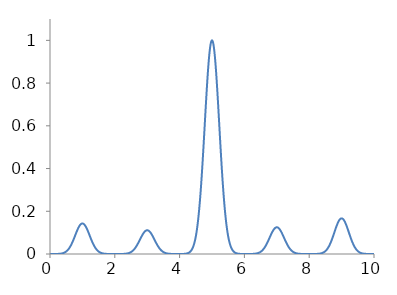
| Category | Series 0 |
|---|---|
| 0.0 | 0 |
| 0.001 | 0 |
| 0.002 | 0 |
| 0.003 | 0 |
| 0.004 | 0 |
| 0.005 | 0 |
| 0.006 | 0 |
| 0.007 | 0 |
| 0.008 | 0 |
| 0.009 | 0 |
| 0.01 | 0 |
| 0.011 | 0 |
| 0.012 | 0 |
| 0.013 | 0 |
| 0.014 | 0 |
| 0.015 | 0 |
| 0.016 | 0 |
| 0.017 | 0 |
| 0.018 | 0 |
| 0.019 | 0 |
| 0.02 | 0 |
| 0.021 | 0 |
| 0.022 | 0 |
| 0.023 | 0 |
| 0.024 | 0 |
| 0.025 | 0 |
| 0.026 | 0 |
| 0.027 | 0 |
| 0.028 | 0 |
| 0.029 | 0 |
| 0.03 | 0 |
| 0.031 | 0 |
| 0.032 | 0 |
| 0.033 | 0 |
| 0.034 | 0 |
| 0.035 | 0 |
| 0.036 | 0 |
| 0.037 | 0 |
| 0.038 | 0 |
| 0.039 | 0 |
| 0.04 | 0 |
| 0.041 | 0 |
| 0.042 | 0 |
| 0.043 | 0 |
| 0.044 | 0 |
| 0.045 | 0 |
| 0.046 | 0 |
| 0.047 | 0 |
| 0.048 | 0 |
| 0.049 | 0 |
| 0.05 | 0 |
| 0.051 | 0 |
| 0.052 | 0 |
| 0.053 | 0 |
| 0.054 | 0 |
| 0.055 | 0 |
| 0.056 | 0 |
| 0.057 | 0 |
| 0.058 | 0 |
| 0.059 | 0 |
| 0.06 | 0 |
| 0.061 | 0 |
| 0.062 | 0 |
| 0.063 | 0 |
| 0.064 | 0 |
| 0.065 | 0 |
| 0.066 | 0 |
| 0.067 | 0 |
| 0.068 | 0 |
| 0.069 | 0 |
| 0.07 | 0 |
| 0.071 | 0 |
| 0.072 | 0 |
| 0.073 | 0 |
| 0.074 | 0 |
| 0.075 | 0 |
| 0.076 | 0 |
| 0.077 | 0 |
| 0.078 | 0 |
| 0.079 | 0 |
| 0.08 | 0 |
| 0.081 | 0 |
| 0.082 | 0 |
| 0.083 | 0 |
| 0.084 | 0 |
| 0.085 | 0 |
| 0.086 | 0 |
| 0.087 | 0 |
| 0.088 | 0 |
| 0.089 | 0 |
| 0.09 | 0 |
| 0.091 | 0 |
| 0.092 | 0 |
| 0.093 | 0 |
| 0.094 | 0 |
| 0.095 | 0 |
| 0.096 | 0 |
| 0.097 | 0 |
| 0.098 | 0 |
| 0.099 | 0 |
| 0.1 | 0 |
| 0.101 | 0 |
| 0.102 | 0 |
| 0.103 | 0 |
| 0.104 | 0 |
| 0.105 | 0 |
| 0.106 | 0 |
| 0.107 | 0 |
| 0.108 | 0 |
| 0.109 | 0 |
| 0.11 | 0 |
| 0.111 | 0 |
| 0.112 | 0 |
| 0.113 | 0 |
| 0.114 | 0 |
| 0.115 | 0 |
| 0.116 | 0 |
| 0.117 | 0 |
| 0.118 | 0 |
| 0.119 | 0 |
| 0.12 | 0 |
| 0.121 | 0 |
| 0.122 | 0 |
| 0.123 | 0 |
| 0.124 | 0 |
| 0.125 | 0 |
| 0.126 | 0 |
| 0.127 | 0 |
| 0.128 | 0 |
| 0.129 | 0 |
| 0.13 | 0 |
| 0.131 | 0 |
| 0.132 | 0 |
| 0.133 | 0 |
| 0.134 | 0 |
| 0.135 | 0 |
| 0.136 | 0 |
| 0.137 | 0 |
| 0.138 | 0 |
| 0.139 | 0 |
| 0.14 | 0 |
| 0.141 | 0 |
| 0.142 | 0 |
| 0.143 | 0 |
| 0.144 | 0 |
| 0.145 | 0 |
| 0.146 | 0 |
| 0.147 | 0 |
| 0.148 | 0 |
| 0.149 | 0 |
| 0.15 | 0 |
| 0.151 | 0 |
| 0.152 | 0 |
| 0.153 | 0 |
| 0.154 | 0 |
| 0.155 | 0 |
| 0.156 | 0 |
| 0.157 | 0 |
| 0.158 | 0 |
| 0.159 | 0 |
| 0.16 | 0 |
| 0.161 | 0 |
| 0.162 | 0 |
| 0.163 | 0 |
| 0.164 | 0 |
| 0.165 | 0 |
| 0.166 | 0 |
| 0.167 | 0 |
| 0.168 | 0 |
| 0.169 | 0 |
| 0.17 | 0 |
| 0.171 | 0 |
| 0.172 | 0 |
| 0.173 | 0 |
| 0.174 | 0 |
| 0.175 | 0 |
| 0.176 | 0 |
| 0.177 | 0 |
| 0.178 | 0 |
| 0.179 | 0 |
| 0.18 | 0 |
| 0.181 | 0 |
| 0.182 | 0 |
| 0.183 | 0 |
| 0.184 | 0 |
| 0.185 | 0 |
| 0.186 | 0 |
| 0.187 | 0 |
| 0.188 | 0 |
| 0.189 | 0 |
| 0.19 | 0 |
| 0.191 | 0 |
| 0.192 | 0 |
| 0.193 | 0 |
| 0.194 | 0 |
| 0.195 | 0 |
| 0.196 | 0 |
| 0.197 | 0 |
| 0.198 | 0 |
| 0.199 | 0 |
| 0.2 | 0 |
| 0.201 | 0 |
| 0.202 | 0 |
| 0.203 | 0 |
| 0.204 | 0 |
| 0.205 | 0 |
| 0.206 | 0 |
| 0.207 | 0 |
| 0.208 | 0 |
| 0.209 | 0 |
| 0.21 | 0 |
| 0.211 | 0 |
| 0.212 | 0 |
| 0.213 | 0 |
| 0.214 | 0 |
| 0.215 | 0 |
| 0.216 | 0 |
| 0.217 | 0 |
| 0.218 | 0 |
| 0.219 | 0 |
| 0.22 | 0 |
| 0.221 | 0 |
| 0.222 | 0 |
| 0.223 | 0 |
| 0.224 | 0 |
| 0.225 | 0 |
| 0.226 | 0 |
| 0.227 | 0 |
| 0.228 | 0 |
| 0.229 | 0 |
| 0.23 | 0 |
| 0.231 | 0 |
| 0.232 | 0 |
| 0.233 | 0 |
| 0.234 | 0 |
| 0.235 | 0 |
| 0.236 | 0 |
| 0.237 | 0 |
| 0.238 | 0 |
| 0.239 | 0 |
| 0.24 | 0 |
| 0.241 | 0 |
| 0.242 | 0 |
| 0.243 | 0 |
| 0.244 | 0 |
| 0.245 | 0 |
| 0.246 | 0 |
| 0.247 | 0 |
| 0.248 | 0 |
| 0.249 | 0.001 |
| 0.25 | 0.001 |
| 0.251 | 0.001 |
| 0.252 | 0.001 |
| 0.253 | 0.001 |
| 0.254 | 0.001 |
| 0.255 | 0.001 |
| 0.256 | 0.001 |
| 0.257 | 0.001 |
| 0.258 | 0.001 |
| 0.259 | 0.001 |
| 0.26 | 0.001 |
| 0.261 | 0.001 |
| 0.262 | 0.001 |
| 0.263 | 0.001 |
| 0.264 | 0.001 |
| 0.265 | 0.001 |
| 0.266 | 0.001 |
| 0.267 | 0.001 |
| 0.268 | 0.001 |
| 0.269 | 0.001 |
| 0.27 | 0.001 |
| 0.271 | 0.001 |
| 0.272 | 0.001 |
| 0.273 | 0.001 |
| 0.274 | 0.001 |
| 0.275 | 0.001 |
| 0.276 | 0.001 |
| 0.277 | 0.001 |
| 0.278 | 0.001 |
| 0.279 | 0.001 |
| 0.28 | 0.001 |
| 0.281 | 0.001 |
| 0.282 | 0.001 |
| 0.283 | 0.001 |
| 0.284 | 0.001 |
| 0.285 | 0.001 |
| 0.286 | 0.001 |
| 0.287 | 0.001 |
| 0.288 | 0.001 |
| 0.289 | 0.001 |
| 0.29 | 0.001 |
| 0.291 | 0.001 |
| 0.292 | 0.001 |
| 0.293 | 0.001 |
| 0.294 | 0.001 |
| 0.295 | 0.001 |
| 0.296 | 0.001 |
| 0.297 | 0.001 |
| 0.298 | 0.001 |
| 0.299 | 0.001 |
| 0.3 | 0.001 |
| 0.301 | 0.001 |
| 0.302 | 0.001 |
| 0.303 | 0.001 |
| 0.304 | 0.001 |
| 0.305 | 0.001 |
| 0.306 | 0.001 |
| 0.307 | 0.001 |
| 0.308 | 0.001 |
| 0.309 | 0.001 |
| 0.31 | 0.001 |
| 0.311 | 0.001 |
| 0.312 | 0.001 |
| 0.313 | 0.001 |
| 0.314 | 0.001 |
| 0.315 | 0.001 |
| 0.316 | 0.001 |
| 0.317 | 0.001 |
| 0.318 | 0.001 |
| 0.319 | 0.001 |
| 0.32 | 0.001 |
| 0.321 | 0.001 |
| 0.322 | 0.001 |
| 0.323 | 0.001 |
| 0.324 | 0.001 |
| 0.325 | 0.002 |
| 0.326 | 0.002 |
| 0.327 | 0.002 |
| 0.328 | 0.002 |
| 0.329 | 0.002 |
| 0.33 | 0.002 |
| 0.331 | 0.002 |
| 0.332 | 0.002 |
| 0.333 | 0.002 |
| 0.334 | 0.002 |
| 0.335 | 0.002 |
| 0.336 | 0.002 |
| 0.337 | 0.002 |
| 0.338 | 0.002 |
| 0.339 | 0.002 |
| 0.34 | 0.002 |
| 0.341 | 0.002 |
| 0.342 | 0.002 |
| 0.343 | 0.002 |
| 0.344 | 0.002 |
| 0.345 | 0.002 |
| 0.346 | 0.002 |
| 0.347 | 0.002 |
| 0.348 | 0.002 |
| 0.349 | 0.002 |
| 0.35 | 0.002 |
| 0.351 | 0.002 |
| 0.352 | 0.002 |
| 0.353 | 0.002 |
| 0.354 | 0.002 |
| 0.355 | 0.002 |
| 0.356 | 0.002 |
| 0.357 | 0.002 |
| 0.358 | 0.002 |
| 0.359 | 0.002 |
| 0.36 | 0.002 |
| 0.361 | 0.002 |
| 0.362 | 0.002 |
| 0.363 | 0.002 |
| 0.364 | 0.003 |
| 0.365 | 0.003 |
| 0.366 | 0.003 |
| 0.367 | 0.003 |
| 0.368 | 0.003 |
| 0.369 | 0.003 |
| 0.37 | 0.003 |
| 0.371 | 0.003 |
| 0.372 | 0.003 |
| 0.373 | 0.003 |
| 0.374 | 0.003 |
| 0.375 | 0.003 |
| 0.376 | 0.003 |
| 0.377 | 0.003 |
| 0.378 | 0.003 |
| 0.379 | 0.003 |
| 0.38 | 0.003 |
| 0.381 | 0.003 |
| 0.382 | 0.003 |
| 0.383 | 0.003 |
| 0.384 | 0.003 |
| 0.385 | 0.003 |
| 0.386 | 0.003 |
| 0.387 | 0.003 |
| 0.388 | 0.003 |
| 0.389 | 0.003 |
| 0.39 | 0.003 |
| 0.391 | 0.004 |
| 0.392 | 0.004 |
| 0.393 | 0.004 |
| 0.394 | 0.004 |
| 0.395 | 0.004 |
| 0.396 | 0.004 |
| 0.397 | 0.004 |
| 0.398 | 0.004 |
| 0.399 | 0.004 |
| 0.4 | 0.004 |
| 0.401 | 0.004 |
| 0.402 | 0.004 |
| 0.403 | 0.004 |
| 0.404 | 0.004 |
| 0.405 | 0.004 |
| 0.406 | 0.004 |
| 0.407 | 0.004 |
| 0.408 | 0.004 |
| 0.409 | 0.004 |
| 0.41 | 0.004 |
| 0.411 | 0.004 |
| 0.412 | 0.005 |
| 0.413 | 0.005 |
| 0.414 | 0.005 |
| 0.415 | 0.005 |
| 0.416 | 0.005 |
| 0.417 | 0.005 |
| 0.418 | 0.005 |
| 0.419 | 0.005 |
| 0.42 | 0.005 |
| 0.421 | 0.005 |
| 0.422 | 0.005 |
| 0.423 | 0.005 |
| 0.424 | 0.005 |
| 0.425 | 0.005 |
| 0.426 | 0.005 |
| 0.427 | 0.005 |
| 0.428 | 0.005 |
| 0.429 | 0.005 |
| 0.43 | 0.006 |
| 0.431 | 0.006 |
| 0.432 | 0.006 |
| 0.433 | 0.006 |
| 0.434 | 0.006 |
| 0.435 | 0.006 |
| 0.436 | 0.006 |
| 0.437 | 0.006 |
| 0.438 | 0.006 |
| 0.439 | 0.006 |
| 0.44 | 0.006 |
| 0.441 | 0.006 |
| 0.442 | 0.006 |
| 0.443 | 0.006 |
| 0.444 | 0.006 |
| 0.445 | 0.007 |
| 0.446 | 0.007 |
| 0.447 | 0.007 |
| 0.448 | 0.007 |
| 0.449 | 0.007 |
| 0.45 | 0.007 |
| 0.451 | 0.007 |
| 0.452 | 0.007 |
| 0.453 | 0.007 |
| 0.454 | 0.007 |
| 0.455 | 0.007 |
| 0.456 | 0.007 |
| 0.457 | 0.007 |
| 0.458 | 0.008 |
| 0.459 | 0.008 |
| 0.46 | 0.008 |
| 0.461 | 0.008 |
| 0.462 | 0.008 |
| 0.463 | 0.008 |
| 0.464 | 0.008 |
| 0.465 | 0.008 |
| 0.466 | 0.008 |
| 0.467 | 0.008 |
| 0.468 | 0.008 |
| 0.469 | 0.009 |
| 0.47 | 0.009 |
| 0.471 | 0.009 |
| 0.472 | 0.009 |
| 0.473 | 0.009 |
| 0.474 | 0.009 |
| 0.475 | 0.009 |
| 0.476 | 0.009 |
| 0.477 | 0.009 |
| 0.478 | 0.009 |
| 0.479 | 0.009 |
| 0.48 | 0.01 |
| 0.481 | 0.01 |
| 0.482 | 0.01 |
| 0.483 | 0.01 |
| 0.484 | 0.01 |
| 0.485 | 0.01 |
| 0.486 | 0.01 |
| 0.487 | 0.01 |
| 0.488 | 0.01 |
| 0.489 | 0.01 |
| 0.49 | 0.011 |
| 0.491 | 0.011 |
| 0.492 | 0.011 |
| 0.493 | 0.011 |
| 0.494 | 0.011 |
| 0.495 | 0.011 |
| 0.496 | 0.011 |
| 0.497 | 0.011 |
| 0.498 | 0.011 |
| 0.499 | 0.012 |
| 0.5 | 0.012 |
| 0.501 | 0.012 |
| 0.502 | 0.012 |
| 0.503 | 0.012 |
| 0.504 | 0.012 |
| 0.505 | 0.012 |
| 0.506 | 0.012 |
| 0.507 | 0.013 |
| 0.508 | 0.013 |
| 0.509 | 0.013 |
| 0.51 | 0.013 |
| 0.511 | 0.013 |
| 0.512 | 0.013 |
| 0.513 | 0.013 |
| 0.514 | 0.013 |
| 0.515 | 0.014 |
| 0.516 | 0.014 |
| 0.517 | 0.014 |
| 0.518 | 0.014 |
| 0.519 | 0.014 |
| 0.52 | 0.014 |
| 0.521 | 0.014 |
| 0.522 | 0.015 |
| 0.523 | 0.015 |
| 0.524 | 0.015 |
| 0.525 | 0.015 |
| 0.526 | 0.015 |
| 0.527 | 0.015 |
| 0.528 | 0.015 |
| 0.529 | 0.016 |
| 0.53 | 0.016 |
| 0.531 | 0.016 |
| 0.532 | 0.016 |
| 0.533 | 0.016 |
| 0.534 | 0.016 |
| 0.535 | 0.016 |
| 0.536 | 0.017 |
| 0.537 | 0.017 |
| 0.538 | 0.017 |
| 0.539 | 0.017 |
| 0.54 | 0.017 |
| 0.541 | 0.017 |
| 0.542 | 0.018 |
| 0.543 | 0.018 |
| 0.544 | 0.018 |
| 0.545 | 0.018 |
| 0.546 | 0.018 |
| 0.547 | 0.018 |
| 0.548 | 0.019 |
| 0.549 | 0.019 |
| 0.55 | 0.019 |
| 0.551 | 0.019 |
| 0.552 | 0.019 |
| 0.553 | 0.019 |
| 0.554 | 0.02 |
| 0.555 | 0.02 |
| 0.556 | 0.02 |
| 0.557 | 0.02 |
| 0.558 | 0.02 |
| 0.559 | 0.02 |
| 0.56 | 0.021 |
| 0.561 | 0.021 |
| 0.562 | 0.021 |
| 0.563 | 0.021 |
| 0.564 | 0.021 |
| 0.565 | 0.022 |
| 0.566 | 0.022 |
| 0.567 | 0.022 |
| 0.568 | 0.022 |
| 0.569 | 0.022 |
| 0.57 | 0.022 |
| 0.571 | 0.023 |
| 0.572 | 0.023 |
| 0.573 | 0.023 |
| 0.574 | 0.023 |
| 0.575 | 0.023 |
| 0.576 | 0.024 |
| 0.577 | 0.024 |
| 0.578 | 0.024 |
| 0.579 | 0.024 |
| 0.58 | 0.024 |
| 0.581 | 0.025 |
| 0.582 | 0.025 |
| 0.583 | 0.025 |
| 0.584 | 0.025 |
| 0.585 | 0.026 |
| 0.586 | 0.026 |
| 0.587 | 0.026 |
| 0.588 | 0.026 |
| 0.589 | 0.026 |
| 0.59 | 0.027 |
| 0.591 | 0.027 |
| 0.592 | 0.027 |
| 0.593 | 0.027 |
| 0.594 | 0.027 |
| 0.595 | 0.028 |
| 0.596 | 0.028 |
| 0.597 | 0.028 |
| 0.598 | 0.028 |
| 0.599 | 0.029 |
| 0.6 | 0.029 |
| 0.601 | 0.029 |
| 0.602 | 0.029 |
| 0.603 | 0.03 |
| 0.604 | 0.03 |
| 0.605 | 0.03 |
| 0.606 | 0.03 |
| 0.607 | 0.03 |
| 0.608 | 0.031 |
| 0.609 | 0.031 |
| 0.61 | 0.031 |
| 0.611 | 0.031 |
| 0.612 | 0.032 |
| 0.613 | 0.032 |
| 0.614 | 0.032 |
| 0.615 | 0.032 |
| 0.616 | 0.033 |
| 0.617 | 0.033 |
| 0.618 | 0.033 |
| 0.619 | 0.033 |
| 0.62 | 0.034 |
| 0.621 | 0.034 |
| 0.622 | 0.034 |
| 0.623 | 0.034 |
| 0.624 | 0.035 |
| 0.625 | 0.035 |
| 0.626 | 0.035 |
| 0.627 | 0.036 |
| 0.628 | 0.036 |
| 0.629 | 0.036 |
| 0.63 | 0.036 |
| 0.631 | 0.037 |
| 0.632 | 0.037 |
| 0.633 | 0.037 |
| 0.634 | 0.037 |
| 0.635 | 0.038 |
| 0.636 | 0.038 |
| 0.637 | 0.038 |
| 0.638 | 0.039 |
| 0.639 | 0.039 |
| 0.64 | 0.039 |
| 0.641 | 0.039 |
| 0.642 | 0.04 |
| 0.643 | 0.04 |
| 0.644 | 0.04 |
| 0.645 | 0.041 |
| 0.646 | 0.041 |
| 0.647 | 0.041 |
| 0.648 | 0.041 |
| 0.649 | 0.042 |
| 0.65 | 0.042 |
| 0.651 | 0.042 |
| 0.652 | 0.043 |
| 0.653 | 0.043 |
| 0.654 | 0.043 |
| 0.655 | 0.043 |
| 0.656 | 0.044 |
| 0.657 | 0.044 |
| 0.658 | 0.044 |
| 0.659 | 0.045 |
| 0.66 | 0.045 |
| 0.661 | 0.045 |
| 0.662 | 0.046 |
| 0.663 | 0.046 |
| 0.664 | 0.046 |
| 0.665 | 0.047 |
| 0.666 | 0.047 |
| 0.667 | 0.047 |
| 0.668 | 0.047 |
| 0.669 | 0.048 |
| 0.67 | 0.048 |
| 0.671 | 0.048 |
| 0.672 | 0.049 |
| 0.673 | 0.049 |
| 0.674 | 0.049 |
| 0.675 | 0.05 |
| 0.676 | 0.05 |
| 0.677 | 0.05 |
| 0.678 | 0.051 |
| 0.679 | 0.051 |
| 0.68 | 0.051 |
| 0.681 | 0.052 |
| 0.682 | 0.052 |
| 0.683 | 0.052 |
| 0.684 | 0.053 |
| 0.685 | 0.053 |
| 0.686 | 0.053 |
| 0.687 | 0.054 |
| 0.688 | 0.054 |
| 0.689 | 0.054 |
| 0.69 | 0.055 |
| 0.691 | 0.055 |
| 0.692 | 0.055 |
| 0.693 | 0.056 |
| 0.694 | 0.056 |
| 0.695 | 0.056 |
| 0.696 | 0.057 |
| 0.697 | 0.057 |
| 0.698 | 0.057 |
| 0.699 | 0.058 |
| 0.7 | 0.058 |
| 0.701 | 0.058 |
| 0.702 | 0.059 |
| 0.703 | 0.059 |
| 0.704 | 0.059 |
| 0.705 | 0.06 |
| 0.706 | 0.06 |
| 0.707 | 0.061 |
| 0.708 | 0.061 |
| 0.709 | 0.061 |
| 0.71 | 0.062 |
| 0.711 | 0.062 |
| 0.712 | 0.062 |
| 0.713 | 0.063 |
| 0.714 | 0.063 |
| 0.715 | 0.063 |
| 0.716 | 0.064 |
| 0.717 | 0.064 |
| 0.718 | 0.064 |
| 0.719 | 0.065 |
| 0.72 | 0.065 |
| 0.721 | 0.066 |
| 0.722 | 0.066 |
| 0.723 | 0.066 |
| 0.724 | 0.067 |
| 0.725 | 0.067 |
| 0.726 | 0.067 |
| 0.727 | 0.068 |
| 0.728 | 0.068 |
| 0.729 | 0.069 |
| 0.73 | 0.069 |
| 0.731 | 0.069 |
| 0.732 | 0.07 |
| 0.733 | 0.07 |
| 0.734 | 0.07 |
| 0.735 | 0.071 |
| 0.736 | 0.071 |
| 0.737 | 0.072 |
| 0.738 | 0.072 |
| 0.739 | 0.072 |
| 0.74 | 0.073 |
| 0.741 | 0.073 |
| 0.742 | 0.073 |
| 0.743 | 0.074 |
| 0.744 | 0.074 |
| 0.745 | 0.075 |
| 0.746 | 0.075 |
| 0.747 | 0.075 |
| 0.748 | 0.076 |
| 0.749 | 0.076 |
| 0.75 | 0.076 |
| 0.751 | 0.077 |
| 0.752 | 0.077 |
| 0.753 | 0.078 |
| 0.754 | 0.078 |
| 0.755 | 0.078 |
| 0.756 | 0.079 |
| 0.757 | 0.079 |
| 0.758 | 0.08 |
| 0.759 | 0.08 |
| 0.76 | 0.08 |
| 0.761 | 0.081 |
| 0.762 | 0.081 |
| 0.763 | 0.081 |
| 0.764 | 0.082 |
| 0.765 | 0.082 |
| 0.766 | 0.083 |
| 0.767 | 0.083 |
| 0.768 | 0.083 |
| 0.769 | 0.084 |
| 0.77 | 0.084 |
| 0.771 | 0.085 |
| 0.772 | 0.085 |
| 0.773 | 0.085 |
| 0.774 | 0.086 |
| 0.775 | 0.086 |
| 0.776 | 0.086 |
| 0.777 | 0.087 |
| 0.778 | 0.087 |
| 0.779 | 0.088 |
| 0.78 | 0.088 |
| 0.781 | 0.088 |
| 0.782 | 0.089 |
| 0.783 | 0.089 |
| 0.784 | 0.09 |
| 0.785 | 0.09 |
| 0.786 | 0.09 |
| 0.787 | 0.091 |
| 0.788 | 0.091 |
| 0.789 | 0.092 |
| 0.79 | 0.092 |
| 0.791 | 0.092 |
| 0.792 | 0.093 |
| 0.793 | 0.093 |
| 0.794 | 0.093 |
| 0.795 | 0.094 |
| 0.796 | 0.094 |
| 0.797 | 0.095 |
| 0.798 | 0.095 |
| 0.799 | 0.095 |
| 0.8 | 0.096 |
| 0.801 | 0.096 |
| 0.802 | 0.097 |
| 0.803 | 0.097 |
| 0.804 | 0.097 |
| 0.805 | 0.098 |
| 0.806 | 0.098 |
| 0.807 | 0.098 |
| 0.808 | 0.099 |
| 0.809 | 0.099 |
| 0.81 | 0.1 |
| 0.811 | 0.1 |
| 0.812 | 0.1 |
| 0.813 | 0.101 |
| 0.814 | 0.101 |
| 0.815 | 0.101 |
| 0.816 | 0.102 |
| 0.817 | 0.102 |
| 0.818 | 0.103 |
| 0.819 | 0.103 |
| 0.82 | 0.103 |
| 0.821 | 0.104 |
| 0.822 | 0.104 |
| 0.823 | 0.104 |
| 0.824 | 0.105 |
| 0.825 | 0.105 |
| 0.826 | 0.106 |
| 0.827 | 0.106 |
| 0.828 | 0.106 |
| 0.829 | 0.107 |
| 0.83 | 0.107 |
| 0.831 | 0.107 |
| 0.832 | 0.108 |
| 0.833 | 0.108 |
| 0.834 | 0.108 |
| 0.835 | 0.109 |
| 0.836 | 0.109 |
| 0.837 | 0.11 |
| 0.838 | 0.11 |
| 0.839 | 0.11 |
| 0.84 | 0.111 |
| 0.841 | 0.111 |
| 0.842 | 0.111 |
| 0.843 | 0.112 |
| 0.844 | 0.112 |
| 0.845 | 0.112 |
| 0.846 | 0.113 |
| 0.847 | 0.113 |
| 0.848 | 0.113 |
| 0.849 | 0.114 |
| 0.85 | 0.114 |
| 0.851 | 0.114 |
| 0.852 | 0.115 |
| 0.853 | 0.115 |
| 0.854 | 0.115 |
| 0.855 | 0.116 |
| 0.856 | 0.116 |
| 0.857 | 0.116 |
| 0.858 | 0.117 |
| 0.859 | 0.117 |
| 0.86 | 0.117 |
| 0.861 | 0.118 |
| 0.862 | 0.118 |
| 0.863 | 0.118 |
| 0.864 | 0.119 |
| 0.865 | 0.119 |
| 0.866 | 0.119 |
| 0.867 | 0.12 |
| 0.868 | 0.12 |
| 0.869 | 0.12 |
| 0.87 | 0.121 |
| 0.871 | 0.121 |
| 0.872 | 0.121 |
| 0.873 | 0.122 |
| 0.874 | 0.122 |
| 0.875 | 0.122 |
| 0.876 | 0.122 |
| 0.877 | 0.123 |
| 0.878 | 0.123 |
| 0.879 | 0.123 |
| 0.88 | 0.124 |
| 0.881 | 0.124 |
| 0.882 | 0.124 |
| 0.883 | 0.125 |
| 0.884 | 0.125 |
| 0.885 | 0.125 |
| 0.886 | 0.125 |
| 0.887 | 0.126 |
| 0.888 | 0.126 |
| 0.889 | 0.126 |
| 0.89 | 0.127 |
| 0.891 | 0.127 |
| 0.892 | 0.127 |
| 0.893 | 0.127 |
| 0.894 | 0.128 |
| 0.895 | 0.128 |
| 0.896 | 0.128 |
| 0.897 | 0.128 |
| 0.898 | 0.129 |
| 0.899 | 0.129 |
| 0.9 | 0.129 |
| 0.901 | 0.13 |
| 0.902 | 0.13 |
| 0.903 | 0.13 |
| 0.904 | 0.13 |
| 0.905 | 0.131 |
| 0.906 | 0.131 |
| 0.907 | 0.131 |
| 0.908 | 0.131 |
| 0.909 | 0.132 |
| 0.91 | 0.132 |
| 0.911 | 0.132 |
| 0.912 | 0.132 |
| 0.913 | 0.132 |
| 0.914 | 0.133 |
| 0.915 | 0.133 |
| 0.916 | 0.133 |
| 0.917 | 0.133 |
| 0.918 | 0.134 |
| 0.919 | 0.134 |
| 0.92 | 0.134 |
| 0.921 | 0.134 |
| 0.922 | 0.134 |
| 0.923 | 0.135 |
| 0.924 | 0.135 |
| 0.925 | 0.135 |
| 0.926 | 0.135 |
| 0.927 | 0.135 |
| 0.928 | 0.136 |
| 0.929 | 0.136 |
| 0.93 | 0.136 |
| 0.931 | 0.136 |
| 0.932 | 0.136 |
| 0.933 | 0.137 |
| 0.934 | 0.137 |
| 0.935 | 0.137 |
| 0.936 | 0.137 |
| 0.937 | 0.137 |
| 0.938 | 0.137 |
| 0.939 | 0.138 |
| 0.94 | 0.138 |
| 0.941 | 0.138 |
| 0.942 | 0.138 |
| 0.943 | 0.138 |
| 0.944 | 0.138 |
| 0.945 | 0.139 |
| 0.946 | 0.139 |
| 0.947 | 0.139 |
| 0.948 | 0.139 |
| 0.949 | 0.139 |
| 0.95 | 0.139 |
| 0.951 | 0.139 |
| 0.952 | 0.14 |
| 0.953 | 0.14 |
| 0.954 | 0.14 |
| 0.955 | 0.14 |
| 0.956 | 0.14 |
| 0.957 | 0.14 |
| 0.958 | 0.14 |
| 0.959 | 0.14 |
| 0.96 | 0.141 |
| 0.961 | 0.141 |
| 0.962 | 0.141 |
| 0.963 | 0.141 |
| 0.964 | 0.141 |
| 0.965 | 0.141 |
| 0.966 | 0.141 |
| 0.967 | 0.141 |
| 0.968 | 0.141 |
| 0.969 | 0.141 |
| 0.97 | 0.142 |
| 0.971 | 0.142 |
| 0.972 | 0.142 |
| 0.973 | 0.142 |
| 0.974 | 0.142 |
| 0.975 | 0.142 |
| 0.976 | 0.142 |
| 0.977 | 0.142 |
| 0.978 | 0.142 |
| 0.979 | 0.142 |
| 0.98 | 0.142 |
| 0.981 | 0.142 |
| 0.982 | 0.142 |
| 0.983 | 0.142 |
| 0.984 | 0.142 |
| 0.985 | 0.143 |
| 0.986 | 0.143 |
| 0.987 | 0.143 |
| 0.988 | 0.143 |
| 0.989 | 0.143 |
| 0.99 | 0.143 |
| 0.991 | 0.143 |
| 0.992 | 0.143 |
| 0.993 | 0.143 |
| 0.994 | 0.143 |
| 0.995 | 0.143 |
| 0.996 | 0.143 |
| 0.997 | 0.143 |
| 0.998 | 0.143 |
| 0.999 | 0.143 |
| 1.0 | 0.143 |
| 1.001 | 0.143 |
| 1.002 | 0.143 |
| 1.003 | 0.143 |
| 1.004 | 0.143 |
| 1.005 | 0.143 |
| 1.006 | 0.143 |
| 1.007 | 0.143 |
| 1.008 | 0.143 |
| 1.009 | 0.143 |
| 1.01 | 0.143 |
| 1.011 | 0.143 |
| 1.012 | 0.143 |
| 1.013 | 0.143 |
| 1.014 | 0.143 |
| 1.015 | 0.143 |
| 1.016 | 0.142 |
| 1.017 | 0.142 |
| 1.018 | 0.142 |
| 1.019 | 0.142 |
| 1.02 | 0.142 |
| 1.021 | 0.142 |
| 1.022 | 0.142 |
| 1.023 | 0.142 |
| 1.024 | 0.142 |
| 1.025 | 0.142 |
| 1.026 | 0.142 |
| 1.027 | 0.142 |
| 1.028 | 0.142 |
| 1.029 | 0.142 |
| 1.03 | 0.142 |
| 1.031 | 0.141 |
| 1.032 | 0.141 |
| 1.033 | 0.141 |
| 1.034 | 0.141 |
| 1.035 | 0.141 |
| 1.036 | 0.141 |
| 1.037 | 0.141 |
| 1.038 | 0.141 |
| 1.039 | 0.141 |
| 1.04 | 0.141 |
| 1.041 | 0.14 |
| 1.042 | 0.14 |
| 1.043 | 0.14 |
| 1.044 | 0.14 |
| 1.045 | 0.14 |
| 1.046 | 0.14 |
| 1.047 | 0.14 |
| 1.048 | 0.14 |
| 1.049 | 0.139 |
| 1.05 | 0.139 |
| 1.051 | 0.139 |
| 1.052 | 0.139 |
| 1.053 | 0.139 |
| 1.054 | 0.139 |
| 1.055 | 0.139 |
| 1.056 | 0.138 |
| 1.057 | 0.138 |
| 1.058 | 0.138 |
| 1.059 | 0.138 |
| 1.06 | 0.138 |
| 1.061 | 0.138 |
| 1.062 | 0.137 |
| 1.063 | 0.137 |
| 1.064 | 0.137 |
| 1.065 | 0.137 |
| 1.066 | 0.137 |
| 1.067 | 0.137 |
| 1.068 | 0.136 |
| 1.069 | 0.136 |
| 1.07 | 0.136 |
| 1.071 | 0.136 |
| 1.072 | 0.136 |
| 1.073 | 0.135 |
| 1.074 | 0.135 |
| 1.075 | 0.135 |
| 1.076 | 0.135 |
| 1.077 | 0.135 |
| 1.078 | 0.134 |
| 1.079 | 0.134 |
| 1.08 | 0.134 |
| 1.081 | 0.134 |
| 1.082 | 0.134 |
| 1.083 | 0.133 |
| 1.084 | 0.133 |
| 1.085 | 0.133 |
| 1.086 | 0.133 |
| 1.087 | 0.132 |
| 1.088 | 0.132 |
| 1.089 | 0.132 |
| 1.09 | 0.132 |
| 1.091 | 0.132 |
| 1.092 | 0.131 |
| 1.093 | 0.131 |
| 1.094 | 0.131 |
| 1.095 | 0.131 |
| 1.096 | 0.13 |
| 1.097 | 0.13 |
| 1.098 | 0.13 |
| 1.099 | 0.13 |
| 1.1 | 0.129 |
| 1.101 | 0.129 |
| 1.102 | 0.129 |
| 1.103 | 0.128 |
| 1.104 | 0.128 |
| 1.105 | 0.128 |
| 1.106 | 0.128 |
| 1.107 | 0.127 |
| 1.108 | 0.127 |
| 1.109 | 0.127 |
| 1.11 | 0.127 |
| 1.111 | 0.126 |
| 1.112 | 0.126 |
| 1.113 | 0.126 |
| 1.114 | 0.125 |
| 1.115 | 0.125 |
| 1.116 | 0.125 |
| 1.117 | 0.125 |
| 1.118 | 0.124 |
| 1.119 | 0.124 |
| 1.12 | 0.124 |
| 1.121 | 0.123 |
| 1.122 | 0.123 |
| 1.123 | 0.123 |
| 1.124 | 0.122 |
| 1.125 | 0.122 |
| 1.126 | 0.122 |
| 1.127 | 0.122 |
| 1.128 | 0.121 |
| 1.129 | 0.121 |
| 1.13 | 0.121 |
| 1.131 | 0.12 |
| 1.132 | 0.12 |
| 1.133 | 0.12 |
| 1.134 | 0.119 |
| 1.135 | 0.119 |
| 1.136 | 0.119 |
| 1.137 | 0.118 |
| 1.138 | 0.118 |
| 1.139 | 0.118 |
| 1.14 | 0.117 |
| 1.141 | 0.117 |
| 1.142 | 0.117 |
| 1.143 | 0.116 |
| 1.144 | 0.116 |
| 1.145 | 0.116 |
| 1.146 | 0.115 |
| 1.147 | 0.115 |
| 1.148 | 0.115 |
| 1.149 | 0.114 |
| 1.15 | 0.114 |
| 1.151 | 0.114 |
| 1.152 | 0.113 |
| 1.153 | 0.113 |
| 1.154 | 0.113 |
| 1.155 | 0.112 |
| 1.156 | 0.112 |
| 1.157 | 0.112 |
| 1.158 | 0.111 |
| 1.159 | 0.111 |
| 1.16 | 0.111 |
| 1.161 | 0.11 |
| 1.162 | 0.11 |
| 1.163 | 0.11 |
| 1.164 | 0.109 |
| 1.165 | 0.109 |
| 1.166 | 0.108 |
| 1.167 | 0.108 |
| 1.168 | 0.108 |
| 1.169 | 0.107 |
| 1.17 | 0.107 |
| 1.171 | 0.107 |
| 1.172 | 0.106 |
| 1.173 | 0.106 |
| 1.174 | 0.106 |
| 1.175 | 0.105 |
| 1.176 | 0.105 |
| 1.177 | 0.104 |
| 1.178 | 0.104 |
| 1.179 | 0.104 |
| 1.18 | 0.103 |
| 1.181 | 0.103 |
| 1.182 | 0.103 |
| 1.183 | 0.102 |
| 1.184 | 0.102 |
| 1.185 | 0.101 |
| 1.186 | 0.101 |
| 1.187 | 0.101 |
| 1.188 | 0.1 |
| 1.189 | 0.1 |
| 1.19 | 0.1 |
| 1.191 | 0.099 |
| 1.192 | 0.099 |
| 1.193 | 0.098 |
| 1.194 | 0.098 |
| 1.195 | 0.098 |
| 1.196 | 0.097 |
| 1.197 | 0.097 |
| 1.198 | 0.097 |
| 1.199 | 0.096 |
| 1.2 | 0.096 |
| 1.201 | 0.095 |
| 1.202 | 0.095 |
| 1.203 | 0.095 |
| 1.204 | 0.094 |
| 1.205 | 0.094 |
| 1.206 | 0.093 |
| 1.207 | 0.093 |
| 1.208 | 0.093 |
| 1.209 | 0.092 |
| 1.21 | 0.092 |
| 1.211 | 0.092 |
| 1.212 | 0.091 |
| 1.213 | 0.091 |
| 1.214 | 0.09 |
| 1.215 | 0.09 |
| 1.216 | 0.09 |
| 1.217 | 0.089 |
| 1.218 | 0.089 |
| 1.219 | 0.088 |
| 1.22 | 0.088 |
| 1.221 | 0.088 |
| 1.222 | 0.087 |
| 1.223 | 0.087 |
| 1.224 | 0.086 |
| 1.225 | 0.086 |
| 1.226 | 0.086 |
| 1.227 | 0.085 |
| 1.228 | 0.085 |
| 1.229 | 0.085 |
| 1.23 | 0.084 |
| 1.231 | 0.084 |
| 1.232 | 0.083 |
| 1.233 | 0.083 |
| 1.234 | 0.083 |
| 1.235 | 0.082 |
| 1.236 | 0.082 |
| 1.237 | 0.081 |
| 1.238 | 0.081 |
| 1.239 | 0.081 |
| 1.24 | 0.08 |
| 1.241 | 0.08 |
| 1.242 | 0.08 |
| 1.243 | 0.079 |
| 1.244 | 0.079 |
| 1.245 | 0.078 |
| 1.246 | 0.078 |
| 1.247 | 0.078 |
| 1.248 | 0.077 |
| 1.249 | 0.077 |
| 1.25 | 0.076 |
| 1.251 | 0.076 |
| 1.252 | 0.076 |
| 1.253 | 0.075 |
| 1.254 | 0.075 |
| 1.255 | 0.075 |
| 1.256 | 0.074 |
| 1.257 | 0.074 |
| 1.258 | 0.073 |
| 1.259 | 0.073 |
| 1.26 | 0.073 |
| 1.261 | 0.072 |
| 1.262 | 0.072 |
| 1.263 | 0.072 |
| 1.264 | 0.071 |
| 1.265 | 0.071 |
| 1.266 | 0.07 |
| 1.267 | 0.07 |
| 1.268 | 0.07 |
| 1.269 | 0.069 |
| 1.27 | 0.069 |
| 1.271 | 0.069 |
| 1.272 | 0.068 |
| 1.273 | 0.068 |
| 1.274 | 0.067 |
| 1.275 | 0.067 |
| 1.276 | 0.067 |
| 1.277 | 0.066 |
| 1.278 | 0.066 |
| 1.279 | 0.066 |
| 1.28 | 0.065 |
| 1.281 | 0.065 |
| 1.282 | 0.064 |
| 1.283 | 0.064 |
| 1.284 | 0.064 |
| 1.285 | 0.063 |
| 1.286 | 0.063 |
| 1.287 | 0.063 |
| 1.288 | 0.062 |
| 1.289 | 0.062 |
| 1.29 | 0.062 |
| 1.291 | 0.061 |
| 1.292 | 0.061 |
| 1.293 | 0.061 |
| 1.294 | 0.06 |
| 1.295 | 0.06 |
| 1.296 | 0.059 |
| 1.297 | 0.059 |
| 1.298 | 0.059 |
| 1.299 | 0.058 |
| 1.3 | 0.058 |
| 1.301 | 0.058 |
| 1.302 | 0.057 |
| 1.303 | 0.057 |
| 1.304 | 0.057 |
| 1.305 | 0.056 |
| 1.306 | 0.056 |
| 1.307 | 0.056 |
| 1.308 | 0.055 |
| 1.309 | 0.055 |
| 1.31 | 0.055 |
| 1.311 | 0.054 |
| 1.312 | 0.054 |
| 1.313 | 0.054 |
| 1.314 | 0.053 |
| 1.315 | 0.053 |
| 1.316 | 0.053 |
| 1.317 | 0.052 |
| 1.318 | 0.052 |
| 1.319 | 0.052 |
| 1.32 | 0.051 |
| 1.321 | 0.051 |
| 1.322 | 0.051 |
| 1.323 | 0.05 |
| 1.324 | 0.05 |
| 1.325 | 0.05 |
| 1.326 | 0.049 |
| 1.327 | 0.049 |
| 1.328 | 0.049 |
| 1.329 | 0.048 |
| 1.33 | 0.048 |
| 1.331 | 0.048 |
| 1.332 | 0.047 |
| 1.333 | 0.047 |
| 1.334 | 0.047 |
| 1.335 | 0.047 |
| 1.336 | 0.046 |
| 1.337 | 0.046 |
| 1.338 | 0.046 |
| 1.339 | 0.045 |
| 1.34 | 0.045 |
| 1.341 | 0.045 |
| 1.342 | 0.044 |
| 1.343 | 0.044 |
| 1.344 | 0.044 |
| 1.345 | 0.043 |
| 1.346 | 0.043 |
| 1.347 | 0.043 |
| 1.348 | 0.043 |
| 1.349 | 0.042 |
| 1.35 | 0.042 |
| 1.351 | 0.042 |
| 1.352 | 0.041 |
| 1.353 | 0.041 |
| 1.354 | 0.041 |
| 1.355 | 0.041 |
| 1.356 | 0.04 |
| 1.357 | 0.04 |
| 1.358 | 0.04 |
| 1.359 | 0.039 |
| 1.36 | 0.039 |
| 1.361 | 0.039 |
| 1.362 | 0.039 |
| 1.363 | 0.038 |
| 1.364 | 0.038 |
| 1.365 | 0.038 |
| 1.366 | 0.037 |
| 1.367 | 0.037 |
| 1.368 | 0.037 |
| 1.369 | 0.037 |
| 1.37 | 0.036 |
| 1.371 | 0.036 |
| 1.372 | 0.036 |
| 1.373 | 0.036 |
| 1.374 | 0.035 |
| 1.375 | 0.035 |
| 1.376 | 0.035 |
| 1.377 | 0.034 |
| 1.378 | 0.034 |
| 1.379 | 0.034 |
| 1.38 | 0.034 |
| 1.381 | 0.033 |
| 1.382 | 0.033 |
| 1.383 | 0.033 |
| 1.384 | 0.033 |
| 1.385 | 0.032 |
| 1.386 | 0.032 |
| 1.387 | 0.032 |
| 1.388 | 0.032 |
| 1.389 | 0.031 |
| 1.39 | 0.031 |
| 1.391 | 0.031 |
| 1.392 | 0.031 |
| 1.393 | 0.03 |
| 1.394 | 0.03 |
| 1.395 | 0.03 |
| 1.396 | 0.03 |
| 1.397 | 0.03 |
| 1.398 | 0.029 |
| 1.399 | 0.029 |
| 1.4 | 0.029 |
| 1.401 | 0.029 |
| 1.402 | 0.028 |
| 1.403 | 0.028 |
| 1.404 | 0.028 |
| 1.405 | 0.028 |
| 1.406 | 0.027 |
| 1.407 | 0.027 |
| 1.408 | 0.027 |
| 1.409 | 0.027 |
| 1.41 | 0.027 |
| 1.411 | 0.026 |
| 1.412 | 0.026 |
| 1.413 | 0.026 |
| 1.414 | 0.026 |
| 1.415 | 0.026 |
| 1.416 | 0.025 |
| 1.417 | 0.025 |
| 1.418 | 0.025 |
| 1.419 | 0.025 |
| 1.42 | 0.024 |
| 1.421 | 0.024 |
| 1.422 | 0.024 |
| 1.423 | 0.024 |
| 1.424 | 0.024 |
| 1.425 | 0.023 |
| 1.426 | 0.023 |
| 1.427 | 0.023 |
| 1.428 | 0.023 |
| 1.429 | 0.023 |
| 1.43 | 0.022 |
| 1.431 | 0.022 |
| 1.432 | 0.022 |
| 1.433 | 0.022 |
| 1.434 | 0.022 |
| 1.435 | 0.022 |
| 1.436 | 0.021 |
| 1.437 | 0.021 |
| 1.438 | 0.021 |
| 1.439 | 0.021 |
| 1.44 | 0.021 |
| 1.441 | 0.02 |
| 1.442 | 0.02 |
| 1.443 | 0.02 |
| 1.444 | 0.02 |
| 1.445 | 0.02 |
| 1.446 | 0.02 |
| 1.447 | 0.019 |
| 1.448 | 0.019 |
| 1.449 | 0.019 |
| 1.45 | 0.019 |
| 1.451 | 0.019 |
| 1.452 | 0.019 |
| 1.453 | 0.018 |
| 1.454 | 0.018 |
| 1.455 | 0.018 |
| 1.456 | 0.018 |
| 1.457 | 0.018 |
| 1.458 | 0.018 |
| 1.459 | 0.017 |
| 1.46 | 0.017 |
| 1.461 | 0.017 |
| 1.462 | 0.017 |
| 1.463 | 0.017 |
| 1.464 | 0.017 |
| 1.465 | 0.016 |
| 1.466 | 0.016 |
| 1.467 | 0.016 |
| 1.468 | 0.016 |
| 1.469 | 0.016 |
| 1.47 | 0.016 |
| 1.471 | 0.016 |
| 1.472 | 0.015 |
| 1.473 | 0.015 |
| 1.474 | 0.015 |
| 1.475 | 0.015 |
| 1.476 | 0.015 |
| 1.477 | 0.015 |
| 1.478 | 0.015 |
| 1.479 | 0.014 |
| 1.48 | 0.014 |
| 1.481 | 0.014 |
| 1.482 | 0.014 |
| 1.483 | 0.014 |
| 1.484 | 0.014 |
| 1.485 | 0.014 |
| 1.486 | 0.013 |
| 1.487 | 0.013 |
| 1.488 | 0.013 |
| 1.489 | 0.013 |
| 1.49 | 0.013 |
| 1.491 | 0.013 |
| 1.492 | 0.013 |
| 1.493 | 0.013 |
| 1.494 | 0.012 |
| 1.495 | 0.012 |
| 1.496 | 0.012 |
| 1.497 | 0.012 |
| 1.498 | 0.012 |
| 1.499 | 0.012 |
| 1.5 | 0.012 |
| 1.501 | 0.012 |
| 1.502 | 0.011 |
| 1.503 | 0.011 |
| 1.504 | 0.011 |
| 1.505 | 0.011 |
| 1.506 | 0.011 |
| 1.507 | 0.011 |
| 1.508 | 0.011 |
| 1.509 | 0.011 |
| 1.51 | 0.011 |
| 1.511 | 0.01 |
| 1.512 | 0.01 |
| 1.513 | 0.01 |
| 1.514 | 0.01 |
| 1.515 | 0.01 |
| 1.516 | 0.01 |
| 1.517 | 0.01 |
| 1.518 | 0.01 |
| 1.519 | 0.01 |
| 1.52 | 0.01 |
| 1.521 | 0.009 |
| 1.522 | 0.009 |
| 1.523 | 0.009 |
| 1.524 | 0.009 |
| 1.525 | 0.009 |
| 1.526 | 0.009 |
| 1.527 | 0.009 |
| 1.528 | 0.009 |
| 1.529 | 0.009 |
| 1.53 | 0.009 |
| 1.531 | 0.009 |
| 1.532 | 0.008 |
| 1.533 | 0.008 |
| 1.534 | 0.008 |
| 1.535 | 0.008 |
| 1.536 | 0.008 |
| 1.537 | 0.008 |
| 1.538 | 0.008 |
| 1.539 | 0.008 |
| 1.54 | 0.008 |
| 1.541 | 0.008 |
| 1.542 | 0.008 |
| 1.543 | 0.007 |
| 1.544 | 0.007 |
| 1.545 | 0.007 |
| 1.546 | 0.007 |
| 1.547 | 0.007 |
| 1.548 | 0.007 |
| 1.549 | 0.007 |
| 1.55 | 0.007 |
| 1.551 | 0.007 |
| 1.552 | 0.007 |
| 1.553 | 0.007 |
| 1.554 | 0.007 |
| 1.555 | 0.007 |
| 1.556 | 0.006 |
| 1.557 | 0.006 |
| 1.558 | 0.006 |
| 1.559 | 0.006 |
| 1.56 | 0.006 |
| 1.561 | 0.006 |
| 1.562 | 0.006 |
| 1.563 | 0.006 |
| 1.564 | 0.006 |
| 1.565 | 0.006 |
| 1.566 | 0.006 |
| 1.567 | 0.006 |
| 1.568 | 0.006 |
| 1.569 | 0.006 |
| 1.57 | 0.006 |
| 1.571 | 0.005 |
| 1.572 | 0.005 |
| 1.573 | 0.005 |
| 1.574 | 0.005 |
| 1.575 | 0.005 |
| 1.576 | 0.005 |
| 1.577 | 0.005 |
| 1.578 | 0.005 |
| 1.579 | 0.005 |
| 1.58 | 0.005 |
| 1.581 | 0.005 |
| 1.582 | 0.005 |
| 1.583 | 0.005 |
| 1.584 | 0.005 |
| 1.585 | 0.005 |
| 1.586 | 0.005 |
| 1.587 | 0.005 |
| 1.588 | 0.005 |
| 1.589 | 0.004 |
| 1.59 | 0.004 |
| 1.591 | 0.004 |
| 1.592 | 0.004 |
| 1.593 | 0.004 |
| 1.594 | 0.004 |
| 1.595 | 0.004 |
| 1.596 | 0.004 |
| 1.597 | 0.004 |
| 1.598 | 0.004 |
| 1.599 | 0.004 |
| 1.6 | 0.004 |
| 1.601 | 0.004 |
| 1.602 | 0.004 |
| 1.603 | 0.004 |
| 1.604 | 0.004 |
| 1.605 | 0.004 |
| 1.606 | 0.004 |
| 1.607 | 0.004 |
| 1.608 | 0.004 |
| 1.609 | 0.004 |
| 1.61 | 0.003 |
| 1.611 | 0.003 |
| 1.612 | 0.003 |
| 1.613 | 0.003 |
| 1.614 | 0.003 |
| 1.615 | 0.003 |
| 1.616 | 0.003 |
| 1.617 | 0.003 |
| 1.618 | 0.003 |
| 1.619 | 0.003 |
| 1.62 | 0.003 |
| 1.621 | 0.003 |
| 1.622 | 0.003 |
| 1.623 | 0.003 |
| 1.624 | 0.003 |
| 1.625 | 0.003 |
| 1.626 | 0.003 |
| 1.627 | 0.003 |
| 1.628 | 0.003 |
| 1.629 | 0.003 |
| 1.63 | 0.003 |
| 1.631 | 0.003 |
| 1.632 | 0.003 |
| 1.633 | 0.003 |
| 1.634 | 0.003 |
| 1.635 | 0.003 |
| 1.636 | 0.003 |
| 1.637 | 0.002 |
| 1.638 | 0.002 |
| 1.639 | 0.002 |
| 1.64 | 0.002 |
| 1.641 | 0.002 |
| 1.642 | 0.002 |
| 1.643 | 0.002 |
| 1.644 | 0.002 |
| 1.645 | 0.002 |
| 1.646 | 0.002 |
| 1.647 | 0.002 |
| 1.648 | 0.002 |
| 1.649 | 0.002 |
| 1.65 | 0.002 |
| 1.651 | 0.002 |
| 1.652 | 0.002 |
| 1.653 | 0.002 |
| 1.654 | 0.002 |
| 1.655 | 0.002 |
| 1.656 | 0.002 |
| 1.657 | 0.002 |
| 1.658 | 0.002 |
| 1.659 | 0.002 |
| 1.66 | 0.002 |
| 1.661 | 0.002 |
| 1.662 | 0.002 |
| 1.663 | 0.002 |
| 1.664 | 0.002 |
| 1.665 | 0.002 |
| 1.666 | 0.002 |
| 1.667 | 0.002 |
| 1.668 | 0.002 |
| 1.669 | 0.002 |
| 1.67 | 0.002 |
| 1.671 | 0.002 |
| 1.672 | 0.002 |
| 1.673 | 0.002 |
| 1.674 | 0.002 |
| 1.675 | 0.002 |
| 1.676 | 0.001 |
| 1.677 | 0.001 |
| 1.678 | 0.001 |
| 1.679 | 0.001 |
| 1.68 | 0.001 |
| 1.681 | 0.001 |
| 1.682 | 0.001 |
| 1.683 | 0.001 |
| 1.684 | 0.001 |
| 1.685 | 0.001 |
| 1.686 | 0.001 |
| 1.687 | 0.001 |
| 1.688 | 0.001 |
| 1.689 | 0.001 |
| 1.69 | 0.001 |
| 1.691 | 0.001 |
| 1.692 | 0.001 |
| 1.693 | 0.001 |
| 1.694 | 0.001 |
| 1.695 | 0.001 |
| 1.696 | 0.001 |
| 1.697 | 0.001 |
| 1.698 | 0.001 |
| 1.699 | 0.001 |
| 1.7 | 0.001 |
| 1.701 | 0.001 |
| 1.702 | 0.001 |
| 1.703 | 0.001 |
| 1.704 | 0.001 |
| 1.705 | 0.001 |
| 1.706 | 0.001 |
| 1.707 | 0.001 |
| 1.708 | 0.001 |
| 1.709 | 0.001 |
| 1.71 | 0.001 |
| 1.711 | 0.001 |
| 1.712 | 0.001 |
| 1.713 | 0.001 |
| 1.714 | 0.001 |
| 1.715 | 0.001 |
| 1.716 | 0.001 |
| 1.717 | 0.001 |
| 1.718 | 0.001 |
| 1.719 | 0.001 |
| 1.72 | 0.001 |
| 1.721 | 0.001 |
| 1.722 | 0.001 |
| 1.723 | 0.001 |
| 1.724 | 0.001 |
| 1.725 | 0.001 |
| 1.726 | 0.001 |
| 1.727 | 0.001 |
| 1.728 | 0.001 |
| 1.729 | 0.001 |
| 1.73 | 0.001 |
| 1.731 | 0.001 |
| 1.732 | 0.001 |
| 1.733 | 0.001 |
| 1.734 | 0.001 |
| 1.735 | 0.001 |
| 1.736 | 0.001 |
| 1.737 | 0.001 |
| 1.738 | 0.001 |
| 1.739 | 0.001 |
| 1.74 | 0.001 |
| 1.741 | 0.001 |
| 1.742 | 0.001 |
| 1.743 | 0.001 |
| 1.744 | 0.001 |
| 1.745 | 0.001 |
| 1.746 | 0.001 |
| 1.747 | 0.001 |
| 1.748 | 0.001 |
| 1.749 | 0.001 |
| 1.75 | 0.001 |
| 1.751 | 0.001 |
| 1.752 | 0 |
| 1.753 | 0 |
| 1.754 | 0 |
| 1.755 | 0 |
| 1.756 | 0 |
| 1.757 | 0 |
| 1.758 | 0 |
| 1.759 | 0 |
| 1.76 | 0 |
| 1.761 | 0 |
| 1.762 | 0 |
| 1.763 | 0 |
| 1.764 | 0 |
| 1.765 | 0 |
| 1.766 | 0 |
| 1.767 | 0 |
| 1.768 | 0 |
| 1.769 | 0 |
| 1.77 | 0 |
| 1.771 | 0 |
| 1.772 | 0 |
| 1.773 | 0 |
| 1.774 | 0 |
| 1.775 | 0 |
| 1.776 | 0 |
| 1.777 | 0 |
| 1.778 | 0 |
| 1.779 | 0 |
| 1.78 | 0 |
| 1.781 | 0 |
| 1.782 | 0 |
| 1.783 | 0 |
| 1.784 | 0 |
| 1.785 | 0 |
| 1.786 | 0 |
| 1.787 | 0 |
| 1.788 | 0 |
| 1.789 | 0 |
| 1.79 | 0 |
| 1.791 | 0 |
| 1.792 | 0 |
| 1.793 | 0 |
| 1.794 | 0 |
| 1.795 | 0 |
| 1.796 | 0 |
| 1.797 | 0 |
| 1.798 | 0 |
| 1.799 | 0 |
| 1.8 | 0 |
| 1.801 | 0 |
| 1.802 | 0 |
| 1.803 | 0 |
| 1.804 | 0 |
| 1.805 | 0 |
| 1.806 | 0 |
| 1.807 | 0 |
| 1.808 | 0 |
| 1.809 | 0 |
| 1.81 | 0 |
| 1.811 | 0 |
| 1.812 | 0 |
| 1.813 | 0 |
| 1.814 | 0 |
| 1.815 | 0 |
| 1.816 | 0 |
| 1.817 | 0 |
| 1.818 | 0 |
| 1.819 | 0 |
| 1.82 | 0 |
| 1.821 | 0 |
| 1.822 | 0 |
| 1.823 | 0 |
| 1.824 | 0 |
| 1.825 | 0 |
| 1.826 | 0 |
| 1.827 | 0 |
| 1.828 | 0 |
| 1.829 | 0 |
| 1.83 | 0 |
| 1.831 | 0 |
| 1.832 | 0 |
| 1.833 | 0 |
| 1.834 | 0 |
| 1.835 | 0 |
| 1.836 | 0 |
| 1.837 | 0 |
| 1.838 | 0 |
| 1.839 | 0 |
| 1.84 | 0 |
| 1.841 | 0 |
| 1.842 | 0 |
| 1.843 | 0 |
| 1.844 | 0 |
| 1.845 | 0 |
| 1.846 | 0 |
| 1.847 | 0 |
| 1.848 | 0 |
| 1.849 | 0 |
| 1.85 | 0 |
| 1.851 | 0 |
| 1.852 | 0 |
| 1.853 | 0 |
| 1.854 | 0 |
| 1.855 | 0 |
| 1.856 | 0 |
| 1.857 | 0 |
| 1.858 | 0 |
| 1.859 | 0 |
| 1.86 | 0 |
| 1.861 | 0 |
| 1.862 | 0 |
| 1.863 | 0 |
| 1.864 | 0 |
| 1.865 | 0 |
| 1.866 | 0 |
| 1.867 | 0 |
| 1.868 | 0 |
| 1.869 | 0 |
| 1.87 | 0 |
| 1.871 | 0 |
| 1.872 | 0 |
| 1.873 | 0 |
| 1.874 | 0 |
| 1.875 | 0 |
| 1.876 | 0 |
| 1.877 | 0 |
| 1.878 | 0 |
| 1.879 | 0 |
| 1.88 | 0 |
| 1.881 | 0 |
| 1.882 | 0 |
| 1.883 | 0 |
| 1.884 | 0 |
| 1.885 | 0 |
| 1.886 | 0 |
| 1.887 | 0 |
| 1.888 | 0 |
| 1.889 | 0 |
| 1.89 | 0 |
| 1.891 | 0 |
| 1.892 | 0 |
| 1.893 | 0 |
| 1.894 | 0 |
| 1.895 | 0 |
| 1.896 | 0 |
| 1.897 | 0 |
| 1.898 | 0 |
| 1.899 | 0 |
| 1.9 | 0 |
| 1.901 | 0 |
| 1.902 | 0 |
| 1.903 | 0 |
| 1.904 | 0 |
| 1.905 | 0 |
| 1.906 | 0 |
| 1.907 | 0 |
| 1.908 | 0 |
| 1.909 | 0 |
| 1.91 | 0 |
| 1.911 | 0 |
| 1.912 | 0 |
| 1.913 | 0 |
| 1.914 | 0 |
| 1.915 | 0 |
| 1.916 | 0 |
| 1.917 | 0 |
| 1.918 | 0 |
| 1.919 | 0 |
| 1.92 | 0 |
| 1.921 | 0 |
| 1.922 | 0 |
| 1.923 | 0 |
| 1.924 | 0 |
| 1.925 | 0 |
| 1.926 | 0 |
| 1.927 | 0 |
| 1.928 | 0 |
| 1.929 | 0 |
| 1.93 | 0 |
| 1.931 | 0 |
| 1.932 | 0 |
| 1.933 | 0 |
| 1.934 | 0 |
| 1.935 | 0 |
| 1.936 | 0 |
| 1.937 | 0 |
| 1.938 | 0 |
| 1.939 | 0 |
| 1.94 | 0 |
| 1.941 | 0 |
| 1.942 | 0 |
| 1.943 | 0 |
| 1.944 | 0 |
| 1.945 | 0 |
| 1.946 | 0 |
| 1.947 | 0 |
| 1.948 | 0 |
| 1.949 | 0 |
| 1.95 | 0 |
| 1.951 | 0 |
| 1.952 | 0 |
| 1.953 | 0 |
| 1.954 | 0 |
| 1.955 | 0 |
| 1.956 | 0 |
| 1.957 | 0 |
| 1.958 | 0 |
| 1.959 | 0 |
| 1.96 | 0 |
| 1.961 | 0 |
| 1.962 | 0 |
| 1.963 | 0 |
| 1.964 | 0 |
| 1.965 | 0 |
| 1.966 | 0 |
| 1.967 | 0 |
| 1.968 | 0 |
| 1.969 | 0 |
| 1.97 | 0 |
| 1.971 | 0 |
| 1.972 | 0 |
| 1.973 | 0 |
| 1.974 | 0 |
| 1.975 | 0 |
| 1.976 | 0 |
| 1.977 | 0 |
| 1.978 | 0 |
| 1.979 | 0 |
| 1.98 | 0 |
| 1.981 | 0 |
| 1.982 | 0 |
| 1.983 | 0 |
| 1.984 | 0 |
| 1.985 | 0 |
| 1.986 | 0 |
| 1.987 | 0 |
| 1.988 | 0 |
| 1.989 | 0 |
| 1.99 | 0 |
| 1.991 | 0 |
| 1.992 | 0 |
| 1.993 | 0 |
| 1.994 | 0 |
| 1.995 | 0 |
| 1.996 | 0 |
| 1.997 | 0 |
| 1.998 | 0 |
| 1.999 | 0 |
| 2.0 | 0 |
| 2.001 | 0 |
| 2.002 | 0 |
| 2.003 | 0 |
| 2.004 | 0 |
| 2.005 | 0 |
| 2.006 | 0 |
| 2.007 | 0 |
| 2.008 | 0 |
| 2.009 | 0 |
| 2.01 | 0 |
| 2.011 | 0 |
| 2.012 | 0 |
| 2.013 | 0 |
| 2.014 | 0 |
| 2.015 | 0 |
| 2.016 | 0 |
| 2.017 | 0 |
| 2.018 | 0 |
| 2.019 | 0 |
| 2.02 | 0 |
| 2.021 | 0 |
| 2.022 | 0 |
| 2.023 | 0 |
| 2.024 | 0 |
| 2.025 | 0 |
| 2.026 | 0 |
| 2.027 | 0 |
| 2.028 | 0 |
| 2.029 | 0 |
| 2.03 | 0 |
| 2.031 | 0 |
| 2.032 | 0 |
| 2.033 | 0 |
| 2.034 | 0 |
| 2.035 | 0 |
| 2.036 | 0 |
| 2.037 | 0 |
| 2.038 | 0 |
| 2.039 | 0 |
| 2.04 | 0 |
| 2.041 | 0 |
| 2.042 | 0 |
| 2.043 | 0 |
| 2.044 | 0 |
| 2.045 | 0 |
| 2.046 | 0 |
| 2.047 | 0 |
| 2.048 | 0 |
| 2.049 | 0 |
| 2.05 | 0 |
| 2.051 | 0 |
| 2.052 | 0 |
| 2.053 | 0 |
| 2.054 | 0 |
| 2.055 | 0 |
| 2.056 | 0 |
| 2.057 | 0 |
| 2.058 | 0 |
| 2.059 | 0 |
| 2.06 | 0 |
| 2.061 | 0 |
| 2.062 | 0 |
| 2.063 | 0 |
| 2.064 | 0 |
| 2.065 | 0 |
| 2.066 | 0 |
| 2.067 | 0 |
| 2.068 | 0 |
| 2.069 | 0 |
| 2.07 | 0 |
| 2.071 | 0 |
| 2.072 | 0 |
| 2.073 | 0 |
| 2.074 | 0 |
| 2.075 | 0 |
| 2.076 | 0 |
| 2.077 | 0 |
| 2.078 | 0 |
| 2.079 | 0 |
| 2.08 | 0 |
| 2.081 | 0 |
| 2.082 | 0 |
| 2.083 | 0 |
| 2.084 | 0 |
| 2.085 | 0 |
| 2.086 | 0 |
| 2.087 | 0 |
| 2.088 | 0 |
| 2.089 | 0 |
| 2.09 | 0 |
| 2.091 | 0 |
| 2.092 | 0 |
| 2.093 | 0 |
| 2.094 | 0 |
| 2.095 | 0 |
| 2.096 | 0 |
| 2.097 | 0 |
| 2.098 | 0 |
| 2.099 | 0 |
| 2.1 | 0 |
| 2.101 | 0 |
| 2.102 | 0 |
| 2.103 | 0 |
| 2.104 | 0 |
| 2.105 | 0 |
| 2.106 | 0 |
| 2.107 | 0 |
| 2.108 | 0 |
| 2.109 | 0 |
| 2.11 | 0 |
| 2.111 | 0 |
| 2.112 | 0 |
| 2.113 | 0 |
| 2.114 | 0 |
| 2.115 | 0 |
| 2.116 | 0 |
| 2.117 | 0 |
| 2.118 | 0 |
| 2.119 | 0 |
| 2.12 | 0 |
| 2.121 | 0 |
| 2.122 | 0 |
| 2.123 | 0 |
| 2.124 | 0 |
| 2.125 | 0 |
| 2.126 | 0 |
| 2.127 | 0 |
| 2.128 | 0 |
| 2.129 | 0 |
| 2.13 | 0 |
| 2.131 | 0 |
| 2.132 | 0 |
| 2.133 | 0 |
| 2.134 | 0 |
| 2.135 | 0 |
| 2.136 | 0 |
| 2.137 | 0 |
| 2.138 | 0 |
| 2.139 | 0 |
| 2.14 | 0 |
| 2.141 | 0 |
| 2.142 | 0 |
| 2.143 | 0 |
| 2.144 | 0 |
| 2.145 | 0 |
| 2.146 | 0 |
| 2.147 | 0 |
| 2.148 | 0 |
| 2.149 | 0 |
| 2.15 | 0 |
| 2.151 | 0 |
| 2.152 | 0 |
| 2.153 | 0 |
| 2.154 | 0 |
| 2.155 | 0 |
| 2.156 | 0 |
| 2.157 | 0 |
| 2.158 | 0 |
| 2.159 | 0 |
| 2.16 | 0 |
| 2.161 | 0 |
| 2.162 | 0 |
| 2.163 | 0 |
| 2.164 | 0 |
| 2.165 | 0 |
| 2.166 | 0 |
| 2.167 | 0 |
| 2.168 | 0 |
| 2.169 | 0 |
| 2.17 | 0 |
| 2.171 | 0 |
| 2.172 | 0 |
| 2.173 | 0 |
| 2.174 | 0 |
| 2.175 | 0 |
| 2.176 | 0 |
| 2.177 | 0 |
| 2.178 | 0 |
| 2.179 | 0 |
| 2.18 | 0 |
| 2.181 | 0 |
| 2.182 | 0 |
| 2.183 | 0 |
| 2.184 | 0 |
| 2.185 | 0 |
| 2.186 | 0 |
| 2.187 | 0 |
| 2.188 | 0 |
| 2.189 | 0 |
| 2.19 | 0 |
| 2.191 | 0 |
| 2.192 | 0 |
| 2.193 | 0 |
| 2.194 | 0 |
| 2.195 | 0 |
| 2.196 | 0 |
| 2.197 | 0 |
| 2.198 | 0 |
| 2.199 | 0 |
| 2.2 | 0 |
| 2.201 | 0 |
| 2.202 | 0 |
| 2.203 | 0 |
| 2.204 | 0 |
| 2.205 | 0 |
| 2.206 | 0 |
| 2.207 | 0 |
| 2.208 | 0 |
| 2.209 | 0 |
| 2.21 | 0 |
| 2.211 | 0 |
| 2.212 | 0 |
| 2.213 | 0 |
| 2.214 | 0 |
| 2.215 | 0 |
| 2.216 | 0 |
| 2.217 | 0 |
| 2.218 | 0 |
| 2.219 | 0 |
| 2.22 | 0 |
| 2.221 | 0 |
| 2.222 | 0 |
| 2.223 | 0 |
| 2.224 | 0 |
| 2.225 | 0 |
| 2.226 | 0 |
| 2.227 | 0 |
| 2.228 | 0 |
| 2.229 | 0 |
| 2.23 | 0 |
| 2.231 | 0 |
| 2.232 | 0 |
| 2.233 | 0 |
| 2.234 | 0 |
| 2.235 | 0 |
| 2.236 | 0 |
| 2.237 | 0 |
| 2.238 | 0 |
| 2.239 | 0 |
| 2.24 | 0 |
| 2.241 | 0 |
| 2.242 | 0 |
| 2.243 | 0 |
| 2.244 | 0 |
| 2.245 | 0 |
| 2.246 | 0 |
| 2.247 | 0 |
| 2.248 | 0 |
| 2.249 | 0 |
| 2.25 | 0 |
| 2.251 | 0 |
| 2.252 | 0 |
| 2.253 | 0 |
| 2.254 | 0 |
| 2.255 | 0 |
| 2.256 | 0 |
| 2.257 | 0 |
| 2.258 | 0 |
| 2.259 | 0 |
| 2.26 | 0 |
| 2.261 | 0 |
| 2.262 | 0 |
| 2.263 | 0 |
| 2.264 | 0 |
| 2.265 | 0.001 |
| 2.266 | 0.001 |
| 2.267 | 0.001 |
| 2.268 | 0.001 |
| 2.269 | 0.001 |
| 2.27 | 0.001 |
| 2.271 | 0.001 |
| 2.272 | 0.001 |
| 2.273 | 0.001 |
| 2.274 | 0.001 |
| 2.275 | 0.001 |
| 2.276 | 0.001 |
| 2.277 | 0.001 |
| 2.278 | 0.001 |
| 2.279 | 0.001 |
| 2.28 | 0.001 |
| 2.281 | 0.001 |
| 2.282 | 0.001 |
| 2.283 | 0.001 |
| 2.284 | 0.001 |
| 2.285 | 0.001 |
| 2.286 | 0.001 |
| 2.287 | 0.001 |
| 2.288 | 0.001 |
| 2.289 | 0.001 |
| 2.29 | 0.001 |
| 2.291 | 0.001 |
| 2.292 | 0.001 |
| 2.293 | 0.001 |
| 2.294 | 0.001 |
| 2.295 | 0.001 |
| 2.296 | 0.001 |
| 2.297 | 0.001 |
| 2.298 | 0.001 |
| 2.299 | 0.001 |
| 2.3 | 0.001 |
| 2.301 | 0.001 |
| 2.302 | 0.001 |
| 2.303 | 0.001 |
| 2.304 | 0.001 |
| 2.305 | 0.001 |
| 2.306 | 0.001 |
| 2.307 | 0.001 |
| 2.308 | 0.001 |
| 2.309 | 0.001 |
| 2.31 | 0.001 |
| 2.311 | 0.001 |
| 2.312 | 0.001 |
| 2.313 | 0.001 |
| 2.314 | 0.001 |
| 2.315 | 0.001 |
| 2.316 | 0.001 |
| 2.317 | 0.001 |
| 2.318 | 0.001 |
| 2.319 | 0.001 |
| 2.32 | 0.001 |
| 2.321 | 0.001 |
| 2.322 | 0.001 |
| 2.323 | 0.001 |
| 2.324 | 0.001 |
| 2.325 | 0.001 |
| 2.326 | 0.001 |
| 2.327 | 0.001 |
| 2.328 | 0.001 |
| 2.329 | 0.001 |
| 2.33 | 0.001 |
| 2.331 | 0.001 |
| 2.332 | 0.001 |
| 2.333 | 0.001 |
| 2.334 | 0.001 |
| 2.335 | 0.001 |
| 2.336 | 0.001 |
| 2.337 | 0.001 |
| 2.338 | 0.001 |
| 2.339 | 0.001 |
| 2.34 | 0.001 |
| 2.341 | 0.001 |
| 2.342 | 0.001 |
| 2.343 | 0.001 |
| 2.344 | 0.002 |
| 2.345 | 0.002 |
| 2.346 | 0.002 |
| 2.347 | 0.002 |
| 2.348 | 0.002 |
| 2.349 | 0.002 |
| 2.35 | 0.002 |
| 2.351 | 0.002 |
| 2.352 | 0.002 |
| 2.353 | 0.002 |
| 2.354 | 0.002 |
| 2.355 | 0.002 |
| 2.356 | 0.002 |
| 2.357 | 0.002 |
| 2.358 | 0.002 |
| 2.359 | 0.002 |
| 2.36 | 0.002 |
| 2.361 | 0.002 |
| 2.362 | 0.002 |
| 2.363 | 0.002 |
| 2.364 | 0.002 |
| 2.365 | 0.002 |
| 2.366 | 0.002 |
| 2.367 | 0.002 |
| 2.368 | 0.002 |
| 2.369 | 0.002 |
| 2.37 | 0.002 |
| 2.371 | 0.002 |
| 2.372 | 0.002 |
| 2.373 | 0.002 |
| 2.374 | 0.002 |
| 2.375 | 0.002 |
| 2.376 | 0.002 |
| 2.377 | 0.002 |
| 2.378 | 0.002 |
| 2.379 | 0.002 |
| 2.38 | 0.002 |
| 2.381 | 0.002 |
| 2.382 | 0.002 |
| 2.383 | 0.002 |
| 2.384 | 0.002 |
| 2.385 | 0.003 |
| 2.386 | 0.003 |
| 2.387 | 0.003 |
| 2.388 | 0.003 |
| 2.389 | 0.003 |
| 2.39 | 0.003 |
| 2.391 | 0.003 |
| 2.392 | 0.003 |
| 2.393 | 0.003 |
| 2.394 | 0.003 |
| 2.395 | 0.003 |
| 2.396 | 0.003 |
| 2.397 | 0.003 |
| 2.398 | 0.003 |
| 2.399 | 0.003 |
| 2.4 | 0.003 |
| 2.401 | 0.003 |
| 2.402 | 0.003 |
| 2.403 | 0.003 |
| 2.404 | 0.003 |
| 2.405 | 0.003 |
| 2.406 | 0.003 |
| 2.407 | 0.003 |
| 2.408 | 0.003 |
| 2.409 | 0.003 |
| 2.41 | 0.003 |
| 2.411 | 0.003 |
| 2.412 | 0.004 |
| 2.413 | 0.004 |
| 2.414 | 0.004 |
| 2.415 | 0.004 |
| 2.416 | 0.004 |
| 2.417 | 0.004 |
| 2.418 | 0.004 |
| 2.419 | 0.004 |
| 2.42 | 0.004 |
| 2.421 | 0.004 |
| 2.422 | 0.004 |
| 2.423 | 0.004 |
| 2.424 | 0.004 |
| 2.425 | 0.004 |
| 2.426 | 0.004 |
| 2.427 | 0.004 |
| 2.428 | 0.004 |
| 2.429 | 0.004 |
| 2.43 | 0.004 |
| 2.431 | 0.004 |
| 2.432 | 0.004 |
| 2.433 | 0.004 |
| 2.434 | 0.005 |
| 2.435 | 0.005 |
| 2.436 | 0.005 |
| 2.437 | 0.005 |
| 2.438 | 0.005 |
| 2.439 | 0.005 |
| 2.44 | 0.005 |
| 2.441 | 0.005 |
| 2.442 | 0.005 |
| 2.443 | 0.005 |
| 2.444 | 0.005 |
| 2.445 | 0.005 |
| 2.446 | 0.005 |
| 2.447 | 0.005 |
| 2.448 | 0.005 |
| 2.449 | 0.005 |
| 2.45 | 0.005 |
| 2.451 | 0.005 |
| 2.452 | 0.006 |
| 2.453 | 0.006 |
| 2.454 | 0.006 |
| 2.455 | 0.006 |
| 2.456 | 0.006 |
| 2.457 | 0.006 |
| 2.458 | 0.006 |
| 2.459 | 0.006 |
| 2.46 | 0.006 |
| 2.461 | 0.006 |
| 2.462 | 0.006 |
| 2.463 | 0.006 |
| 2.464 | 0.006 |
| 2.465 | 0.006 |
| 2.466 | 0.006 |
| 2.467 | 0.006 |
| 2.468 | 0.007 |
| 2.469 | 0.007 |
| 2.47 | 0.007 |
| 2.471 | 0.007 |
| 2.472 | 0.007 |
| 2.473 | 0.007 |
| 2.474 | 0.007 |
| 2.475 | 0.007 |
| 2.476 | 0.007 |
| 2.477 | 0.007 |
| 2.478 | 0.007 |
| 2.479 | 0.007 |
| 2.48 | 0.007 |
| 2.481 | 0.008 |
| 2.482 | 0.008 |
| 2.483 | 0.008 |
| 2.484 | 0.008 |
| 2.485 | 0.008 |
| 2.486 | 0.008 |
| 2.487 | 0.008 |
| 2.488 | 0.008 |
| 2.489 | 0.008 |
| 2.49 | 0.008 |
| 2.491 | 0.008 |
| 2.492 | 0.008 |
| 2.493 | 0.008 |
| 2.494 | 0.009 |
| 2.495 | 0.009 |
| 2.496 | 0.009 |
| 2.497 | 0.009 |
| 2.498 | 0.009 |
| 2.499 | 0.009 |
| 2.5 | 0.009 |
| 2.501 | 0.009 |
| 2.502 | 0.009 |
| 2.503 | 0.009 |
| 2.504 | 0.009 |
| 2.505 | 0.01 |
| 2.506 | 0.01 |
| 2.507 | 0.01 |
| 2.508 | 0.01 |
| 2.509 | 0.01 |
| 2.51 | 0.01 |
| 2.511 | 0.01 |
| 2.512 | 0.01 |
| 2.513 | 0.01 |
| 2.514 | 0.01 |
| 2.515 | 0.011 |
| 2.516 | 0.011 |
| 2.517 | 0.011 |
| 2.518 | 0.011 |
| 2.519 | 0.011 |
| 2.52 | 0.011 |
| 2.521 | 0.011 |
| 2.522 | 0.011 |
| 2.523 | 0.011 |
| 2.524 | 0.012 |
| 2.525 | 0.012 |
| 2.526 | 0.012 |
| 2.527 | 0.012 |
| 2.528 | 0.012 |
| 2.529 | 0.012 |
| 2.53 | 0.012 |
| 2.531 | 0.012 |
| 2.532 | 0.012 |
| 2.533 | 0.013 |
| 2.534 | 0.013 |
| 2.535 | 0.013 |
| 2.536 | 0.013 |
| 2.537 | 0.013 |
| 2.538 | 0.013 |
| 2.539 | 0.013 |
| 2.54 | 0.013 |
| 2.541 | 0.014 |
| 2.542 | 0.014 |
| 2.543 | 0.014 |
| 2.544 | 0.014 |
| 2.545 | 0.014 |
| 2.546 | 0.014 |
| 2.547 | 0.014 |
| 2.548 | 0.014 |
| 2.549 | 0.015 |
| 2.55 | 0.015 |
| 2.551 | 0.015 |
| 2.552 | 0.015 |
| 2.553 | 0.015 |
| 2.554 | 0.015 |
| 2.555 | 0.015 |
| 2.556 | 0.015 |
| 2.557 | 0.016 |
| 2.558 | 0.016 |
| 2.559 | 0.016 |
| 2.56 | 0.016 |
| 2.561 | 0.016 |
| 2.562 | 0.016 |
| 2.563 | 0.016 |
| 2.564 | 0.017 |
| 2.565 | 0.017 |
| 2.566 | 0.017 |
| 2.567 | 0.017 |
| 2.568 | 0.017 |
| 2.569 | 0.017 |
| 2.57 | 0.017 |
| 2.571 | 0.018 |
| 2.572 | 0.018 |
| 2.573 | 0.018 |
| 2.574 | 0.018 |
| 2.575 | 0.018 |
| 2.576 | 0.018 |
| 2.577 | 0.019 |
| 2.578 | 0.019 |
| 2.579 | 0.019 |
| 2.58 | 0.019 |
| 2.581 | 0.019 |
| 2.582 | 0.019 |
| 2.583 | 0.02 |
| 2.584 | 0.02 |
| 2.585 | 0.02 |
| 2.586 | 0.02 |
| 2.587 | 0.02 |
| 2.588 | 0.02 |
| 2.589 | 0.021 |
| 2.59 | 0.021 |
| 2.591 | 0.021 |
| 2.592 | 0.021 |
| 2.593 | 0.021 |
| 2.594 | 0.021 |
| 2.595 | 0.022 |
| 2.596 | 0.022 |
| 2.597 | 0.022 |
| 2.598 | 0.022 |
| 2.599 | 0.022 |
| 2.6 | 0.022 |
| 2.601 | 0.023 |
| 2.602 | 0.023 |
| 2.603 | 0.023 |
| 2.604 | 0.023 |
| 2.605 | 0.023 |
| 2.606 | 0.024 |
| 2.607 | 0.024 |
| 2.608 | 0.024 |
| 2.609 | 0.024 |
| 2.61 | 0.024 |
| 2.611 | 0.024 |
| 2.612 | 0.025 |
| 2.613 | 0.025 |
| 2.614 | 0.025 |
| 2.615 | 0.025 |
| 2.616 | 0.025 |
| 2.617 | 0.026 |
| 2.618 | 0.026 |
| 2.619 | 0.026 |
| 2.62 | 0.026 |
| 2.621 | 0.026 |
| 2.622 | 0.027 |
| 2.623 | 0.027 |
| 2.624 | 0.027 |
| 2.625 | 0.027 |
| 2.626 | 0.027 |
| 2.627 | 0.028 |
| 2.628 | 0.028 |
| 2.629 | 0.028 |
| 2.63 | 0.028 |
| 2.631 | 0.028 |
| 2.632 | 0.029 |
| 2.633 | 0.029 |
| 2.634 | 0.029 |
| 2.635 | 0.029 |
| 2.636 | 0.03 |
| 2.637 | 0.03 |
| 2.638 | 0.03 |
| 2.639 | 0.03 |
| 2.64 | 0.03 |
| 2.641 | 0.031 |
| 2.642 | 0.031 |
| 2.643 | 0.031 |
| 2.644 | 0.031 |
| 2.645 | 0.032 |
| 2.646 | 0.032 |
| 2.647 | 0.032 |
| 2.648 | 0.032 |
| 2.649 | 0.032 |
| 2.65 | 0.033 |
| 2.651 | 0.033 |
| 2.652 | 0.033 |
| 2.653 | 0.033 |
| 2.654 | 0.034 |
| 2.655 | 0.034 |
| 2.656 | 0.034 |
| 2.657 | 0.034 |
| 2.658 | 0.034 |
| 2.659 | 0.035 |
| 2.66 | 0.035 |
| 2.661 | 0.035 |
| 2.662 | 0.035 |
| 2.663 | 0.036 |
| 2.664 | 0.036 |
| 2.665 | 0.036 |
| 2.666 | 0.036 |
| 2.667 | 0.037 |
| 2.668 | 0.037 |
| 2.669 | 0.037 |
| 2.67 | 0.037 |
| 2.671 | 0.038 |
| 2.672 | 0.038 |
| 2.673 | 0.038 |
| 2.674 | 0.038 |
| 2.675 | 0.039 |
| 2.676 | 0.039 |
| 2.677 | 0.039 |
| 2.678 | 0.039 |
| 2.679 | 0.04 |
| 2.68 | 0.04 |
| 2.681 | 0.04 |
| 2.682 | 0.04 |
| 2.683 | 0.041 |
| 2.684 | 0.041 |
| 2.685 | 0.041 |
| 2.686 | 0.041 |
| 2.687 | 0.042 |
| 2.688 | 0.042 |
| 2.689 | 0.042 |
| 2.69 | 0.043 |
| 2.691 | 0.043 |
| 2.692 | 0.043 |
| 2.693 | 0.043 |
| 2.694 | 0.044 |
| 2.695 | 0.044 |
| 2.696 | 0.044 |
| 2.697 | 0.044 |
| 2.698 | 0.045 |
| 2.699 | 0.045 |
| 2.7 | 0.045 |
| 2.701 | 0.045 |
| 2.702 | 0.046 |
| 2.703 | 0.046 |
| 2.704 | 0.046 |
| 2.705 | 0.047 |
| 2.706 | 0.047 |
| 2.707 | 0.047 |
| 2.708 | 0.047 |
| 2.709 | 0.048 |
| 2.71 | 0.048 |
| 2.711 | 0.048 |
| 2.712 | 0.048 |
| 2.713 | 0.049 |
| 2.714 | 0.049 |
| 2.715 | 0.049 |
| 2.716 | 0.05 |
| 2.717 | 0.05 |
| 2.718 | 0.05 |
| 2.719 | 0.05 |
| 2.72 | 0.051 |
| 2.721 | 0.051 |
| 2.722 | 0.051 |
| 2.723 | 0.052 |
| 2.724 | 0.052 |
| 2.725 | 0.052 |
| 2.726 | 0.052 |
| 2.727 | 0.053 |
| 2.728 | 0.053 |
| 2.729 | 0.053 |
| 2.73 | 0.054 |
| 2.731 | 0.054 |
| 2.732 | 0.054 |
| 2.733 | 0.054 |
| 2.734 | 0.055 |
| 2.735 | 0.055 |
| 2.736 | 0.055 |
| 2.737 | 0.056 |
| 2.738 | 0.056 |
| 2.739 | 0.056 |
| 2.74 | 0.057 |
| 2.741 | 0.057 |
| 2.742 | 0.057 |
| 2.743 | 0.057 |
| 2.744 | 0.058 |
| 2.745 | 0.058 |
| 2.746 | 0.058 |
| 2.747 | 0.059 |
| 2.748 | 0.059 |
| 2.749 | 0.059 |
| 2.75 | 0.059 |
| 2.751 | 0.06 |
| 2.752 | 0.06 |
| 2.753 | 0.06 |
| 2.754 | 0.061 |
| 2.755 | 0.061 |
| 2.756 | 0.061 |
| 2.757 | 0.062 |
| 2.758 | 0.062 |
| 2.759 | 0.062 |
| 2.76 | 0.062 |
| 2.761 | 0.063 |
| 2.762 | 0.063 |
| 2.763 | 0.063 |
| 2.764 | 0.064 |
| 2.765 | 0.064 |
| 2.766 | 0.064 |
| 2.767 | 0.065 |
| 2.768 | 0.065 |
| 2.769 | 0.065 |
| 2.77 | 0.065 |
| 2.771 | 0.066 |
| 2.772 | 0.066 |
| 2.773 | 0.066 |
| 2.774 | 0.067 |
| 2.775 | 0.067 |
| 2.776 | 0.067 |
| 2.777 | 0.068 |
| 2.778 | 0.068 |
| 2.779 | 0.068 |
| 2.78 | 0.068 |
| 2.781 | 0.069 |
| 2.782 | 0.069 |
| 2.783 | 0.069 |
| 2.784 | 0.07 |
| 2.785 | 0.07 |
| 2.786 | 0.07 |
| 2.787 | 0.071 |
| 2.788 | 0.071 |
| 2.789 | 0.071 |
| 2.79 | 0.071 |
| 2.791 | 0.072 |
| 2.792 | 0.072 |
| 2.793 | 0.072 |
| 2.794 | 0.073 |
| 2.795 | 0.073 |
| 2.796 | 0.073 |
| 2.797 | 0.074 |
| 2.798 | 0.074 |
| 2.799 | 0.074 |
| 2.8 | 0.074 |
| 2.801 | 0.075 |
| 2.802 | 0.075 |
| 2.803 | 0.075 |
| 2.804 | 0.076 |
| 2.805 | 0.076 |
| 2.806 | 0.076 |
| 2.807 | 0.077 |
| 2.808 | 0.077 |
| 2.809 | 0.077 |
| 2.81 | 0.077 |
| 2.811 | 0.078 |
| 2.812 | 0.078 |
| 2.813 | 0.078 |
| 2.814 | 0.079 |
| 2.815 | 0.079 |
| 2.816 | 0.079 |
| 2.817 | 0.079 |
| 2.818 | 0.08 |
| 2.819 | 0.08 |
| 2.82 | 0.08 |
| 2.821 | 0.081 |
| 2.822 | 0.081 |
| 2.823 | 0.081 |
| 2.824 | 0.082 |
| 2.825 | 0.082 |
| 2.826 | 0.082 |
| 2.827 | 0.082 |
| 2.828 | 0.083 |
| 2.829 | 0.083 |
| 2.83 | 0.083 |
| 2.831 | 0.084 |
| 2.832 | 0.084 |
| 2.833 | 0.084 |
| 2.834 | 0.084 |
| 2.835 | 0.085 |
| 2.836 | 0.085 |
| 2.837 | 0.085 |
| 2.838 | 0.085 |
| 2.839 | 0.086 |
| 2.84 | 0.086 |
| 2.841 | 0.086 |
| 2.842 | 0.087 |
| 2.843 | 0.087 |
| 2.844 | 0.087 |
| 2.845 | 0.087 |
| 2.846 | 0.088 |
| 2.847 | 0.088 |
| 2.848 | 0.088 |
| 2.849 | 0.088 |
| 2.85 | 0.089 |
| 2.851 | 0.089 |
| 2.852 | 0.089 |
| 2.853 | 0.09 |
| 2.854 | 0.09 |
| 2.855 | 0.09 |
| 2.856 | 0.09 |
| 2.857 | 0.091 |
| 2.858 | 0.091 |
| 2.859 | 0.091 |
| 2.86 | 0.091 |
| 2.861 | 0.092 |
| 2.862 | 0.092 |
| 2.863 | 0.092 |
| 2.864 | 0.092 |
| 2.865 | 0.093 |
| 2.866 | 0.093 |
| 2.867 | 0.093 |
| 2.868 | 0.093 |
| 2.869 | 0.094 |
| 2.87 | 0.094 |
| 2.871 | 0.094 |
| 2.872 | 0.094 |
| 2.873 | 0.095 |
| 2.874 | 0.095 |
| 2.875 | 0.095 |
| 2.876 | 0.095 |
| 2.877 | 0.096 |
| 2.878 | 0.096 |
| 2.879 | 0.096 |
| 2.88 | 0.096 |
| 2.881 | 0.096 |
| 2.882 | 0.097 |
| 2.883 | 0.097 |
| 2.884 | 0.097 |
| 2.885 | 0.097 |
| 2.886 | 0.098 |
| 2.887 | 0.098 |
| 2.888 | 0.098 |
| 2.889 | 0.098 |
| 2.89 | 0.098 |
| 2.891 | 0.099 |
| 2.892 | 0.099 |
| 2.893 | 0.099 |
| 2.894 | 0.099 |
| 2.895 | 0.1 |
| 2.896 | 0.1 |
| 2.897 | 0.1 |
| 2.898 | 0.1 |
| 2.899 | 0.1 |
| 2.9 | 0.101 |
| 2.901 | 0.101 |
| 2.902 | 0.101 |
| 2.903 | 0.101 |
| 2.904 | 0.101 |
| 2.905 | 0.102 |
| 2.906 | 0.102 |
| 2.907 | 0.102 |
| 2.908 | 0.102 |
| 2.909 | 0.102 |
| 2.91 | 0.102 |
| 2.911 | 0.103 |
| 2.912 | 0.103 |
| 2.913 | 0.103 |
| 2.914 | 0.103 |
| 2.915 | 0.103 |
| 2.916 | 0.104 |
| 2.917 | 0.104 |
| 2.918 | 0.104 |
| 2.919 | 0.104 |
| 2.92 | 0.104 |
| 2.921 | 0.104 |
| 2.922 | 0.105 |
| 2.923 | 0.105 |
| 2.924 | 0.105 |
| 2.925 | 0.105 |
| 2.926 | 0.105 |
| 2.927 | 0.105 |
| 2.928 | 0.105 |
| 2.929 | 0.106 |
| 2.93 | 0.106 |
| 2.931 | 0.106 |
| 2.932 | 0.106 |
| 2.933 | 0.106 |
| 2.934 | 0.106 |
| 2.935 | 0.107 |
| 2.936 | 0.107 |
| 2.937 | 0.107 |
| 2.938 | 0.107 |
| 2.939 | 0.107 |
| 2.94 | 0.107 |
| 2.941 | 0.107 |
| 2.942 | 0.107 |
| 2.943 | 0.108 |
| 2.944 | 0.108 |
| 2.945 | 0.108 |
| 2.946 | 0.108 |
| 2.947 | 0.108 |
| 2.948 | 0.108 |
| 2.949 | 0.108 |
| 2.95 | 0.108 |
| 2.951 | 0.108 |
| 2.952 | 0.109 |
| 2.953 | 0.109 |
| 2.954 | 0.109 |
| 2.955 | 0.109 |
| 2.956 | 0.109 |
| 2.957 | 0.109 |
| 2.958 | 0.109 |
| 2.959 | 0.109 |
| 2.96 | 0.109 |
| 2.961 | 0.109 |
| 2.962 | 0.11 |
| 2.963 | 0.11 |
| 2.964 | 0.11 |
| 2.965 | 0.11 |
| 2.966 | 0.11 |
| 2.967 | 0.11 |
| 2.968 | 0.11 |
| 2.969 | 0.11 |
| 2.97 | 0.11 |
| 2.971 | 0.11 |
| 2.972 | 0.11 |
| 2.973 | 0.11 |
| 2.974 | 0.11 |
| 2.975 | 0.11 |
| 2.976 | 0.11 |
| 2.977 | 0.111 |
| 2.978 | 0.111 |
| 2.979 | 0.111 |
| 2.98 | 0.111 |
| 2.981 | 0.111 |
| 2.982 | 0.111 |
| 2.983 | 0.111 |
| 2.984 | 0.111 |
| 2.985 | 0.111 |
| 2.986 | 0.111 |
| 2.987 | 0.111 |
| 2.988 | 0.111 |
| 2.989 | 0.111 |
| 2.99 | 0.111 |
| 2.991 | 0.111 |
| 2.992 | 0.111 |
| 2.993 | 0.111 |
| 2.994 | 0.111 |
| 2.995 | 0.111 |
| 2.996 | 0.111 |
| 2.997 | 0.111 |
| 2.998 | 0.111 |
| 2.999 | 0.111 |
| 3.0 | 0.111 |
| 3.001 | 0.111 |
| 3.002 | 0.111 |
| 3.003 | 0.111 |
| 3.004 | 0.111 |
| 3.005 | 0.111 |
| 3.006 | 0.111 |
| 3.007 | 0.111 |
| 3.008 | 0.111 |
| 3.009 | 0.111 |
| 3.01 | 0.111 |
| 3.011 | 0.111 |
| 3.012 | 0.111 |
| 3.013 | 0.111 |
| 3.014 | 0.111 |
| 3.015 | 0.111 |
| 3.016 | 0.111 |
| 3.017 | 0.111 |
| 3.018 | 0.111 |
| 3.019 | 0.111 |
| 3.02 | 0.111 |
| 3.021 | 0.111 |
| 3.022 | 0.111 |
| 3.023 | 0.111 |
| 3.024 | 0.11 |
| 3.025 | 0.11 |
| 3.026 | 0.11 |
| 3.027 | 0.11 |
| 3.028 | 0.11 |
| 3.029 | 0.11 |
| 3.03 | 0.11 |
| 3.031 | 0.11 |
| 3.032 | 0.11 |
| 3.033 | 0.11 |
| 3.034 | 0.11 |
| 3.035 | 0.11 |
| 3.036 | 0.11 |
| 3.037 | 0.11 |
| 3.038 | 0.11 |
| 3.039 | 0.109 |
| 3.04 | 0.109 |
| 3.041 | 0.109 |
| 3.042 | 0.109 |
| 3.043 | 0.109 |
| 3.044 | 0.109 |
| 3.045 | 0.109 |
| 3.046 | 0.109 |
| 3.047 | 0.109 |
| 3.048 | 0.109 |
| 3.049 | 0.108 |
| 3.05 | 0.108 |
| 3.051 | 0.108 |
| 3.052 | 0.108 |
| 3.053 | 0.108 |
| 3.054 | 0.108 |
| 3.055 | 0.108 |
| 3.056 | 0.108 |
| 3.057 | 0.108 |
| 3.058 | 0.107 |
| 3.059 | 0.107 |
| 3.06 | 0.107 |
| 3.061 | 0.107 |
| 3.062 | 0.107 |
| 3.063 | 0.107 |
| 3.064 | 0.107 |
| 3.065 | 0.107 |
| 3.066 | 0.106 |
| 3.067 | 0.106 |
| 3.068 | 0.106 |
| 3.069 | 0.106 |
| 3.07 | 0.106 |
| 3.071 | 0.106 |
| 3.072 | 0.105 |
| 3.073 | 0.105 |
| 3.074 | 0.105 |
| 3.075 | 0.105 |
| 3.076 | 0.105 |
| 3.077 | 0.105 |
| 3.078 | 0.105 |
| 3.079 | 0.104 |
| 3.08 | 0.104 |
| 3.081 | 0.104 |
| 3.082 | 0.104 |
| 3.083 | 0.104 |
| 3.084 | 0.104 |
| 3.085 | 0.103 |
| 3.086 | 0.103 |
| 3.087 | 0.103 |
| 3.088 | 0.103 |
| 3.089 | 0.103 |
| 3.09 | 0.102 |
| 3.091 | 0.102 |
| 3.092 | 0.102 |
| 3.093 | 0.102 |
| 3.094 | 0.102 |
| 3.095 | 0.102 |
| 3.096 | 0.101 |
| 3.097 | 0.101 |
| 3.098 | 0.101 |
| 3.099 | 0.101 |
| 3.1 | 0.101 |
| 3.101 | 0.1 |
| 3.102 | 0.1 |
| 3.103 | 0.1 |
| 3.104 | 0.1 |
| 3.105 | 0.1 |
| 3.106 | 0.099 |
| 3.107 | 0.099 |
| 3.108 | 0.099 |
| 3.109 | 0.099 |
| 3.11 | 0.098 |
| 3.111 | 0.098 |
| 3.112 | 0.098 |
| 3.113 | 0.098 |
| 3.114 | 0.098 |
| 3.115 | 0.097 |
| 3.116 | 0.097 |
| 3.117 | 0.097 |
| 3.118 | 0.097 |
| 3.119 | 0.096 |
| 3.12 | 0.096 |
| 3.121 | 0.096 |
| 3.122 | 0.096 |
| 3.123 | 0.096 |
| 3.124 | 0.095 |
| 3.125 | 0.095 |
| 3.126 | 0.095 |
| 3.127 | 0.095 |
| 3.128 | 0.094 |
| 3.129 | 0.094 |
| 3.13 | 0.094 |
| 3.131 | 0.094 |
| 3.132 | 0.093 |
| 3.133 | 0.093 |
| 3.134 | 0.093 |
| 3.135 | 0.093 |
| 3.136 | 0.092 |
| 3.137 | 0.092 |
| 3.138 | 0.092 |
| 3.139 | 0.092 |
| 3.14 | 0.091 |
| 3.141 | 0.091 |
| 3.142 | 0.091 |
| 3.143 | 0.091 |
| 3.144 | 0.09 |
| 3.145 | 0.09 |
| 3.146 | 0.09 |
| 3.147 | 0.09 |
| 3.148 | 0.089 |
| 3.149 | 0.089 |
| 3.15 | 0.089 |
| 3.151 | 0.088 |
| 3.152 | 0.088 |
| 3.153 | 0.088 |
| 3.154 | 0.088 |
| 3.155 | 0.087 |
| 3.156 | 0.087 |
| 3.157 | 0.087 |
| 3.158 | 0.087 |
| 3.159 | 0.086 |
| 3.16 | 0.086 |
| 3.161 | 0.086 |
| 3.162 | 0.085 |
| 3.163 | 0.085 |
| 3.164 | 0.085 |
| 3.165 | 0.085 |
| 3.166 | 0.084 |
| 3.167 | 0.084 |
| 3.168 | 0.084 |
| 3.169 | 0.084 |
| 3.17 | 0.083 |
| 3.171 | 0.083 |
| 3.172 | 0.083 |
| 3.173 | 0.082 |
| 3.174 | 0.082 |
| 3.175 | 0.082 |
| 3.176 | 0.082 |
| 3.177 | 0.081 |
| 3.178 | 0.081 |
| 3.179 | 0.081 |
| 3.18 | 0.08 |
| 3.181 | 0.08 |
| 3.182 | 0.08 |
| 3.183 | 0.079 |
| 3.184 | 0.079 |
| 3.185 | 0.079 |
| 3.186 | 0.079 |
| 3.187 | 0.078 |
| 3.188 | 0.078 |
| 3.189 | 0.078 |
| 3.19 | 0.077 |
| 3.191 | 0.077 |
| 3.192 | 0.077 |
| 3.193 | 0.077 |
| 3.194 | 0.076 |
| 3.195 | 0.076 |
| 3.196 | 0.076 |
| 3.197 | 0.075 |
| 3.198 | 0.075 |
| 3.199 | 0.075 |
| 3.2 | 0.074 |
| 3.201 | 0.074 |
| 3.202 | 0.074 |
| 3.203 | 0.074 |
| 3.204 | 0.073 |
| 3.205 | 0.073 |
| 3.206 | 0.073 |
| 3.207 | 0.072 |
| 3.208 | 0.072 |
| 3.209 | 0.072 |
| 3.21 | 0.071 |
| 3.211 | 0.071 |
| 3.212 | 0.071 |
| 3.213 | 0.071 |
| 3.214 | 0.07 |
| 3.215 | 0.07 |
| 3.216 | 0.07 |
| 3.217 | 0.069 |
| 3.218 | 0.069 |
| 3.219 | 0.069 |
| 3.22 | 0.068 |
| 3.221 | 0.068 |
| 3.222 | 0.068 |
| 3.223 | 0.068 |
| 3.224 | 0.067 |
| 3.225 | 0.067 |
| 3.226 | 0.067 |
| 3.227 | 0.066 |
| 3.228 | 0.066 |
| 3.229 | 0.066 |
| 3.23 | 0.065 |
| 3.231 | 0.065 |
| 3.232 | 0.065 |
| 3.233 | 0.065 |
| 3.234 | 0.064 |
| 3.235 | 0.064 |
| 3.236 | 0.064 |
| 3.237 | 0.063 |
| 3.238 | 0.063 |
| 3.239 | 0.063 |
| 3.24 | 0.062 |
| 3.241 | 0.062 |
| 3.242 | 0.062 |
| 3.243 | 0.062 |
| 3.244 | 0.061 |
| 3.245 | 0.061 |
| 3.246 | 0.061 |
| 3.247 | 0.06 |
| 3.248 | 0.06 |
| 3.249 | 0.06 |
| 3.25 | 0.059 |
| 3.251 | 0.059 |
| 3.252 | 0.059 |
| 3.253 | 0.059 |
| 3.254 | 0.058 |
| 3.255 | 0.058 |
| 3.256 | 0.058 |
| 3.257 | 0.057 |
| 3.258 | 0.057 |
| 3.259 | 0.057 |
| 3.26 | 0.057 |
| 3.261 | 0.056 |
| 3.262 | 0.056 |
| 3.263 | 0.056 |
| 3.264 | 0.055 |
| 3.265 | 0.055 |
| 3.266 | 0.055 |
| 3.267 | 0.054 |
| 3.268 | 0.054 |
| 3.269 | 0.054 |
| 3.27 | 0.054 |
| 3.271 | 0.053 |
| 3.272 | 0.053 |
| 3.273 | 0.053 |
| 3.274 | 0.052 |
| 3.275 | 0.052 |
| 3.276 | 0.052 |
| 3.277 | 0.052 |
| 3.278 | 0.051 |
| 3.279 | 0.051 |
| 3.28 | 0.051 |
| 3.281 | 0.05 |
| 3.282 | 0.05 |
| 3.283 | 0.05 |
| 3.284 | 0.05 |
| 3.285 | 0.049 |
| 3.286 | 0.049 |
| 3.287 | 0.049 |
| 3.288 | 0.048 |
| 3.289 | 0.048 |
| 3.29 | 0.048 |
| 3.291 | 0.048 |
| 3.292 | 0.047 |
| 3.293 | 0.047 |
| 3.294 | 0.047 |
| 3.295 | 0.047 |
| 3.296 | 0.046 |
| 3.297 | 0.046 |
| 3.298 | 0.046 |
| 3.299 | 0.045 |
| 3.3 | 0.045 |
| 3.301 | 0.045 |
| 3.302 | 0.045 |
| 3.303 | 0.044 |
| 3.304 | 0.044 |
| 3.305 | 0.044 |
| 3.306 | 0.044 |
| 3.307 | 0.043 |
| 3.308 | 0.043 |
| 3.309 | 0.043 |
| 3.31 | 0.043 |
| 3.311 | 0.042 |
| 3.312 | 0.042 |
| 3.313 | 0.042 |
| 3.314 | 0.041 |
| 3.315 | 0.041 |
| 3.316 | 0.041 |
| 3.317 | 0.041 |
| 3.318 | 0.04 |
| 3.319 | 0.04 |
| 3.32 | 0.04 |
| 3.321 | 0.04 |
| 3.322 | 0.039 |
| 3.323 | 0.039 |
| 3.324 | 0.039 |
| 3.325 | 0.039 |
| 3.326 | 0.038 |
| 3.327 | 0.038 |
| 3.328 | 0.038 |
| 3.329 | 0.038 |
| 3.33 | 0.037 |
| 3.331 | 0.037 |
| 3.332 | 0.037 |
| 3.333 | 0.037 |
| 3.334 | 0.036 |
| 3.335 | 0.036 |
| 3.336 | 0.036 |
| 3.337 | 0.036 |
| 3.338 | 0.035 |
| 3.339 | 0.035 |
| 3.34 | 0.035 |
| 3.341 | 0.035 |
| 3.342 | 0.034 |
| 3.343 | 0.034 |
| 3.344 | 0.034 |
| 3.345 | 0.034 |
| 3.346 | 0.034 |
| 3.347 | 0.033 |
| 3.348 | 0.033 |
| 3.349 | 0.033 |
| 3.35 | 0.033 |
| 3.351 | 0.032 |
| 3.352 | 0.032 |
| 3.353 | 0.032 |
| 3.354 | 0.032 |
| 3.355 | 0.032 |
| 3.356 | 0.031 |
| 3.357 | 0.031 |
| 3.358 | 0.031 |
| 3.359 | 0.031 |
| 3.36 | 0.03 |
| 3.361 | 0.03 |
| 3.362 | 0.03 |
| 3.363 | 0.03 |
| 3.364 | 0.03 |
| 3.365 | 0.029 |
| 3.366 | 0.029 |
| 3.367 | 0.029 |
| 3.368 | 0.029 |
| 3.369 | 0.028 |
| 3.37 | 0.028 |
| 3.371 | 0.028 |
| 3.372 | 0.028 |
| 3.373 | 0.028 |
| 3.374 | 0.027 |
| 3.375 | 0.027 |
| 3.376 | 0.027 |
| 3.377 | 0.027 |
| 3.378 | 0.027 |
| 3.379 | 0.026 |
| 3.38 | 0.026 |
| 3.381 | 0.026 |
| 3.382 | 0.026 |
| 3.383 | 0.026 |
| 3.384 | 0.025 |
| 3.385 | 0.025 |
| 3.386 | 0.025 |
| 3.387 | 0.025 |
| 3.388 | 0.025 |
| 3.389 | 0.024 |
| 3.39 | 0.024 |
| 3.391 | 0.024 |
| 3.392 | 0.024 |
| 3.393 | 0.024 |
| 3.394 | 0.024 |
| 3.395 | 0.023 |
| 3.396 | 0.023 |
| 3.397 | 0.023 |
| 3.398 | 0.023 |
| 3.399 | 0.023 |
| 3.4 | 0.022 |
| 3.401 | 0.022 |
| 3.402 | 0.022 |
| 3.403 | 0.022 |
| 3.404 | 0.022 |
| 3.405 | 0.022 |
| 3.406 | 0.021 |
| 3.407 | 0.021 |
| 3.408 | 0.021 |
| 3.409 | 0.021 |
| 3.41 | 0.021 |
| 3.411 | 0.021 |
| 3.412 | 0.02 |
| 3.413 | 0.02 |
| 3.414 | 0.02 |
| 3.415 | 0.02 |
| 3.416 | 0.02 |
| 3.417 | 0.02 |
| 3.418 | 0.019 |
| 3.419 | 0.019 |
| 3.42 | 0.019 |
| 3.421 | 0.019 |
| 3.422 | 0.019 |
| 3.423 | 0.019 |
| 3.424 | 0.018 |
| 3.425 | 0.018 |
| 3.426 | 0.018 |
| 3.427 | 0.018 |
| 3.428 | 0.018 |
| 3.429 | 0.018 |
| 3.43 | 0.017 |
| 3.431 | 0.017 |
| 3.432 | 0.017 |
| 3.433 | 0.017 |
| 3.434 | 0.017 |
| 3.435 | 0.017 |
| 3.436 | 0.017 |
| 3.437 | 0.016 |
| 3.438 | 0.016 |
| 3.439 | 0.016 |
| 3.44 | 0.016 |
| 3.441 | 0.016 |
| 3.442 | 0.016 |
| 3.443 | 0.016 |
| 3.444 | 0.015 |
| 3.445 | 0.015 |
| 3.446 | 0.015 |
| 3.447 | 0.015 |
| 3.448 | 0.015 |
| 3.449 | 0.015 |
| 3.45 | 0.015 |
| 3.451 | 0.015 |
| 3.452 | 0.014 |
| 3.453 | 0.014 |
| 3.454 | 0.014 |
| 3.455 | 0.014 |
| 3.456 | 0.014 |
| 3.457 | 0.014 |
| 3.458 | 0.014 |
| 3.459 | 0.014 |
| 3.46 | 0.013 |
| 3.461 | 0.013 |
| 3.462 | 0.013 |
| 3.463 | 0.013 |
| 3.464 | 0.013 |
| 3.465 | 0.013 |
| 3.466 | 0.013 |
| 3.467 | 0.013 |
| 3.468 | 0.012 |
| 3.469 | 0.012 |
| 3.47 | 0.012 |
| 3.471 | 0.012 |
| 3.472 | 0.012 |
| 3.473 | 0.012 |
| 3.474 | 0.012 |
| 3.475 | 0.012 |
| 3.476 | 0.012 |
| 3.477 | 0.011 |
| 3.478 | 0.011 |
| 3.479 | 0.011 |
| 3.48 | 0.011 |
| 3.481 | 0.011 |
| 3.482 | 0.011 |
| 3.483 | 0.011 |
| 3.484 | 0.011 |
| 3.485 | 0.011 |
| 3.486 | 0.01 |
| 3.487 | 0.01 |
| 3.488 | 0.01 |
| 3.489 | 0.01 |
| 3.49 | 0.01 |
| 3.491 | 0.01 |
| 3.492 | 0.01 |
| 3.493 | 0.01 |
| 3.494 | 0.01 |
| 3.495 | 0.01 |
| 3.496 | 0.009 |
| 3.497 | 0.009 |
| 3.498 | 0.009 |
| 3.499 | 0.009 |
| 3.5 | 0.009 |
| 3.501 | 0.009 |
| 3.502 | 0.009 |
| 3.503 | 0.009 |
| 3.504 | 0.009 |
| 3.505 | 0.009 |
| 3.506 | 0.009 |
| 3.507 | 0.008 |
| 3.508 | 0.008 |
| 3.509 | 0.008 |
| 3.51 | 0.008 |
| 3.511 | 0.008 |
| 3.512 | 0.008 |
| 3.513 | 0.008 |
| 3.514 | 0.008 |
| 3.515 | 0.008 |
| 3.516 | 0.008 |
| 3.517 | 0.008 |
| 3.518 | 0.008 |
| 3.519 | 0.008 |
| 3.52 | 0.007 |
| 3.521 | 0.007 |
| 3.522 | 0.007 |
| 3.523 | 0.007 |
| 3.524 | 0.007 |
| 3.525 | 0.007 |
| 3.526 | 0.007 |
| 3.527 | 0.007 |
| 3.528 | 0.007 |
| 3.529 | 0.007 |
| 3.53 | 0.007 |
| 3.531 | 0.007 |
| 3.532 | 0.007 |
| 3.533 | 0.006 |
| 3.534 | 0.006 |
| 3.535 | 0.006 |
| 3.536 | 0.006 |
| 3.537 | 0.006 |
| 3.538 | 0.006 |
| 3.539 | 0.006 |
| 3.54 | 0.006 |
| 3.541 | 0.006 |
| 3.542 | 0.006 |
| 3.543 | 0.006 |
| 3.544 | 0.006 |
| 3.545 | 0.006 |
| 3.546 | 0.006 |
| 3.547 | 0.006 |
| 3.548 | 0.006 |
| 3.549 | 0.005 |
| 3.55 | 0.005 |
| 3.551 | 0.005 |
| 3.552 | 0.005 |
| 3.553 | 0.005 |
| 3.554 | 0.005 |
| 3.555 | 0.005 |
| 3.556 | 0.005 |
| 3.557 | 0.005 |
| 3.558 | 0.005 |
| 3.559 | 0.005 |
| 3.56 | 0.005 |
| 3.561 | 0.005 |
| 3.562 | 0.005 |
| 3.563 | 0.005 |
| 3.564 | 0.005 |
| 3.565 | 0.005 |
| 3.566 | 0.005 |
| 3.567 | 0.004 |
| 3.568 | 0.004 |
| 3.569 | 0.004 |
| 3.57 | 0.004 |
| 3.571 | 0.004 |
| 3.572 | 0.004 |
| 3.573 | 0.004 |
| 3.574 | 0.004 |
| 3.575 | 0.004 |
| 3.576 | 0.004 |
| 3.577 | 0.004 |
| 3.578 | 0.004 |
| 3.579 | 0.004 |
| 3.58 | 0.004 |
| 3.581 | 0.004 |
| 3.582 | 0.004 |
| 3.583 | 0.004 |
| 3.584 | 0.004 |
| 3.585 | 0.004 |
| 3.586 | 0.004 |
| 3.587 | 0.004 |
| 3.588 | 0.004 |
| 3.589 | 0.003 |
| 3.59 | 0.003 |
| 3.591 | 0.003 |
| 3.592 | 0.003 |
| 3.593 | 0.003 |
| 3.594 | 0.003 |
| 3.595 | 0.003 |
| 3.596 | 0.003 |
| 3.597 | 0.003 |
| 3.598 | 0.003 |
| 3.599 | 0.003 |
| 3.6 | 0.003 |
| 3.601 | 0.003 |
| 3.602 | 0.003 |
| 3.603 | 0.003 |
| 3.604 | 0.003 |
| 3.605 | 0.003 |
| 3.606 | 0.003 |
| 3.607 | 0.003 |
| 3.608 | 0.003 |
| 3.609 | 0.003 |
| 3.61 | 0.003 |
| 3.611 | 0.003 |
| 3.612 | 0.003 |
| 3.613 | 0.003 |
| 3.614 | 0.003 |
| 3.615 | 0.003 |
| 3.616 | 0.002 |
| 3.617 | 0.002 |
| 3.618 | 0.002 |
| 3.619 | 0.002 |
| 3.62 | 0.002 |
| 3.621 | 0.002 |
| 3.622 | 0.002 |
| 3.623 | 0.002 |
| 3.624 | 0.002 |
| 3.625 | 0.002 |
| 3.626 | 0.002 |
| 3.627 | 0.002 |
| 3.628 | 0.002 |
| 3.629 | 0.002 |
| 3.63 | 0.002 |
| 3.631 | 0.002 |
| 3.632 | 0.002 |
| 3.633 | 0.002 |
| 3.634 | 0.002 |
| 3.635 | 0.002 |
| 3.636 | 0.002 |
| 3.637 | 0.002 |
| 3.638 | 0.002 |
| 3.639 | 0.002 |
| 3.64 | 0.002 |
| 3.641 | 0.002 |
| 3.642 | 0.002 |
| 3.643 | 0.002 |
| 3.644 | 0.002 |
| 3.645 | 0.002 |
| 3.646 | 0.002 |
| 3.647 | 0.002 |
| 3.648 | 0.002 |
| 3.649 | 0.002 |
| 3.65 | 0.002 |
| 3.651 | 0.002 |
| 3.652 | 0.002 |
| 3.653 | 0.002 |
| 3.654 | 0.002 |
| 3.655 | 0.002 |
| 3.656 | 0.002 |
| 3.657 | 0.001 |
| 3.658 | 0.001 |
| 3.659 | 0.001 |
| 3.66 | 0.001 |
| 3.661 | 0.001 |
| 3.662 | 0.001 |
| 3.663 | 0.001 |
| 3.664 | 0.001 |
| 3.665 | 0.001 |
| 3.666 | 0.001 |
| 3.667 | 0.001 |
| 3.668 | 0.001 |
| 3.669 | 0.001 |
| 3.67 | 0.001 |
| 3.671 | 0.001 |
| 3.672 | 0.001 |
| 3.673 | 0.001 |
| 3.674 | 0.001 |
| 3.675 | 0.001 |
| 3.676 | 0.001 |
| 3.677 | 0.001 |
| 3.678 | 0.001 |
| 3.679 | 0.001 |
| 3.68 | 0.001 |
| 3.681 | 0.001 |
| 3.682 | 0.001 |
| 3.683 | 0.001 |
| 3.684 | 0.001 |
| 3.685 | 0.001 |
| 3.686 | 0.001 |
| 3.687 | 0.001 |
| 3.688 | 0.001 |
| 3.689 | 0.001 |
| 3.69 | 0.001 |
| 3.691 | 0.001 |
| 3.692 | 0.001 |
| 3.693 | 0.001 |
| 3.694 | 0.001 |
| 3.695 | 0.001 |
| 3.696 | 0.001 |
| 3.697 | 0.001 |
| 3.698 | 0.001 |
| 3.699 | 0.001 |
| 3.7 | 0.001 |
| 3.701 | 0.001 |
| 3.702 | 0.001 |
| 3.703 | 0.001 |
| 3.704 | 0.001 |
| 3.705 | 0.001 |
| 3.706 | 0.001 |
| 3.707 | 0.001 |
| 3.708 | 0.001 |
| 3.709 | 0.001 |
| 3.71 | 0.001 |
| 3.711 | 0.001 |
| 3.712 | 0.001 |
| 3.713 | 0.001 |
| 3.714 | 0.001 |
| 3.715 | 0.001 |
| 3.716 | 0.001 |
| 3.717 | 0.001 |
| 3.718 | 0.001 |
| 3.719 | 0.001 |
| 3.72 | 0.001 |
| 3.721 | 0.001 |
| 3.722 | 0.001 |
| 3.723 | 0.001 |
| 3.724 | 0.001 |
| 3.725 | 0.001 |
| 3.726 | 0.001 |
| 3.727 | 0.001 |
| 3.728 | 0.001 |
| 3.729 | 0.001 |
| 3.73 | 0.001 |
| 3.731 | 0.001 |
| 3.732 | 0.001 |
| 3.733 | 0.001 |
| 3.734 | 0.001 |
| 3.735 | 0.001 |
| 3.736 | 0 |
| 3.737 | 0 |
| 3.738 | 0 |
| 3.739 | 0 |
| 3.74 | 0 |
| 3.741 | 0 |
| 3.742 | 0 |
| 3.743 | 0 |
| 3.744 | 0 |
| 3.745 | 0 |
| 3.746 | 0 |
| 3.747 | 0 |
| 3.748 | 0 |
| 3.749 | 0 |
| 3.75 | 0 |
| 3.751 | 0 |
| 3.752 | 0 |
| 3.753 | 0 |
| 3.754 | 0 |
| 3.755 | 0 |
| 3.756 | 0 |
| 3.757 | 0 |
| 3.758 | 0 |
| 3.759 | 0 |
| 3.76 | 0 |
| 3.761 | 0 |
| 3.762 | 0 |
| 3.763 | 0 |
| 3.764 | 0 |
| 3.765 | 0 |
| 3.766 | 0 |
| 3.767 | 0 |
| 3.768 | 0 |
| 3.769 | 0 |
| 3.77 | 0 |
| 3.771 | 0 |
| 3.772 | 0 |
| 3.773 | 0 |
| 3.774 | 0 |
| 3.775 | 0 |
| 3.776 | 0 |
| 3.777 | 0 |
| 3.778 | 0 |
| 3.779 | 0 |
| 3.78 | 0 |
| 3.781 | 0 |
| 3.782 | 0 |
| 3.783 | 0 |
| 3.784 | 0 |
| 3.785 | 0 |
| 3.786 | 0 |
| 3.787 | 0 |
| 3.788 | 0 |
| 3.789 | 0 |
| 3.79 | 0 |
| 3.791 | 0 |
| 3.792 | 0 |
| 3.793 | 0 |
| 3.794 | 0 |
| 3.795 | 0 |
| 3.796 | 0 |
| 3.797 | 0 |
| 3.798 | 0 |
| 3.799 | 0 |
| 3.8 | 0 |
| 3.801 | 0 |
| 3.802 | 0 |
| 3.803 | 0 |
| 3.804 | 0 |
| 3.805 | 0 |
| 3.806 | 0 |
| 3.807 | 0 |
| 3.808 | 0 |
| 3.809 | 0 |
| 3.81 | 0 |
| 3.811 | 0 |
| 3.812 | 0 |
| 3.813 | 0 |
| 3.814 | 0 |
| 3.815 | 0 |
| 3.816 | 0 |
| 3.817 | 0 |
| 3.818 | 0 |
| 3.819 | 0 |
| 3.82 | 0 |
| 3.821 | 0 |
| 3.822 | 0 |
| 3.823 | 0 |
| 3.824 | 0 |
| 3.825 | 0 |
| 3.826 | 0 |
| 3.827 | 0 |
| 3.828 | 0 |
| 3.829 | 0 |
| 3.83 | 0 |
| 3.831 | 0 |
| 3.832 | 0 |
| 3.833 | 0 |
| 3.834 | 0 |
| 3.835 | 0 |
| 3.836 | 0 |
| 3.837 | 0 |
| 3.838 | 0 |
| 3.839 | 0 |
| 3.84 | 0 |
| 3.841 | 0 |
| 3.842 | 0 |
| 3.843 | 0 |
| 3.844 | 0 |
| 3.845 | 0 |
| 3.846 | 0 |
| 3.847 | 0 |
| 3.848 | 0 |
| 3.849 | 0 |
| 3.85 | 0 |
| 3.851 | 0 |
| 3.852 | 0 |
| 3.853 | 0 |
| 3.854 | 0 |
| 3.855 | 0 |
| 3.856 | 0 |
| 3.857 | 0 |
| 3.858 | 0 |
| 3.859 | 0 |
| 3.86 | 0 |
| 3.861 | 0 |
| 3.862 | 0 |
| 3.863 | 0 |
| 3.864 | 0 |
| 3.865 | 0 |
| 3.866 | 0 |
| 3.867 | 0 |
| 3.868 | 0 |
| 3.869 | 0 |
| 3.87 | 0 |
| 3.871 | 0 |
| 3.872 | 0 |
| 3.873 | 0 |
| 3.874 | 0 |
| 3.875 | 0 |
| 3.876 | 0 |
| 3.877 | 0 |
| 3.878 | 0 |
| 3.879 | 0 |
| 3.88 | 0 |
| 3.881 | 0 |
| 3.882 | 0 |
| 3.883 | 0 |
| 3.884 | 0 |
| 3.885 | 0 |
| 3.886 | 0 |
| 3.887 | 0 |
| 3.888 | 0 |
| 3.889 | 0 |
| 3.89 | 0 |
| 3.891 | 0 |
| 3.892 | 0 |
| 3.893 | 0 |
| 3.894 | 0 |
| 3.895 | 0 |
| 3.896 | 0 |
| 3.897 | 0 |
| 3.898 | 0 |
| 3.899 | 0 |
| 3.9 | 0 |
| 3.901 | 0 |
| 3.902 | 0 |
| 3.903 | 0 |
| 3.904 | 0 |
| 3.905 | 0 |
| 3.906 | 0 |
| 3.907 | 0 |
| 3.908 | 0 |
| 3.909 | 0 |
| 3.91 | 0 |
| 3.911 | 0 |
| 3.912 | 0 |
| 3.913 | 0 |
| 3.914 | 0 |
| 3.915 | 0 |
| 3.916 | 0 |
| 3.917 | 0 |
| 3.918 | 0 |
| 3.919 | 0 |
| 3.92 | 0 |
| 3.921 | 0 |
| 3.922 | 0 |
| 3.923 | 0 |
| 3.924 | 0 |
| 3.925 | 0 |
| 3.926 | 0 |
| 3.927 | 0 |
| 3.928 | 0 |
| 3.929 | 0 |
| 3.93 | 0 |
| 3.931 | 0 |
| 3.932 | 0 |
| 3.933 | 0 |
| 3.934 | 0 |
| 3.935 | 0 |
| 3.936 | 0 |
| 3.937 | 0 |
| 3.938 | 0 |
| 3.939 | 0 |
| 3.94 | 0 |
| 3.941 | 0 |
| 3.942 | 0 |
| 3.943 | 0 |
| 3.944 | 0 |
| 3.945 | 0 |
| 3.946 | 0 |
| 3.947 | 0 |
| 3.948 | 0 |
| 3.949 | 0 |
| 3.95 | 0 |
| 3.951 | 0 |
| 3.952 | 0 |
| 3.953 | 0 |
| 3.954 | 0 |
| 3.955 | 0 |
| 3.956 | 0 |
| 3.957 | 0 |
| 3.958 | 0 |
| 3.959 | 0 |
| 3.96 | 0 |
| 3.961 | 0 |
| 3.962 | 0 |
| 3.963 | 0 |
| 3.964 | 0 |
| 3.965 | 0 |
| 3.966 | 0 |
| 3.967 | 0 |
| 3.968 | 0 |
| 3.969 | 0 |
| 3.97 | 0 |
| 3.971 | 0 |
| 3.972 | 0 |
| 3.973 | 0 |
| 3.974 | 0 |
| 3.975 | 0 |
| 3.976 | 0 |
| 3.977 | 0 |
| 3.978 | 0 |
| 3.979 | 0 |
| 3.98 | 0 |
| 3.981 | 0 |
| 3.982 | 0 |
| 3.983 | 0 |
| 3.984 | 0 |
| 3.985 | 0 |
| 3.986 | 0 |
| 3.987 | 0 |
| 3.988 | 0 |
| 3.989 | 0 |
| 3.99 | 0 |
| 3.991 | 0 |
| 3.992 | 0 |
| 3.993 | 0 |
| 3.994 | 0 |
| 3.995 | 0 |
| 3.996 | 0 |
| 3.997 | 0 |
| 3.998 | 0 |
| 3.999 | 0 |
| 4.0 | 0 |
| 4.001 | 0 |
| 4.002 | 0 |
| 4.003 | 0 |
| 4.004 | 0 |
| 4.005 | 0 |
| 4.006 | 0 |
| 4.007 | 0 |
| 4.008 | 0 |
| 4.009 | 0 |
| 4.01 | 0 |
| 4.011 | 0 |
| 4.012 | 0 |
| 4.013 | 0 |
| 4.014 | 0 |
| 4.015 | 0 |
| 4.016 | 0 |
| 4.017 | 0 |
| 4.018 | 0 |
| 4.019 | 0 |
| 4.02 | 0 |
| 4.021 | 0 |
| 4.022 | 0 |
| 4.023 | 0 |
| 4.024 | 0 |
| 4.025 | 0 |
| 4.026 | 0 |
| 4.027 | 0 |
| 4.028 | 0 |
| 4.029 | 0 |
| 4.03 | 0 |
| 4.031 | 0 |
| 4.032 | 0 |
| 4.033 | 0 |
| 4.034 | 0 |
| 4.035 | 0 |
| 4.036 | 0 |
| 4.037 | 0 |
| 4.038 | 0 |
| 4.039 | 0 |
| 4.04 | 0 |
| 4.041 | 0 |
| 4.042 | 0 |
| 4.043 | 0 |
| 4.044 | 0 |
| 4.045 | 0 |
| 4.046 | 0 |
| 4.047 | 0 |
| 4.048 | 0 |
| 4.049 | 0 |
| 4.05 | 0 |
| 4.051 | 0 |
| 4.052 | 0 |
| 4.053 | 0 |
| 4.054 | 0 |
| 4.055 | 0 |
| 4.056 | 0 |
| 4.057 | 0 |
| 4.058 | 0 |
| 4.059 | 0 |
| 4.06 | 0 |
| 4.061 | 0 |
| 4.062 | 0 |
| 4.063 | 0 |
| 4.064 | 0 |
| 4.065 | 0 |
| 4.066 | 0 |
| 4.067 | 0 |
| 4.068 | 0 |
| 4.069 | 0 |
| 4.07 | 0 |
| 4.071 | 0 |
| 4.072 | 0 |
| 4.073 | 0 |
| 4.074 | 0 |
| 4.075 | 0 |
| 4.076 | 0 |
| 4.077 | 0 |
| 4.078 | 0 |
| 4.079 | 0 |
| 4.08 | 0 |
| 4.081 | 0 |
| 4.082 | 0 |
| 4.083 | 0 |
| 4.084 | 0 |
| 4.085 | 0 |
| 4.086 | 0 |
| 4.087 | 0 |
| 4.088 | 0 |
| 4.089 | 0 |
| 4.09 | 0 |
| 4.091 | 0 |
| 4.092 | 0 |
| 4.093 | 0 |
| 4.094 | 0 |
| 4.095 | 0 |
| 4.096 | 0 |
| 4.097 | 0 |
| 4.098 | 0 |
| 4.099 | 0 |
| 4.1 | 0 |
| 4.101 | 0 |
| 4.102 | 0 |
| 4.103 | 0 |
| 4.104 | 0 |
| 4.105 | 0 |
| 4.106 | 0 |
| 4.107 | 0 |
| 4.108 | 0 |
| 4.109 | 0 |
| 4.11 | 0 |
| 4.111 | 0 |
| 4.112 | 0 |
| 4.113 | 0 |
| 4.114 | 0 |
| 4.115 | 0 |
| 4.116 | 0 |
| 4.117 | 0 |
| 4.118 | 0 |
| 4.119 | 0 |
| 4.12 | 0 |
| 4.121 | 0 |
| 4.122 | 0 |
| 4.123 | 0 |
| 4.124 | 0 |
| 4.125 | 0 |
| 4.126 | 0 |
| 4.127 | 0 |
| 4.128 | 0 |
| 4.129 | 0.001 |
| 4.13 | 0.001 |
| 4.131 | 0.001 |
| 4.132 | 0.001 |
| 4.133 | 0.001 |
| 4.134 | 0.001 |
| 4.135 | 0.001 |
| 4.136 | 0.001 |
| 4.137 | 0.001 |
| 4.138 | 0.001 |
| 4.139 | 0.001 |
| 4.14 | 0.001 |
| 4.141 | 0.001 |
| 4.142 | 0.001 |
| 4.143 | 0.001 |
| 4.144 | 0.001 |
| 4.145 | 0.001 |
| 4.146 | 0.001 |
| 4.147 | 0.001 |
| 4.148 | 0.001 |
| 4.149 | 0.001 |
| 4.15 | 0.001 |
| 4.151 | 0.001 |
| 4.152 | 0.001 |
| 4.153 | 0.001 |
| 4.154 | 0.001 |
| 4.155 | 0.001 |
| 4.156 | 0.001 |
| 4.157 | 0.001 |
| 4.158 | 0.001 |
| 4.159 | 0.001 |
| 4.16 | 0.001 |
| 4.161 | 0.001 |
| 4.162 | 0.001 |
| 4.163 | 0.001 |
| 4.164 | 0.001 |
| 4.165 | 0.001 |
| 4.166 | 0.001 |
| 4.167 | 0.001 |
| 4.168 | 0.001 |
| 4.169 | 0.001 |
| 4.17 | 0.001 |
| 4.171 | 0.001 |
| 4.172 | 0.001 |
| 4.173 | 0.001 |
| 4.174 | 0.001 |
| 4.175 | 0.001 |
| 4.176 | 0.001 |
| 4.177 | 0.001 |
| 4.178 | 0.001 |
| 4.179 | 0.001 |
| 4.18 | 0.001 |
| 4.181 | 0.001 |
| 4.182 | 0.001 |
| 4.183 | 0.001 |
| 4.184 | 0.001 |
| 4.185 | 0.001 |
| 4.186 | 0.001 |
| 4.187 | 0.001 |
| 4.188 | 0.001 |
| 4.189 | 0.001 |
| 4.19 | 0.001 |
| 4.191 | 0.001 |
| 4.192 | 0.001 |
| 4.193 | 0.001 |
| 4.194 | 0.002 |
| 4.195 | 0.002 |
| 4.196 | 0.002 |
| 4.197 | 0.002 |
| 4.198 | 0.002 |
| 4.199 | 0.002 |
| 4.2 | 0.002 |
| 4.201 | 0.002 |
| 4.202 | 0.002 |
| 4.203 | 0.002 |
| 4.204 | 0.002 |
| 4.205 | 0.002 |
| 4.206 | 0.002 |
| 4.207 | 0.002 |
| 4.208 | 0.002 |
| 4.209 | 0.002 |
| 4.21 | 0.002 |
| 4.211 | 0.002 |
| 4.212 | 0.002 |
| 4.213 | 0.002 |
| 4.214 | 0.002 |
| 4.215 | 0.002 |
| 4.216 | 0.002 |
| 4.217 | 0.002 |
| 4.218 | 0.002 |
| 4.219 | 0.002 |
| 4.22 | 0.002 |
| 4.221 | 0.002 |
| 4.222 | 0.002 |
| 4.223 | 0.002 |
| 4.224 | 0.002 |
| 4.225 | 0.002 |
| 4.226 | 0.003 |
| 4.227 | 0.003 |
| 4.228 | 0.003 |
| 4.229 | 0.003 |
| 4.23 | 0.003 |
| 4.231 | 0.003 |
| 4.232 | 0.003 |
| 4.233 | 0.003 |
| 4.234 | 0.003 |
| 4.235 | 0.003 |
| 4.236 | 0.003 |
| 4.237 | 0.003 |
| 4.238 | 0.003 |
| 4.239 | 0.003 |
| 4.24 | 0.003 |
| 4.241 | 0.003 |
| 4.242 | 0.003 |
| 4.243 | 0.003 |
| 4.244 | 0.003 |
| 4.245 | 0.003 |
| 4.246 | 0.003 |
| 4.247 | 0.003 |
| 4.248 | 0.003 |
| 4.249 | 0.004 |
| 4.25 | 0.004 |
| 4.251 | 0.004 |
| 4.252 | 0.004 |
| 4.253 | 0.004 |
| 4.254 | 0.004 |
| 4.255 | 0.004 |
| 4.256 | 0.004 |
| 4.257 | 0.004 |
| 4.258 | 0.004 |
| 4.259 | 0.004 |
| 4.26 | 0.004 |
| 4.261 | 0.004 |
| 4.262 | 0.004 |
| 4.263 | 0.004 |
| 4.264 | 0.004 |
| 4.265 | 0.005 |
| 4.266 | 0.005 |
| 4.267 | 0.005 |
| 4.268 | 0.005 |
| 4.269 | 0.005 |
| 4.27 | 0.005 |
| 4.271 | 0.005 |
| 4.272 | 0.005 |
| 4.273 | 0.005 |
| 4.274 | 0.005 |
| 4.275 | 0.005 |
| 4.276 | 0.005 |
| 4.277 | 0.005 |
| 4.278 | 0.005 |
| 4.279 | 0.006 |
| 4.28 | 0.006 |
| 4.281 | 0.006 |
| 4.282 | 0.006 |
| 4.283 | 0.006 |
| 4.284 | 0.006 |
| 4.285 | 0.006 |
| 4.286 | 0.006 |
| 4.287 | 0.006 |
| 4.288 | 0.006 |
| 4.289 | 0.006 |
| 4.29 | 0.006 |
| 4.291 | 0.007 |
| 4.292 | 0.007 |
| 4.293 | 0.007 |
| 4.294 | 0.007 |
| 4.295 | 0.007 |
| 4.296 | 0.007 |
| 4.297 | 0.007 |
| 4.298 | 0.007 |
| 4.299 | 0.007 |
| 4.3 | 0.007 |
| 4.301 | 0.008 |
| 4.302 | 0.008 |
| 4.303 | 0.008 |
| 4.304 | 0.008 |
| 4.305 | 0.008 |
| 4.306 | 0.008 |
| 4.307 | 0.008 |
| 4.308 | 0.008 |
| 4.309 | 0.008 |
| 4.31 | 0.009 |
| 4.311 | 0.009 |
| 4.312 | 0.009 |
| 4.313 | 0.009 |
| 4.314 | 0.009 |
| 4.315 | 0.009 |
| 4.316 | 0.009 |
| 4.317 | 0.009 |
| 4.318 | 0.01 |
| 4.319 | 0.01 |
| 4.32 | 0.01 |
| 4.321 | 0.01 |
| 4.322 | 0.01 |
| 4.323 | 0.01 |
| 4.324 | 0.01 |
| 4.325 | 0.011 |
| 4.326 | 0.011 |
| 4.327 | 0.011 |
| 4.328 | 0.011 |
| 4.329 | 0.011 |
| 4.33 | 0.011 |
| 4.331 | 0.011 |
| 4.332 | 0.012 |
| 4.333 | 0.012 |
| 4.334 | 0.012 |
| 4.335 | 0.012 |
| 4.336 | 0.012 |
| 4.337 | 0.012 |
| 4.338 | 0.012 |
| 4.339 | 0.013 |
| 4.34 | 0.013 |
| 4.341 | 0.013 |
| 4.342 | 0.013 |
| 4.343 | 0.013 |
| 4.344 | 0.014 |
| 4.345 | 0.014 |
| 4.346 | 0.014 |
| 4.347 | 0.014 |
| 4.348 | 0.014 |
| 4.349 | 0.014 |
| 4.35 | 0.015 |
| 4.351 | 0.015 |
| 4.352 | 0.015 |
| 4.353 | 0.015 |
| 4.354 | 0.015 |
| 4.355 | 0.016 |
| 4.356 | 0.016 |
| 4.357 | 0.016 |
| 4.358 | 0.016 |
| 4.359 | 0.016 |
| 4.36 | 0.017 |
| 4.361 | 0.017 |
| 4.362 | 0.017 |
| 4.363 | 0.017 |
| 4.364 | 0.018 |
| 4.365 | 0.018 |
| 4.366 | 0.018 |
| 4.367 | 0.018 |
| 4.368 | 0.018 |
| 4.369 | 0.019 |
| 4.37 | 0.019 |
| 4.371 | 0.019 |
| 4.372 | 0.019 |
| 4.373 | 0.02 |
| 4.374 | 0.02 |
| 4.375 | 0.02 |
| 4.376 | 0.02 |
| 4.377 | 0.021 |
| 4.378 | 0.021 |
| 4.379 | 0.021 |
| 4.38 | 0.021 |
| 4.381 | 0.022 |
| 4.382 | 0.022 |
| 4.383 | 0.022 |
| 4.384 | 0.022 |
| 4.385 | 0.023 |
| 4.386 | 0.023 |
| 4.387 | 0.023 |
| 4.388 | 0.024 |
| 4.389 | 0.024 |
| 4.39 | 0.024 |
| 4.391 | 0.025 |
| 4.392 | 0.025 |
| 4.393 | 0.025 |
| 4.394 | 0.025 |
| 4.395 | 0.026 |
| 4.396 | 0.026 |
| 4.397 | 0.026 |
| 4.398 | 0.027 |
| 4.399 | 0.027 |
| 4.4 | 0.027 |
| 4.401 | 0.028 |
| 4.402 | 0.028 |
| 4.403 | 0.028 |
| 4.404 | 0.029 |
| 4.405 | 0.029 |
| 4.406 | 0.029 |
| 4.407 | 0.03 |
| 4.408 | 0.03 |
| 4.409 | 0.03 |
| 4.41 | 0.031 |
| 4.411 | 0.031 |
| 4.412 | 0.032 |
| 4.413 | 0.032 |
| 4.414 | 0.032 |
| 4.415 | 0.033 |
| 4.416 | 0.033 |
| 4.417 | 0.033 |
| 4.418 | 0.034 |
| 4.419 | 0.034 |
| 4.42 | 0.035 |
| 4.421 | 0.035 |
| 4.422 | 0.035 |
| 4.423 | 0.036 |
| 4.424 | 0.036 |
| 4.425 | 0.037 |
| 4.426 | 0.037 |
| 4.427 | 0.038 |
| 4.428 | 0.038 |
| 4.429 | 0.038 |
| 4.43 | 0.039 |
| 4.431 | 0.039 |
| 4.432 | 0.04 |
| 4.433 | 0.04 |
| 4.434 | 0.041 |
| 4.435 | 0.041 |
| 4.436 | 0.042 |
| 4.437 | 0.042 |
| 4.438 | 0.042 |
| 4.439 | 0.043 |
| 4.44 | 0.043 |
| 4.441 | 0.044 |
| 4.442 | 0.044 |
| 4.443 | 0.045 |
| 4.444 | 0.045 |
| 4.445 | 0.046 |
| 4.446 | 0.046 |
| 4.447 | 0.047 |
| 4.448 | 0.047 |
| 4.449 | 0.048 |
| 4.45 | 0.049 |
| 4.451 | 0.049 |
| 4.452 | 0.05 |
| 4.453 | 0.05 |
| 4.454 | 0.051 |
| 4.455 | 0.051 |
| 4.456 | 0.052 |
| 4.457 | 0.052 |
| 4.458 | 0.053 |
| 4.459 | 0.054 |
| 4.46 | 0.054 |
| 4.461 | 0.055 |
| 4.462 | 0.055 |
| 4.463 | 0.056 |
| 4.464 | 0.057 |
| 4.465 | 0.057 |
| 4.466 | 0.058 |
| 4.467 | 0.058 |
| 4.468 | 0.059 |
| 4.469 | 0.06 |
| 4.47 | 0.06 |
| 4.471 | 0.061 |
| 4.472 | 0.062 |
| 4.473 | 0.062 |
| 4.474 | 0.063 |
| 4.475 | 0.064 |
| 4.476 | 0.064 |
| 4.477 | 0.065 |
| 4.478 | 0.066 |
| 4.479 | 0.066 |
| 4.48 | 0.067 |
| 4.481 | 0.068 |
| 4.482 | 0.068 |
| 4.483 | 0.069 |
| 4.484 | 0.07 |
| 4.485 | 0.07 |
| 4.486 | 0.071 |
| 4.487 | 0.072 |
| 4.488 | 0.073 |
| 4.489 | 0.073 |
| 4.49 | 0.074 |
| 4.491 | 0.075 |
| 4.492 | 0.076 |
| 4.493 | 0.076 |
| 4.494 | 0.077 |
| 4.495 | 0.078 |
| 4.496 | 0.079 |
| 4.497 | 0.08 |
| 4.498 | 0.08 |
| 4.499 | 0.081 |
| 4.5 | 0.082 |
| 4.501 | 0.083 |
| 4.502 | 0.084 |
| 4.503 | 0.085 |
| 4.504 | 0.085 |
| 4.505 | 0.086 |
| 4.506 | 0.087 |
| 4.507 | 0.088 |
| 4.508 | 0.089 |
| 4.509 | 0.09 |
| 4.51 | 0.091 |
| 4.511 | 0.092 |
| 4.512 | 0.092 |
| 4.513 | 0.093 |
| 4.514 | 0.094 |
| 4.515 | 0.095 |
| 4.516 | 0.096 |
| 4.517 | 0.097 |
| 4.518 | 0.098 |
| 4.519 | 0.099 |
| 4.52 | 0.1 |
| 4.521 | 0.101 |
| 4.522 | 0.102 |
| 4.523 | 0.103 |
| 4.524 | 0.104 |
| 4.525 | 0.105 |
| 4.526 | 0.106 |
| 4.527 | 0.107 |
| 4.528 | 0.108 |
| 4.529 | 0.109 |
| 4.53 | 0.11 |
| 4.531 | 0.111 |
| 4.532 | 0.112 |
| 4.533 | 0.113 |
| 4.534 | 0.114 |
| 4.535 | 0.115 |
| 4.536 | 0.116 |
| 4.537 | 0.117 |
| 4.538 | 0.118 |
| 4.539 | 0.119 |
| 4.54 | 0.121 |
| 4.541 | 0.122 |
| 4.542 | 0.123 |
| 4.543 | 0.124 |
| 4.544 | 0.125 |
| 4.545 | 0.126 |
| 4.546 | 0.127 |
| 4.547 | 0.128 |
| 4.548 | 0.13 |
| 4.549 | 0.131 |
| 4.55 | 0.132 |
| 4.551 | 0.133 |
| 4.552 | 0.134 |
| 4.553 | 0.136 |
| 4.554 | 0.137 |
| 4.555 | 0.138 |
| 4.556 | 0.139 |
| 4.557 | 0.141 |
| 4.558 | 0.142 |
| 4.559 | 0.143 |
| 4.56 | 0.144 |
| 4.561 | 0.146 |
| 4.562 | 0.147 |
| 4.563 | 0.148 |
| 4.564 | 0.149 |
| 4.565 | 0.151 |
| 4.566 | 0.152 |
| 4.567 | 0.153 |
| 4.568 | 0.155 |
| 4.569 | 0.156 |
| 4.57 | 0.157 |
| 4.571 | 0.159 |
| 4.572 | 0.16 |
| 4.573 | 0.161 |
| 4.574 | 0.163 |
| 4.575 | 0.164 |
| 4.576 | 0.166 |
| 4.577 | 0.167 |
| 4.578 | 0.168 |
| 4.579 | 0.17 |
| 4.58 | 0.171 |
| 4.581 | 0.173 |
| 4.582 | 0.174 |
| 4.583 | 0.176 |
| 4.584 | 0.177 |
| 4.585 | 0.179 |
| 4.586 | 0.18 |
| 4.587 | 0.182 |
| 4.588 | 0.183 |
| 4.589 | 0.185 |
| 4.59 | 0.186 |
| 4.591 | 0.188 |
| 4.592 | 0.189 |
| 4.593 | 0.191 |
| 4.594 | 0.192 |
| 4.595 | 0.194 |
| 4.596 | 0.196 |
| 4.597 | 0.197 |
| 4.598 | 0.199 |
| 4.599 | 0.2 |
| 4.6 | 0.202 |
| 4.601 | 0.204 |
| 4.602 | 0.205 |
| 4.603 | 0.207 |
| 4.604 | 0.208 |
| 4.605 | 0.21 |
| 4.606 | 0.212 |
| 4.607 | 0.213 |
| 4.608 | 0.215 |
| 4.609 | 0.217 |
| 4.61 | 0.218 |
| 4.611 | 0.22 |
| 4.612 | 0.222 |
| 4.613 | 0.224 |
| 4.614 | 0.225 |
| 4.615 | 0.227 |
| 4.616 | 0.229 |
| 4.617 | 0.231 |
| 4.618 | 0.232 |
| 4.619 | 0.234 |
| 4.62 | 0.236 |
| 4.621 | 0.238 |
| 4.622 | 0.24 |
| 4.623 | 0.241 |
| 4.624 | 0.243 |
| 4.625 | 0.245 |
| 4.626 | 0.247 |
| 4.627 | 0.249 |
| 4.628 | 0.251 |
| 4.628999999999999 | 0.252 |
| 4.63 | 0.254 |
| 4.631 | 0.256 |
| 4.632 | 0.258 |
| 4.633 | 0.26 |
| 4.634 | 0.262 |
| 4.635 | 0.264 |
| 4.636 | 0.266 |
| 4.636999999999999 | 0.268 |
| 4.638 | 0.27 |
| 4.639 | 0.272 |
| 4.64 | 0.274 |
| 4.641 | 0.276 |
| 4.642 | 0.278 |
| 4.643 | 0.28 |
| 4.644 | 0.282 |
| 4.644999999999999 | 0.284 |
| 4.646 | 0.286 |
| 4.647 | 0.288 |
| 4.648 | 0.29 |
| 4.649 | 0.292 |
| 4.65 | 0.294 |
| 4.651 | 0.296 |
| 4.652 | 0.298 |
| 4.652999999999999 | 0.3 |
| 4.654 | 0.302 |
| 4.655 | 0.304 |
| 4.656 | 0.306 |
| 4.657 | 0.308 |
| 4.658 | 0.31 |
| 4.659 | 0.313 |
| 4.66 | 0.315 |
| 4.660999999999999 | 0.317 |
| 4.662 | 0.319 |
| 4.663 | 0.321 |
| 4.664 | 0.323 |
| 4.665 | 0.326 |
| 4.666 | 0.328 |
| 4.667 | 0.33 |
| 4.668 | 0.332 |
| 4.668999999999999 | 0.334 |
| 4.67 | 0.337 |
| 4.671 | 0.339 |
| 4.672 | 0.341 |
| 4.673 | 0.343 |
| 4.674 | 0.346 |
| 4.675 | 0.348 |
| 4.676 | 0.35 |
| 4.677 | 0.352 |
| 4.678 | 0.355 |
| 4.679 | 0.357 |
| 4.68 | 0.359 |
| 4.681 | 0.361 |
| 4.682 | 0.364 |
| 4.683 | 0.366 |
| 4.684 | 0.368 |
| 4.685 | 0.371 |
| 4.686 | 0.373 |
| 4.687 | 0.375 |
| 4.688 | 0.378 |
| 4.689 | 0.38 |
| 4.69 | 0.383 |
| 4.691 | 0.385 |
| 4.692 | 0.387 |
| 4.693 | 0.39 |
| 4.694 | 0.392 |
| 4.695 | 0.394 |
| 4.696 | 0.397 |
| 4.697 | 0.399 |
| 4.698 | 0.402 |
| 4.699 | 0.404 |
| 4.7 | 0.407 |
| 4.701 | 0.409 |
| 4.702 | 0.411 |
| 4.703 | 0.414 |
| 4.704 | 0.416 |
| 4.705 | 0.419 |
| 4.706 | 0.421 |
| 4.707 | 0.424 |
| 4.708 | 0.426 |
| 4.709 | 0.429 |
| 4.71 | 0.431 |
| 4.711 | 0.434 |
| 4.712 | 0.436 |
| 4.713 | 0.439 |
| 4.714 | 0.441 |
| 4.715 | 0.444 |
| 4.716 | 0.446 |
| 4.717 | 0.449 |
| 4.718 | 0.451 |
| 4.719 | 0.454 |
| 4.72 | 0.457 |
| 4.721 | 0.459 |
| 4.722 | 0.462 |
| 4.723 | 0.464 |
| 4.724 | 0.467 |
| 4.725 | 0.469 |
| 4.726 | 0.472 |
| 4.727 | 0.475 |
| 4.728 | 0.477 |
| 4.729 | 0.48 |
| 4.73 | 0.482 |
| 4.731 | 0.485 |
| 4.732 | 0.488 |
| 4.733 | 0.49 |
| 4.734 | 0.493 |
| 4.735 | 0.495 |
| 4.736 | 0.498 |
| 4.737 | 0.501 |
| 4.738 | 0.503 |
| 4.739 | 0.506 |
| 4.74 | 0.509 |
| 4.741 | 0.511 |
| 4.742 | 0.514 |
| 4.743 | 0.517 |
| 4.744 | 0.519 |
| 4.745 | 0.522 |
| 4.746 | 0.525 |
| 4.747 | 0.527 |
| 4.748 | 0.53 |
| 4.749 | 0.533 |
| 4.75 | 0.535 |
| 4.751 | 0.538 |
| 4.752 | 0.541 |
| 4.753 | 0.543 |
| 4.753999999999999 | 0.546 |
| 4.755 | 0.549 |
| 4.756 | 0.551 |
| 4.757 | 0.554 |
| 4.758 | 0.557 |
| 4.759 | 0.559 |
| 4.76 | 0.562 |
| 4.761 | 0.565 |
| 4.761999999999999 | 0.568 |
| 4.763 | 0.57 |
| 4.764 | 0.573 |
| 4.765 | 0.576 |
| 4.766 | 0.578 |
| 4.767 | 0.581 |
| 4.768 | 0.584 |
| 4.769 | 0.586 |
| 4.769999999999999 | 0.589 |
| 4.771 | 0.592 |
| 4.772 | 0.595 |
| 4.773 | 0.597 |
| 4.774 | 0.6 |
| 4.775 | 0.603 |
| 4.776 | 0.605 |
| 4.777 | 0.608 |
| 4.778 | 0.611 |
| 4.779 | 0.614 |
| 4.78 | 0.616 |
| 4.781 | 0.619 |
| 4.782 | 0.622 |
| 4.783 | 0.624 |
| 4.784 | 0.627 |
| 4.785 | 0.63 |
| 4.786 | 0.633 |
| 4.787 | 0.635 |
| 4.788 | 0.638 |
| 4.789 | 0.641 |
| 4.79 | 0.643 |
| 4.791 | 0.646 |
| 4.792 | 0.649 |
| 4.793 | 0.651 |
| 4.794 | 0.654 |
| 4.795 | 0.657 |
| 4.796 | 0.66 |
| 4.797 | 0.662 |
| 4.798 | 0.665 |
| 4.799 | 0.668 |
| 4.8 | 0.67 |
| 4.801 | 0.673 |
| 4.802 | 0.676 |
| 4.803 | 0.678 |
| 4.804 | 0.681 |
| 4.805 | 0.684 |
| 4.806 | 0.686 |
| 4.807 | 0.689 |
| 4.808 | 0.692 |
| 4.809 | 0.694 |
| 4.81 | 0.697 |
| 4.811 | 0.7 |
| 4.812 | 0.702 |
| 4.813 | 0.705 |
| 4.814 | 0.708 |
| 4.815 | 0.71 |
| 4.816 | 0.713 |
| 4.817 | 0.715 |
| 4.818 | 0.718 |
| 4.819 | 0.721 |
| 4.82 | 0.723 |
| 4.821 | 0.726 |
| 4.822 | 0.728 |
| 4.823 | 0.731 |
| 4.824 | 0.734 |
| 4.825 | 0.736 |
| 4.826 | 0.739 |
| 4.827 | 0.741 |
| 4.828 | 0.744 |
| 4.829 | 0.746 |
| 4.83 | 0.749 |
| 4.831 | 0.752 |
| 4.832 | 0.754 |
| 4.833 | 0.757 |
| 4.834 | 0.759 |
| 4.835 | 0.762 |
| 4.836 | 0.764 |
| 4.837 | 0.767 |
| 4.838 | 0.769 |
| 4.839 | 0.772 |
| 4.84 | 0.774 |
| 4.841 | 0.777 |
| 4.842 | 0.779 |
| 4.843 | 0.782 |
| 4.844 | 0.784 |
| 4.845 | 0.786 |
| 4.846 | 0.789 |
| 4.847 | 0.791 |
| 4.848 | 0.794 |
| 4.849 | 0.796 |
| 4.85 | 0.799 |
| 4.851 | 0.801 |
| 4.852 | 0.803 |
| 4.853 | 0.806 |
| 4.854 | 0.808 |
| 4.855 | 0.81 |
| 4.856 | 0.813 |
| 4.857 | 0.815 |
| 4.858 | 0.817 |
| 4.859 | 0.82 |
| 4.86 | 0.822 |
| 4.861 | 0.824 |
| 4.862 | 0.827 |
| 4.863 | 0.829 |
| 4.864 | 0.831 |
| 4.865 | 0.833 |
| 4.866 | 0.836 |
| 4.867 | 0.838 |
| 4.868 | 0.84 |
| 4.869 | 0.842 |
| 4.87 | 0.845 |
| 4.871 | 0.847 |
| 4.872 | 0.849 |
| 4.873 | 0.851 |
| 4.874 | 0.853 |
| 4.875 | 0.855 |
| 4.876 | 0.857 |
| 4.877 | 0.86 |
| 4.878 | 0.862 |
| 4.879 | 0.864 |
| 4.88 | 0.866 |
| 4.881 | 0.868 |
| 4.882 | 0.87 |
| 4.883 | 0.872 |
| 4.884 | 0.874 |
| 4.885 | 0.876 |
| 4.886 | 0.878 |
| 4.887 | 0.88 |
| 4.888 | 0.882 |
| 4.889 | 0.884 |
| 4.89 | 0.886 |
| 4.891 | 0.888 |
| 4.892 | 0.89 |
| 4.893 | 0.892 |
| 4.894 | 0.894 |
| 4.895 | 0.896 |
| 4.896 | 0.897 |
| 4.897 | 0.899 |
| 4.898 | 0.901 |
| 4.899 | 0.903 |
| 4.9 | 0.905 |
| 4.901 | 0.907 |
| 4.902 | 0.908 |
| 4.903 | 0.91 |
| 4.904 | 0.912 |
| 4.905 | 0.914 |
| 4.906 | 0.915 |
| 4.907 | 0.917 |
| 4.908 | 0.919 |
| 4.909 | 0.921 |
| 4.91 | 0.922 |
| 4.911 | 0.924 |
| 4.912 | 0.925 |
| 4.913 | 0.927 |
| 4.914 | 0.929 |
| 4.915 | 0.93 |
| 4.916 | 0.932 |
| 4.917 | 0.933 |
| 4.918 | 0.935 |
| 4.919 | 0.936 |
| 4.92 | 0.938 |
| 4.921 | 0.939 |
| 4.922 | 0.941 |
| 4.923 | 0.942 |
| 4.924 | 0.944 |
| 4.925 | 0.945 |
| 4.926 | 0.947 |
| 4.927 | 0.948 |
| 4.928 | 0.949 |
| 4.929 | 0.951 |
| 4.93 | 0.952 |
| 4.931 | 0.954 |
| 4.932 | 0.955 |
| 4.933 | 0.956 |
| 4.934 | 0.957 |
| 4.935 | 0.959 |
| 4.936 | 0.96 |
| 4.937 | 0.961 |
| 4.938 | 0.962 |
| 4.939 | 0.963 |
| 4.94 | 0.965 |
| 4.941 | 0.966 |
| 4.942 | 0.967 |
| 4.943 | 0.968 |
| 4.944 | 0.969 |
| 4.945 | 0.97 |
| 4.946 | 0.971 |
| 4.947 | 0.972 |
| 4.948 | 0.973 |
| 4.949 | 0.974 |
| 4.95 | 0.975 |
| 4.951 | 0.976 |
| 4.952 | 0.977 |
| 4.953 | 0.978 |
| 4.954 | 0.979 |
| 4.955 | 0.98 |
| 4.956 | 0.981 |
| 4.957 | 0.982 |
| 4.958 | 0.983 |
| 4.959 | 0.983 |
| 4.96 | 0.984 |
| 4.961 | 0.985 |
| 4.962 | 0.986 |
| 4.963 | 0.986 |
| 4.964 | 0.987 |
| 4.965 | 0.988 |
| 4.966 | 0.989 |
| 4.967 | 0.989 |
| 4.968 | 0.99 |
| 4.969 | 0.99 |
| 4.97 | 0.991 |
| 4.971 | 0.992 |
| 4.972 | 0.992 |
| 4.973 | 0.993 |
| 4.974 | 0.993 |
| 4.975 | 0.994 |
| 4.976 | 0.994 |
| 4.977 | 0.995 |
| 4.978 | 0.995 |
| 4.979 | 0.996 |
| 4.98 | 0.996 |
| 4.981 | 0.996 |
| 4.982 | 0.997 |
| 4.983 | 0.997 |
| 4.984 | 0.997 |
| 4.985 | 0.998 |
| 4.986 | 0.998 |
| 4.987 | 0.998 |
| 4.988 | 0.999 |
| 4.989 | 0.999 |
| 4.99 | 0.999 |
| 4.991 | 0.999 |
| 4.992 | 0.999 |
| 4.993 | 1 |
| 4.994 | 1 |
| 4.995 | 1 |
| 4.996 | 1 |
| 4.997 | 1 |
| 4.998 | 1 |
| 4.999 | 1 |
| 5.0 | 1 |
| 5.001 | 1 |
| 5.002 | 1 |
| 5.003 | 1 |
| 5.004 | 1 |
| 5.005 | 1 |
| 5.006 | 1 |
| 5.007 | 1 |
| 5.008 | 0.999 |
| 5.009 | 0.999 |
| 5.01 | 0.999 |
| 5.011 | 0.999 |
| 5.012 | 0.999 |
| 5.013 | 0.998 |
| 5.014 | 0.998 |
| 5.015 | 0.998 |
| 5.016 | 0.997 |
| 5.017 | 0.997 |
| 5.018 | 0.997 |
| 5.019 | 0.996 |
| 5.02 | 0.996 |
| 5.021 | 0.996 |
| 5.022 | 0.995 |
| 5.023 | 0.995 |
| 5.024 | 0.994 |
| 5.025 | 0.994 |
| 5.026 | 0.993 |
| 5.027 | 0.993 |
| 5.028 | 0.992 |
| 5.029 | 0.992 |
| 5.03 | 0.991 |
| 5.031 | 0.99 |
| 5.032 | 0.99 |
| 5.033 | 0.989 |
| 5.034 | 0.989 |
| 5.035 | 0.988 |
| 5.036 | 0.987 |
| 5.037 | 0.986 |
| 5.038 | 0.986 |
| 5.039 | 0.985 |
| 5.04 | 0.984 |
| 5.041 | 0.983 |
| 5.042 | 0.983 |
| 5.043 | 0.982 |
| 5.044 | 0.981 |
| 5.045 | 0.98 |
| 5.046 | 0.979 |
| 5.047 | 0.978 |
| 5.048 | 0.977 |
| 5.049 | 0.976 |
| 5.05 | 0.975 |
| 5.051 | 0.974 |
| 5.052 | 0.973 |
| 5.053 | 0.972 |
| 5.054 | 0.971 |
| 5.055 | 0.97 |
| 5.056 | 0.969 |
| 5.057 | 0.968 |
| 5.058 | 0.967 |
| 5.059 | 0.966 |
| 5.06 | 0.965 |
| 5.061 | 0.963 |
| 5.062 | 0.962 |
| 5.063 | 0.961 |
| 5.064 | 0.96 |
| 5.065 | 0.959 |
| 5.066 | 0.957 |
| 5.067 | 0.956 |
| 5.068 | 0.955 |
| 5.069 | 0.954 |
| 5.07 | 0.952 |
| 5.071 | 0.951 |
| 5.072 | 0.949 |
| 5.073 | 0.948 |
| 5.074 | 0.947 |
| 5.075 | 0.945 |
| 5.076 | 0.944 |
| 5.077 | 0.942 |
| 5.078 | 0.941 |
| 5.079 | 0.939 |
| 5.08 | 0.938 |
| 5.081 | 0.936 |
| 5.082 | 0.935 |
| 5.083 | 0.933 |
| 5.084 | 0.932 |
| 5.085 | 0.93 |
| 5.086 | 0.929 |
| 5.087 | 0.927 |
| 5.088 | 0.925 |
| 5.089 | 0.924 |
| 5.09 | 0.922 |
| 5.091 | 0.921 |
| 5.092 | 0.919 |
| 5.093 | 0.917 |
| 5.094 | 0.915 |
| 5.095 | 0.914 |
| 5.096 | 0.912 |
| 5.097 | 0.91 |
| 5.098 | 0.908 |
| 5.099 | 0.907 |
| 5.1 | 0.905 |
| 5.101 | 0.903 |
| 5.102 | 0.901 |
| 5.103 | 0.899 |
| 5.104 | 0.897 |
| 5.105 | 0.896 |
| 5.106 | 0.894 |
| 5.107 | 0.892 |
| 5.108 | 0.89 |
| 5.109 | 0.888 |
| 5.11 | 0.886 |
| 5.111 | 0.884 |
| 5.112 | 0.882 |
| 5.113 | 0.88 |
| 5.114 | 0.878 |
| 5.115 | 0.876 |
| 5.116 | 0.874 |
| 5.117 | 0.872 |
| 5.118 | 0.87 |
| 5.119 | 0.868 |
| 5.12 | 0.866 |
| 5.121 | 0.864 |
| 5.122 | 0.862 |
| 5.123 | 0.86 |
| 5.124 | 0.857 |
| 5.125 | 0.855 |
| 5.126 | 0.853 |
| 5.127 | 0.851 |
| 5.128 | 0.849 |
| 5.129 | 0.847 |
| 5.13 | 0.845 |
| 5.131 | 0.842 |
| 5.132 | 0.84 |
| 5.133 | 0.838 |
| 5.134 | 0.836 |
| 5.135 | 0.833 |
| 5.136 | 0.831 |
| 5.137 | 0.829 |
| 5.138 | 0.827 |
| 5.139 | 0.824 |
| 5.14 | 0.822 |
| 5.141 | 0.82 |
| 5.142 | 0.817 |
| 5.143 | 0.815 |
| 5.144 | 0.813 |
| 5.145 | 0.81 |
| 5.146 | 0.808 |
| 5.147 | 0.806 |
| 5.148 | 0.803 |
| 5.149 | 0.801 |
| 5.15 | 0.799 |
| 5.151 | 0.796 |
| 5.152 | 0.794 |
| 5.153 | 0.791 |
| 5.154 | 0.789 |
| 5.155 | 0.786 |
| 5.156 | 0.784 |
| 5.157 | 0.782 |
| 5.158 | 0.779 |
| 5.159 | 0.777 |
| 5.16 | 0.774 |
| 5.161 | 0.772 |
| 5.162 | 0.769 |
| 5.163 | 0.767 |
| 5.164 | 0.764 |
| 5.165 | 0.762 |
| 5.166 | 0.759 |
| 5.167 | 0.757 |
| 5.168 | 0.754 |
| 5.169 | 0.752 |
| 5.17 | 0.749 |
| 5.171 | 0.746 |
| 5.172 | 0.744 |
| 5.173 | 0.741 |
| 5.174 | 0.739 |
| 5.175 | 0.736 |
| 5.176 | 0.734 |
| 5.177 | 0.731 |
| 5.178 | 0.728 |
| 5.179 | 0.726 |
| 5.18 | 0.723 |
| 5.181 | 0.721 |
| 5.182 | 0.718 |
| 5.183 | 0.715 |
| 5.184 | 0.713 |
| 5.185 | 0.71 |
| 5.186 | 0.708 |
| 5.187 | 0.705 |
| 5.188 | 0.702 |
| 5.189 | 0.7 |
| 5.19 | 0.697 |
| 5.191 | 0.694 |
| 5.192 | 0.692 |
| 5.193 | 0.689 |
| 5.194 | 0.686 |
| 5.195 | 0.684 |
| 5.196 | 0.681 |
| 5.197 | 0.678 |
| 5.198 | 0.676 |
| 5.199 | 0.673 |
| 5.2 | 0.67 |
| 5.201 | 0.668 |
| 5.202 | 0.665 |
| 5.203 | 0.662 |
| 5.204 | 0.66 |
| 5.205 | 0.657 |
| 5.206 | 0.654 |
| 5.207 | 0.651 |
| 5.208 | 0.649 |
| 5.209 | 0.646 |
| 5.21 | 0.643 |
| 5.211 | 0.641 |
| 5.212 | 0.638 |
| 5.213 | 0.635 |
| 5.214 | 0.633 |
| 5.215 | 0.63 |
| 5.216 | 0.627 |
| 5.217 | 0.624 |
| 5.218 | 0.622 |
| 5.219 | 0.619 |
| 5.22 | 0.616 |
| 5.221 | 0.614 |
| 5.222 | 0.611 |
| 5.223 | 0.608 |
| 5.224 | 0.605 |
| 5.225 | 0.603 |
| 5.226 | 0.6 |
| 5.227 | 0.597 |
| 5.228 | 0.595 |
| 5.229 | 0.592 |
| 5.23 | 0.589 |
| 5.231 | 0.586 |
| 5.232 | 0.584 |
| 5.233 | 0.581 |
| 5.234 | 0.578 |
| 5.235 | 0.576 |
| 5.236 | 0.573 |
| 5.237 | 0.57 |
| 5.238 | 0.568 |
| 5.239 | 0.565 |
| 5.24 | 0.562 |
| 5.241 | 0.559 |
| 5.242 | 0.557 |
| 5.243 | 0.554 |
| 5.244 | 0.551 |
| 5.245 | 0.549 |
| 5.246 | 0.546 |
| 5.247 | 0.543 |
| 5.248 | 0.541 |
| 5.249 | 0.538 |
| 5.25 | 0.535 |
| 5.251 | 0.533 |
| 5.252 | 0.53 |
| 5.253 | 0.527 |
| 5.254 | 0.525 |
| 5.255 | 0.522 |
| 5.256 | 0.519 |
| 5.257 | 0.517 |
| 5.258 | 0.514 |
| 5.259 | 0.511 |
| 5.26 | 0.509 |
| 5.261 | 0.506 |
| 5.262 | 0.503 |
| 5.263 | 0.501 |
| 5.264 | 0.498 |
| 5.265 | 0.495 |
| 5.266 | 0.493 |
| 5.267 | 0.49 |
| 5.268 | 0.488 |
| 5.269 | 0.485 |
| 5.27 | 0.482 |
| 5.271 | 0.48 |
| 5.272 | 0.477 |
| 5.273 | 0.475 |
| 5.274 | 0.472 |
| 5.275 | 0.469 |
| 5.276 | 0.467 |
| 5.277 | 0.464 |
| 5.278 | 0.462 |
| 5.279 | 0.459 |
| 5.28 | 0.457 |
| 5.281 | 0.454 |
| 5.282 | 0.451 |
| 5.283 | 0.449 |
| 5.284 | 0.446 |
| 5.285 | 0.444 |
| 5.286 | 0.441 |
| 5.287 | 0.439 |
| 5.288 | 0.436 |
| 5.289 | 0.434 |
| 5.29 | 0.431 |
| 5.291 | 0.429 |
| 5.292 | 0.426 |
| 5.293 | 0.424 |
| 5.294 | 0.421 |
| 5.295 | 0.419 |
| 5.296 | 0.416 |
| 5.297 | 0.414 |
| 5.298 | 0.411 |
| 5.299 | 0.409 |
| 5.3 | 0.407 |
| 5.301 | 0.404 |
| 5.302 | 0.402 |
| 5.303 | 0.399 |
| 5.304 | 0.397 |
| 5.305 | 0.394 |
| 5.306 | 0.392 |
| 5.307 | 0.39 |
| 5.308 | 0.387 |
| 5.309 | 0.385 |
| 5.31 | 0.383 |
| 5.311 | 0.38 |
| 5.312 | 0.378 |
| 5.313 | 0.375 |
| 5.314 | 0.373 |
| 5.315 | 0.371 |
| 5.316 | 0.368 |
| 5.317 | 0.366 |
| 5.318 | 0.364 |
| 5.319 | 0.361 |
| 5.32 | 0.359 |
| 5.321 | 0.357 |
| 5.322 | 0.355 |
| 5.323 | 0.352 |
| 5.324 | 0.35 |
| 5.325 | 0.348 |
| 5.326 | 0.346 |
| 5.327 | 0.343 |
| 5.328 | 0.341 |
| 5.329 | 0.339 |
| 5.33 | 0.337 |
| 5.331 | 0.334 |
| 5.332 | 0.332 |
| 5.333 | 0.33 |
| 5.334 | 0.328 |
| 5.335 | 0.326 |
| 5.336 | 0.323 |
| 5.337 | 0.321 |
| 5.338 | 0.319 |
| 5.339 | 0.317 |
| 5.34 | 0.315 |
| 5.341 | 0.313 |
| 5.342 | 0.31 |
| 5.343 | 0.308 |
| 5.344 | 0.306 |
| 5.345 | 0.304 |
| 5.346 | 0.302 |
| 5.347 | 0.3 |
| 5.348 | 0.298 |
| 5.349 | 0.296 |
| 5.35 | 0.294 |
| 5.351 | 0.292 |
| 5.352 | 0.29 |
| 5.353 | 0.288 |
| 5.354 | 0.286 |
| 5.355 | 0.284 |
| 5.356 | 0.282 |
| 5.357 | 0.28 |
| 5.358 | 0.278 |
| 5.359 | 0.276 |
| 5.36 | 0.274 |
| 5.361 | 0.272 |
| 5.362 | 0.27 |
| 5.363 | 0.268 |
| 5.364 | 0.266 |
| 5.365 | 0.264 |
| 5.366 | 0.262 |
| 5.367 | 0.26 |
| 5.368 | 0.258 |
| 5.369 | 0.256 |
| 5.37 | 0.254 |
| 5.371 | 0.252 |
| 5.372 | 0.251 |
| 5.373 | 0.249 |
| 5.374 | 0.247 |
| 5.375 | 0.245 |
| 5.376 | 0.243 |
| 5.377 | 0.241 |
| 5.378 | 0.24 |
| 5.379 | 0.238 |
| 5.38 | 0.236 |
| 5.381 | 0.234 |
| 5.382 | 0.232 |
| 5.383 | 0.231 |
| 5.384 | 0.229 |
| 5.385 | 0.227 |
| 5.386 | 0.225 |
| 5.387 | 0.224 |
| 5.388 | 0.222 |
| 5.389 | 0.22 |
| 5.39 | 0.218 |
| 5.391 | 0.217 |
| 5.392 | 0.215 |
| 5.393 | 0.213 |
| 5.394 | 0.212 |
| 5.395 | 0.21 |
| 5.396 | 0.208 |
| 5.397 | 0.207 |
| 5.398 | 0.205 |
| 5.399 | 0.204 |
| 5.4 | 0.202 |
| 5.401 | 0.2 |
| 5.402 | 0.199 |
| 5.403 | 0.197 |
| 5.404 | 0.196 |
| 5.405 | 0.194 |
| 5.406 | 0.192 |
| 5.407 | 0.191 |
| 5.408 | 0.189 |
| 5.409 | 0.188 |
| 5.41 | 0.186 |
| 5.411 | 0.185 |
| 5.412 | 0.183 |
| 5.413 | 0.182 |
| 5.414 | 0.18 |
| 5.415 | 0.179 |
| 5.416 | 0.177 |
| 5.417 | 0.176 |
| 5.418 | 0.174 |
| 5.419 | 0.173 |
| 5.42 | 0.171 |
| 5.421 | 0.17 |
| 5.422 | 0.168 |
| 5.423 | 0.167 |
| 5.424 | 0.166 |
| 5.425 | 0.164 |
| 5.426 | 0.163 |
| 5.427 | 0.161 |
| 5.428 | 0.16 |
| 5.429 | 0.159 |
| 5.43 | 0.157 |
| 5.431 | 0.156 |
| 5.432 | 0.155 |
| 5.433 | 0.153 |
| 5.434 | 0.152 |
| 5.435 | 0.151 |
| 5.436 | 0.149 |
| 5.437 | 0.148 |
| 5.438 | 0.147 |
| 5.439 | 0.146 |
| 5.44 | 0.144 |
| 5.441 | 0.143 |
| 5.442 | 0.142 |
| 5.443 | 0.141 |
| 5.444 | 0.139 |
| 5.445 | 0.138 |
| 5.446 | 0.137 |
| 5.447 | 0.136 |
| 5.448 | 0.134 |
| 5.449 | 0.133 |
| 5.45 | 0.132 |
| 5.451 | 0.131 |
| 5.452 | 0.13 |
| 5.453 | 0.128 |
| 5.454 | 0.127 |
| 5.455 | 0.126 |
| 5.456 | 0.125 |
| 5.457 | 0.124 |
| 5.458 | 0.123 |
| 5.459 | 0.122 |
| 5.46 | 0.121 |
| 5.461 | 0.119 |
| 5.462 | 0.118 |
| 5.463 | 0.117 |
| 5.464 | 0.116 |
| 5.465 | 0.115 |
| 5.466 | 0.114 |
| 5.467 | 0.113 |
| 5.468 | 0.112 |
| 5.469 | 0.111 |
| 5.47 | 0.11 |
| 5.471 | 0.109 |
| 5.472 | 0.108 |
| 5.473 | 0.107 |
| 5.474 | 0.106 |
| 5.475 | 0.105 |
| 5.476 | 0.104 |
| 5.477 | 0.103 |
| 5.478 | 0.102 |
| 5.479 | 0.101 |
| 5.48 | 0.1 |
| 5.481 | 0.099 |
| 5.482 | 0.098 |
| 5.483 | 0.097 |
| 5.484 | 0.096 |
| 5.485 | 0.095 |
| 5.486 | 0.094 |
| 5.487 | 0.093 |
| 5.488 | 0.092 |
| 5.489 | 0.092 |
| 5.49 | 0.091 |
| 5.491 | 0.09 |
| 5.492 | 0.089 |
| 5.493 | 0.088 |
| 5.494 | 0.087 |
| 5.495 | 0.086 |
| 5.496 | 0.085 |
| 5.497 | 0.085 |
| 5.498 | 0.084 |
| 5.499 | 0.083 |
| 5.5 | 0.082 |
| 5.501 | 0.081 |
| 5.502 | 0.08 |
| 5.503 | 0.08 |
| 5.504 | 0.079 |
| 5.505 | 0.078 |
| 5.506 | 0.077 |
| 5.507 | 0.076 |
| 5.508 | 0.076 |
| 5.509 | 0.075 |
| 5.51 | 0.074 |
| 5.511 | 0.073 |
| 5.512 | 0.073 |
| 5.513 | 0.072 |
| 5.514 | 0.071 |
| 5.515 | 0.07 |
| 5.516 | 0.07 |
| 5.517 | 0.069 |
| 5.518 | 0.068 |
| 5.519 | 0.068 |
| 5.52 | 0.067 |
| 5.521 | 0.066 |
| 5.522 | 0.066 |
| 5.523 | 0.065 |
| 5.524 | 0.064 |
| 5.525 | 0.064 |
| 5.526 | 0.063 |
| 5.527 | 0.062 |
| 5.528 | 0.062 |
| 5.529 | 0.061 |
| 5.53 | 0.06 |
| 5.531 | 0.06 |
| 5.532 | 0.059 |
| 5.533 | 0.058 |
| 5.534 | 0.058 |
| 5.535 | 0.057 |
| 5.536 | 0.057 |
| 5.537 | 0.056 |
| 5.538 | 0.055 |
| 5.539 | 0.055 |
| 5.54 | 0.054 |
| 5.541 | 0.054 |
| 5.542 | 0.053 |
| 5.543 | 0.052 |
| 5.544 | 0.052 |
| 5.545 | 0.051 |
| 5.546 | 0.051 |
| 5.547 | 0.05 |
| 5.548 | 0.05 |
| 5.549 | 0.049 |
| 5.55 | 0.049 |
| 5.551 | 0.048 |
| 5.552 | 0.047 |
| 5.553 | 0.047 |
| 5.554 | 0.046 |
| 5.555 | 0.046 |
| 5.556 | 0.045 |
| 5.557 | 0.045 |
| 5.558 | 0.044 |
| 5.559 | 0.044 |
| 5.56 | 0.043 |
| 5.561 | 0.043 |
| 5.562 | 0.042 |
| 5.563 | 0.042 |
| 5.564 | 0.042 |
| 5.565 | 0.041 |
| 5.566 | 0.041 |
| 5.567 | 0.04 |
| 5.568 | 0.04 |
| 5.569 | 0.039 |
| 5.57 | 0.039 |
| 5.571 | 0.038 |
| 5.572 | 0.038 |
| 5.573 | 0.038 |
| 5.574 | 0.037 |
| 5.575 | 0.037 |
| 5.576 | 0.036 |
| 5.577 | 0.036 |
| 5.578 | 0.035 |
| 5.579 | 0.035 |
| 5.58 | 0.035 |
| 5.581 | 0.034 |
| 5.582 | 0.034 |
| 5.583 | 0.033 |
| 5.584 | 0.033 |
| 5.585 | 0.033 |
| 5.586 | 0.032 |
| 5.587 | 0.032 |
| 5.588 | 0.032 |
| 5.589 | 0.031 |
| 5.59 | 0.031 |
| 5.591 | 0.03 |
| 5.592 | 0.03 |
| 5.593 | 0.03 |
| 5.594 | 0.029 |
| 5.595 | 0.029 |
| 5.596 | 0.029 |
| 5.597 | 0.028 |
| 5.598 | 0.028 |
| 5.599 | 0.028 |
| 5.6 | 0.027 |
| 5.601 | 0.027 |
| 5.602 | 0.027 |
| 5.603 | 0.026 |
| 5.604 | 0.026 |
| 5.605 | 0.026 |
| 5.606 | 0.025 |
| 5.607 | 0.025 |
| 5.608 | 0.025 |
| 5.609 | 0.025 |
| 5.61 | 0.024 |
| 5.611 | 0.024 |
| 5.612 | 0.024 |
| 5.613 | 0.023 |
| 5.614 | 0.023 |
| 5.615 | 0.023 |
| 5.616 | 0.022 |
| 5.617 | 0.022 |
| 5.618 | 0.022 |
| 5.619 | 0.022 |
| 5.62 | 0.021 |
| 5.621 | 0.021 |
| 5.622 | 0.021 |
| 5.623 | 0.021 |
| 5.624 | 0.02 |
| 5.625 | 0.02 |
| 5.626 | 0.02 |
| 5.627 | 0.02 |
| 5.628 | 0.019 |
| 5.628999999999999 | 0.019 |
| 5.63 | 0.019 |
| 5.631 | 0.019 |
| 5.632 | 0.018 |
| 5.633 | 0.018 |
| 5.634 | 0.018 |
| 5.635 | 0.018 |
| 5.636 | 0.018 |
| 5.636999999999999 | 0.017 |
| 5.638 | 0.017 |
| 5.639 | 0.017 |
| 5.64 | 0.017 |
| 5.641 | 0.016 |
| 5.642 | 0.016 |
| 5.643 | 0.016 |
| 5.644 | 0.016 |
| 5.644999999999999 | 0.016 |
| 5.646 | 0.015 |
| 5.647 | 0.015 |
| 5.648 | 0.015 |
| 5.649 | 0.015 |
| 5.65 | 0.015 |
| 5.651 | 0.014 |
| 5.652 | 0.014 |
| 5.652999999999999 | 0.014 |
| 5.654 | 0.014 |
| 5.655 | 0.014 |
| 5.656 | 0.014 |
| 5.657 | 0.013 |
| 5.658 | 0.013 |
| 5.659 | 0.013 |
| 5.66 | 0.013 |
| 5.660999999999999 | 0.013 |
| 5.662 | 0.012 |
| 5.663 | 0.012 |
| 5.664 | 0.012 |
| 5.665 | 0.012 |
| 5.666 | 0.012 |
| 5.667 | 0.012 |
| 5.668 | 0.012 |
| 5.668999999999999 | 0.011 |
| 5.67 | 0.011 |
| 5.671 | 0.011 |
| 5.672 | 0.011 |
| 5.673 | 0.011 |
| 5.674 | 0.011 |
| 5.675 | 0.011 |
| 5.676 | 0.01 |
| 5.677 | 0.01 |
| 5.678 | 0.01 |
| 5.679 | 0.01 |
| 5.68 | 0.01 |
| 5.681 | 0.01 |
| 5.682 | 0.01 |
| 5.683 | 0.009 |
| 5.684 | 0.009 |
| 5.685 | 0.009 |
| 5.686 | 0.009 |
| 5.687 | 0.009 |
| 5.688 | 0.009 |
| 5.689 | 0.009 |
| 5.69 | 0.009 |
| 5.691 | 0.008 |
| 5.692 | 0.008 |
| 5.693 | 0.008 |
| 5.694 | 0.008 |
| 5.695 | 0.008 |
| 5.696 | 0.008 |
| 5.697 | 0.008 |
| 5.698 | 0.008 |
| 5.699 | 0.008 |
| 5.7 | 0.007 |
| 5.701 | 0.007 |
| 5.702 | 0.007 |
| 5.703 | 0.007 |
| 5.704 | 0.007 |
| 5.705 | 0.007 |
| 5.706 | 0.007 |
| 5.707 | 0.007 |
| 5.708 | 0.007 |
| 5.709 | 0.007 |
| 5.71 | 0.006 |
| 5.711 | 0.006 |
| 5.712 | 0.006 |
| 5.713 | 0.006 |
| 5.714 | 0.006 |
| 5.715 | 0.006 |
| 5.716 | 0.006 |
| 5.717 | 0.006 |
| 5.718 | 0.006 |
| 5.719 | 0.006 |
| 5.72 | 0.006 |
| 5.721 | 0.006 |
| 5.722 | 0.005 |
| 5.723 | 0.005 |
| 5.724 | 0.005 |
| 5.725 | 0.005 |
| 5.726 | 0.005 |
| 5.727 | 0.005 |
| 5.728 | 0.005 |
| 5.729 | 0.005 |
| 5.73 | 0.005 |
| 5.731 | 0.005 |
| 5.732 | 0.005 |
| 5.733 | 0.005 |
| 5.734 | 0.005 |
| 5.735 | 0.005 |
| 5.736 | 0.004 |
| 5.737 | 0.004 |
| 5.738 | 0.004 |
| 5.739 | 0.004 |
| 5.74 | 0.004 |
| 5.741 | 0.004 |
| 5.742 | 0.004 |
| 5.743 | 0.004 |
| 5.744 | 0.004 |
| 5.745 | 0.004 |
| 5.746 | 0.004 |
| 5.747 | 0.004 |
| 5.748 | 0.004 |
| 5.749 | 0.004 |
| 5.75 | 0.004 |
| 5.751 | 0.004 |
| 5.752 | 0.003 |
| 5.753 | 0.003 |
| 5.753999999999999 | 0.003 |
| 5.755 | 0.003 |
| 5.756 | 0.003 |
| 5.757 | 0.003 |
| 5.758 | 0.003 |
| 5.759 | 0.003 |
| 5.76 | 0.003 |
| 5.761 | 0.003 |
| 5.761999999999999 | 0.003 |
| 5.763 | 0.003 |
| 5.764 | 0.003 |
| 5.765 | 0.003 |
| 5.766 | 0.003 |
| 5.767 | 0.003 |
| 5.768 | 0.003 |
| 5.769 | 0.003 |
| 5.769999999999999 | 0.003 |
| 5.771 | 0.003 |
| 5.772 | 0.003 |
| 5.773 | 0.003 |
| 5.774 | 0.003 |
| 5.775 | 0.002 |
| 5.776 | 0.002 |
| 5.777 | 0.002 |
| 5.778 | 0.002 |
| 5.779 | 0.002 |
| 5.78 | 0.002 |
| 5.781 | 0.002 |
| 5.782 | 0.002 |
| 5.783 | 0.002 |
| 5.784 | 0.002 |
| 5.785 | 0.002 |
| 5.786 | 0.002 |
| 5.787 | 0.002 |
| 5.788 | 0.002 |
| 5.789 | 0.002 |
| 5.79 | 0.002 |
| 5.791 | 0.002 |
| 5.792 | 0.002 |
| 5.793 | 0.002 |
| 5.794 | 0.002 |
| 5.795 | 0.002 |
| 5.796 | 0.002 |
| 5.797 | 0.002 |
| 5.798 | 0.002 |
| 5.799 | 0.002 |
| 5.8 | 0.002 |
| 5.801 | 0.002 |
| 5.802 | 0.002 |
| 5.803 | 0.002 |
| 5.804 | 0.002 |
| 5.805 | 0.002 |
| 5.806 | 0.002 |
| 5.807 | 0.001 |
| 5.808 | 0.001 |
| 5.809 | 0.001 |
| 5.81 | 0.001 |
| 5.811 | 0.001 |
| 5.812 | 0.001 |
| 5.813 | 0.001 |
| 5.814 | 0.001 |
| 5.815 | 0.001 |
| 5.816 | 0.001 |
| 5.817 | 0.001 |
| 5.818 | 0.001 |
| 5.819 | 0.001 |
| 5.82 | 0.001 |
| 5.821 | 0.001 |
| 5.822 | 0.001 |
| 5.823 | 0.001 |
| 5.824 | 0.001 |
| 5.825 | 0.001 |
| 5.826 | 0.001 |
| 5.827 | 0.001 |
| 5.828 | 0.001 |
| 5.829 | 0.001 |
| 5.83 | 0.001 |
| 5.831 | 0.001 |
| 5.832 | 0.001 |
| 5.833 | 0.001 |
| 5.834 | 0.001 |
| 5.835 | 0.001 |
| 5.836 | 0.001 |
| 5.837 | 0.001 |
| 5.838 | 0.001 |
| 5.839 | 0.001 |
| 5.84 | 0.001 |
| 5.841 | 0.001 |
| 5.842 | 0.001 |
| 5.843 | 0.001 |
| 5.844 | 0.001 |
| 5.845 | 0.001 |
| 5.846 | 0.001 |
| 5.847 | 0.001 |
| 5.848 | 0.001 |
| 5.849 | 0.001 |
| 5.85 | 0.001 |
| 5.851 | 0.001 |
| 5.852 | 0.001 |
| 5.853 | 0.001 |
| 5.854 | 0.001 |
| 5.855 | 0.001 |
| 5.856 | 0.001 |
| 5.857 | 0.001 |
| 5.858 | 0.001 |
| 5.859 | 0.001 |
| 5.86 | 0.001 |
| 5.861 | 0.001 |
| 5.862 | 0.001 |
| 5.863 | 0.001 |
| 5.864 | 0.001 |
| 5.865 | 0.001 |
| 5.866 | 0.001 |
| 5.867 | 0.001 |
| 5.868 | 0.001 |
| 5.869 | 0.001 |
| 5.87 | 0.001 |
| 5.871 | 0.001 |
| 5.872 | 0 |
| 5.873 | 0 |
| 5.874 | 0 |
| 5.875 | 0 |
| 5.876 | 0 |
| 5.877 | 0 |
| 5.878 | 0 |
| 5.879 | 0 |
| 5.88 | 0 |
| 5.881 | 0 |
| 5.882 | 0 |
| 5.883 | 0 |
| 5.884 | 0 |
| 5.885 | 0 |
| 5.886 | 0 |
| 5.887 | 0 |
| 5.888 | 0 |
| 5.889 | 0 |
| 5.89 | 0 |
| 5.891 | 0 |
| 5.892 | 0 |
| 5.893 | 0 |
| 5.894 | 0 |
| 5.895 | 0 |
| 5.896 | 0 |
| 5.897 | 0 |
| 5.898 | 0 |
| 5.899 | 0 |
| 5.9 | 0 |
| 5.901 | 0 |
| 5.902 | 0 |
| 5.903 | 0 |
| 5.904 | 0 |
| 5.905 | 0 |
| 5.906 | 0 |
| 5.907 | 0 |
| 5.908 | 0 |
| 5.909 | 0 |
| 5.91 | 0 |
| 5.911 | 0 |
| 5.912 | 0 |
| 5.913 | 0 |
| 5.914 | 0 |
| 5.915 | 0 |
| 5.916 | 0 |
| 5.917 | 0 |
| 5.918 | 0 |
| 5.919 | 0 |
| 5.92 | 0 |
| 5.921 | 0 |
| 5.922 | 0 |
| 5.923 | 0 |
| 5.924 | 0 |
| 5.925 | 0 |
| 5.926 | 0 |
| 5.927 | 0 |
| 5.928 | 0 |
| 5.929 | 0 |
| 5.93 | 0 |
| 5.931 | 0 |
| 5.932 | 0 |
| 5.933 | 0 |
| 5.934 | 0 |
| 5.935 | 0 |
| 5.936 | 0 |
| 5.937 | 0 |
| 5.938 | 0 |
| 5.939 | 0 |
| 5.94 | 0 |
| 5.941 | 0 |
| 5.942 | 0 |
| 5.943 | 0 |
| 5.944 | 0 |
| 5.945 | 0 |
| 5.946 | 0 |
| 5.947 | 0 |
| 5.948 | 0 |
| 5.949 | 0 |
| 5.95 | 0 |
| 5.951 | 0 |
| 5.952 | 0 |
| 5.953 | 0 |
| 5.954 | 0 |
| 5.955 | 0 |
| 5.956 | 0 |
| 5.957 | 0 |
| 5.958 | 0 |
| 5.959 | 0 |
| 5.96 | 0 |
| 5.961 | 0 |
| 5.962 | 0 |
| 5.963 | 0 |
| 5.964 | 0 |
| 5.965 | 0 |
| 5.966 | 0 |
| 5.967 | 0 |
| 5.968 | 0 |
| 5.969 | 0 |
| 5.97 | 0 |
| 5.971 | 0 |
| 5.972 | 0 |
| 5.973 | 0 |
| 5.974 | 0 |
| 5.975 | 0 |
| 5.976 | 0 |
| 5.977 | 0 |
| 5.978 | 0 |
| 5.979 | 0 |
| 5.98 | 0 |
| 5.981 | 0 |
| 5.982 | 0 |
| 5.983 | 0 |
| 5.984 | 0 |
| 5.985 | 0 |
| 5.986 | 0 |
| 5.987 | 0 |
| 5.988 | 0 |
| 5.989 | 0 |
| 5.99 | 0 |
| 5.991 | 0 |
| 5.992 | 0 |
| 5.993 | 0 |
| 5.994 | 0 |
| 5.995 | 0 |
| 5.996 | 0 |
| 5.997 | 0 |
| 5.998 | 0 |
| 5.999 | 0 |
| 6.0 | 0 |
| 6.001 | 0 |
| 6.002 | 0 |
| 6.003 | 0 |
| 6.004 | 0 |
| 6.005 | 0 |
| 6.006 | 0 |
| 6.007 | 0 |
| 6.008 | 0 |
| 6.009 | 0 |
| 6.01 | 0 |
| 6.011 | 0 |
| 6.012 | 0 |
| 6.013 | 0 |
| 6.014 | 0 |
| 6.015 | 0 |
| 6.016 | 0 |
| 6.017 | 0 |
| 6.018 | 0 |
| 6.019 | 0 |
| 6.02 | 0 |
| 6.021 | 0 |
| 6.022 | 0 |
| 6.023 | 0 |
| 6.024 | 0 |
| 6.025 | 0 |
| 6.026 | 0 |
| 6.027 | 0 |
| 6.028 | 0 |
| 6.029 | 0 |
| 6.03 | 0 |
| 6.031 | 0 |
| 6.032 | 0 |
| 6.033 | 0 |
| 6.034 | 0 |
| 6.035 | 0 |
| 6.036 | 0 |
| 6.037 | 0 |
| 6.038 | 0 |
| 6.039 | 0 |
| 6.04 | 0 |
| 6.041 | 0 |
| 6.042 | 0 |
| 6.043 | 0 |
| 6.044 | 0 |
| 6.045 | 0 |
| 6.046 | 0 |
| 6.047 | 0 |
| 6.048 | 0 |
| 6.049 | 0 |
| 6.05 | 0 |
| 6.051 | 0 |
| 6.052 | 0 |
| 6.053 | 0 |
| 6.054 | 0 |
| 6.055 | 0 |
| 6.056 | 0 |
| 6.057 | 0 |
| 6.058 | 0 |
| 6.059 | 0 |
| 6.06 | 0 |
| 6.061 | 0 |
| 6.062 | 0 |
| 6.063 | 0 |
| 6.064 | 0 |
| 6.065 | 0 |
| 6.066 | 0 |
| 6.067 | 0 |
| 6.068 | 0 |
| 6.069 | 0 |
| 6.07 | 0 |
| 6.071 | 0 |
| 6.072 | 0 |
| 6.073 | 0 |
| 6.074 | 0 |
| 6.075 | 0 |
| 6.076 | 0 |
| 6.077 | 0 |
| 6.078 | 0 |
| 6.079 | 0 |
| 6.08 | 0 |
| 6.081 | 0 |
| 6.082 | 0 |
| 6.083 | 0 |
| 6.084 | 0 |
| 6.085 | 0 |
| 6.086 | 0 |
| 6.087 | 0 |
| 6.088 | 0 |
| 6.089 | 0 |
| 6.09 | 0 |
| 6.091 | 0 |
| 6.092 | 0 |
| 6.093 | 0 |
| 6.094 | 0 |
| 6.095 | 0 |
| 6.096 | 0 |
| 6.097 | 0 |
| 6.098 | 0 |
| 6.099 | 0 |
| 6.1 | 0 |
| 6.101 | 0 |
| 6.102 | 0 |
| 6.103 | 0 |
| 6.104 | 0 |
| 6.105 | 0 |
| 6.106 | 0 |
| 6.107 | 0 |
| 6.108 | 0 |
| 6.109 | 0 |
| 6.11 | 0 |
| 6.111 | 0 |
| 6.112 | 0 |
| 6.113 | 0 |
| 6.114 | 0 |
| 6.115 | 0 |
| 6.116 | 0 |
| 6.117 | 0 |
| 6.118 | 0 |
| 6.119 | 0 |
| 6.12 | 0 |
| 6.121 | 0 |
| 6.122 | 0 |
| 6.123 | 0 |
| 6.124 | 0 |
| 6.125 | 0 |
| 6.126 | 0 |
| 6.127 | 0 |
| 6.128 | 0 |
| 6.129 | 0 |
| 6.13 | 0 |
| 6.131 | 0 |
| 6.132 | 0 |
| 6.133 | 0 |
| 6.134 | 0 |
| 6.135 | 0 |
| 6.136 | 0 |
| 6.137 | 0 |
| 6.138 | 0 |
| 6.139 | 0 |
| 6.14 | 0 |
| 6.141 | 0 |
| 6.142 | 0 |
| 6.143 | 0 |
| 6.144 | 0 |
| 6.145 | 0 |
| 6.146 | 0 |
| 6.147 | 0 |
| 6.148 | 0 |
| 6.149 | 0 |
| 6.15 | 0 |
| 6.151 | 0 |
| 6.152 | 0 |
| 6.153 | 0 |
| 6.154 | 0 |
| 6.155 | 0 |
| 6.156 | 0 |
| 6.157 | 0 |
| 6.158 | 0 |
| 6.159 | 0 |
| 6.16 | 0 |
| 6.161 | 0 |
| 6.162 | 0 |
| 6.163 | 0 |
| 6.164 | 0 |
| 6.165 | 0 |
| 6.166 | 0 |
| 6.167 | 0 |
| 6.168 | 0 |
| 6.169 | 0 |
| 6.17 | 0 |
| 6.171 | 0 |
| 6.172 | 0 |
| 6.173 | 0 |
| 6.174 | 0 |
| 6.175 | 0 |
| 6.176 | 0 |
| 6.177 | 0 |
| 6.178 | 0 |
| 6.179 | 0 |
| 6.18 | 0 |
| 6.181 | 0 |
| 6.182 | 0 |
| 6.183 | 0 |
| 6.184 | 0 |
| 6.185 | 0 |
| 6.186 | 0 |
| 6.187 | 0 |
| 6.188 | 0 |
| 6.189 | 0 |
| 6.19 | 0 |
| 6.191 | 0 |
| 6.192 | 0 |
| 6.193 | 0 |
| 6.194 | 0 |
| 6.195 | 0 |
| 6.196 | 0 |
| 6.197 | 0 |
| 6.198 | 0 |
| 6.199 | 0 |
| 6.2 | 0 |
| 6.201 | 0 |
| 6.202 | 0 |
| 6.203 | 0 |
| 6.204 | 0 |
| 6.205 | 0 |
| 6.206 | 0 |
| 6.207 | 0 |
| 6.208 | 0 |
| 6.209 | 0 |
| 6.21 | 0 |
| 6.211 | 0 |
| 6.212 | 0 |
| 6.213 | 0 |
| 6.214 | 0 |
| 6.215 | 0 |
| 6.216 | 0 |
| 6.217 | 0 |
| 6.218 | 0 |
| 6.219 | 0 |
| 6.22 | 0 |
| 6.221 | 0 |
| 6.222 | 0 |
| 6.223 | 0 |
| 6.224 | 0 |
| 6.225 | 0 |
| 6.226 | 0 |
| 6.227 | 0 |
| 6.228 | 0 |
| 6.229 | 0 |
| 6.23 | 0 |
| 6.231 | 0 |
| 6.232 | 0 |
| 6.233 | 0 |
| 6.234 | 0 |
| 6.235 | 0 |
| 6.236 | 0 |
| 6.237 | 0 |
| 6.238 | 0 |
| 6.239 | 0 |
| 6.24 | 0 |
| 6.241 | 0 |
| 6.242 | 0 |
| 6.243 | 0 |
| 6.244 | 0 |
| 6.245 | 0 |
| 6.246 | 0 |
| 6.247 | 0 |
| 6.248 | 0 |
| 6.249 | 0 |
| 6.25 | 0 |
| 6.251 | 0 |
| 6.252 | 0 |
| 6.253 | 0 |
| 6.254 | 0 |
| 6.255 | 0 |
| 6.256 | 0 |
| 6.257 | 0.001 |
| 6.258 | 0.001 |
| 6.259 | 0.001 |
| 6.26 | 0.001 |
| 6.261 | 0.001 |
| 6.262 | 0.001 |
| 6.263 | 0.001 |
| 6.264 | 0.001 |
| 6.265 | 0.001 |
| 6.266 | 0.001 |
| 6.267 | 0.001 |
| 6.268 | 0.001 |
| 6.269 | 0.001 |
| 6.27 | 0.001 |
| 6.271 | 0.001 |
| 6.272 | 0.001 |
| 6.273 | 0.001 |
| 6.274 | 0.001 |
| 6.275 | 0.001 |
| 6.276 | 0.001 |
| 6.277 | 0.001 |
| 6.278 | 0.001 |
| 6.279 | 0.001 |
| 6.28 | 0.001 |
| 6.281 | 0.001 |
| 6.282 | 0.001 |
| 6.283 | 0.001 |
| 6.284 | 0.001 |
| 6.285 | 0.001 |
| 6.286 | 0.001 |
| 6.287 | 0.001 |
| 6.288 | 0.001 |
| 6.289 | 0.001 |
| 6.29 | 0.001 |
| 6.291 | 0.001 |
| 6.292 | 0.001 |
| 6.293 | 0.001 |
| 6.294 | 0.001 |
| 6.295 | 0.001 |
| 6.296 | 0.001 |
| 6.297 | 0.001 |
| 6.298 | 0.001 |
| 6.299 | 0.001 |
| 6.3 | 0.001 |
| 6.301 | 0.001 |
| 6.302 | 0.001 |
| 6.303 | 0.001 |
| 6.304 | 0.001 |
| 6.305 | 0.001 |
| 6.306 | 0.001 |
| 6.307 | 0.001 |
| 6.308 | 0.001 |
| 6.309 | 0.001 |
| 6.31 | 0.001 |
| 6.311 | 0.001 |
| 6.312 | 0.001 |
| 6.313 | 0.001 |
| 6.314 | 0.001 |
| 6.315 | 0.001 |
| 6.316 | 0.001 |
| 6.317 | 0.001 |
| 6.318 | 0.001 |
| 6.319 | 0.001 |
| 6.32 | 0.001 |
| 6.321 | 0.001 |
| 6.322 | 0.001 |
| 6.323 | 0.001 |
| 6.324 | 0.001 |
| 6.325 | 0.001 |
| 6.326 | 0.001 |
| 6.327 | 0.001 |
| 6.328 | 0.001 |
| 6.329 | 0.001 |
| 6.33 | 0.001 |
| 6.331 | 0.001 |
| 6.332 | 0.001 |
| 6.333 | 0.001 |
| 6.334 | 0.001 |
| 6.335 | 0.002 |
| 6.336 | 0.002 |
| 6.337 | 0.002 |
| 6.338 | 0.002 |
| 6.339 | 0.002 |
| 6.34 | 0.002 |
| 6.341 | 0.002 |
| 6.342 | 0.002 |
| 6.343 | 0.002 |
| 6.344 | 0.002 |
| 6.345 | 0.002 |
| 6.346 | 0.002 |
| 6.347 | 0.002 |
| 6.348 | 0.002 |
| 6.349 | 0.002 |
| 6.35 | 0.002 |
| 6.351 | 0.002 |
| 6.352 | 0.002 |
| 6.353 | 0.002 |
| 6.354 | 0.002 |
| 6.355 | 0.002 |
| 6.356 | 0.002 |
| 6.357 | 0.002 |
| 6.358 | 0.002 |
| 6.359 | 0.002 |
| 6.36 | 0.002 |
| 6.361 | 0.002 |
| 6.362 | 0.002 |
| 6.363 | 0.002 |
| 6.364 | 0.002 |
| 6.365 | 0.002 |
| 6.366 | 0.002 |
| 6.367 | 0.002 |
| 6.368 | 0.002 |
| 6.369 | 0.002 |
| 6.37 | 0.002 |
| 6.371 | 0.002 |
| 6.372 | 0.002 |
| 6.373 | 0.002 |
| 6.374 | 0.002 |
| 6.375 | 0.003 |
| 6.376 | 0.003 |
| 6.377 | 0.003 |
| 6.378 | 0.003 |
| 6.379 | 0.003 |
| 6.38 | 0.003 |
| 6.381 | 0.003 |
| 6.382 | 0.003 |
| 6.383 | 0.003 |
| 6.384 | 0.003 |
| 6.385 | 0.003 |
| 6.386 | 0.003 |
| 6.387 | 0.003 |
| 6.388 | 0.003 |
| 6.389 | 0.003 |
| 6.39 | 0.003 |
| 6.391 | 0.003 |
| 6.392 | 0.003 |
| 6.393 | 0.003 |
| 6.394 | 0.003 |
| 6.395 | 0.003 |
| 6.396 | 0.003 |
| 6.397 | 0.003 |
| 6.398 | 0.003 |
| 6.399 | 0.003 |
| 6.4 | 0.003 |
| 6.401 | 0.003 |
| 6.402 | 0.003 |
| 6.403 | 0.004 |
| 6.404 | 0.004 |
| 6.405 | 0.004 |
| 6.406 | 0.004 |
| 6.407 | 0.004 |
| 6.408 | 0.004 |
| 6.409 | 0.004 |
| 6.41 | 0.004 |
| 6.411 | 0.004 |
| 6.412 | 0.004 |
| 6.413 | 0.004 |
| 6.414 | 0.004 |
| 6.415 | 0.004 |
| 6.416 | 0.004 |
| 6.417 | 0.004 |
| 6.418 | 0.004 |
| 6.419 | 0.004 |
| 6.42 | 0.004 |
| 6.421 | 0.004 |
| 6.422 | 0.004 |
| 6.423 | 0.004 |
| 6.424 | 0.005 |
| 6.425 | 0.005 |
| 6.426 | 0.005 |
| 6.427 | 0.005 |
| 6.428 | 0.005 |
| 6.429 | 0.005 |
| 6.43 | 0.005 |
| 6.431 | 0.005 |
| 6.432 | 0.005 |
| 6.433 | 0.005 |
| 6.434 | 0.005 |
| 6.435 | 0.005 |
| 6.436 | 0.005 |
| 6.437 | 0.005 |
| 6.438 | 0.005 |
| 6.439 | 0.005 |
| 6.44 | 0.005 |
| 6.441 | 0.005 |
| 6.442 | 0.006 |
| 6.443 | 0.006 |
| 6.444 | 0.006 |
| 6.445 | 0.006 |
| 6.446 | 0.006 |
| 6.447 | 0.006 |
| 6.448 | 0.006 |
| 6.449 | 0.006 |
| 6.45 | 0.006 |
| 6.451 | 0.006 |
| 6.452 | 0.006 |
| 6.453 | 0.006 |
| 6.454 | 0.006 |
| 6.455 | 0.006 |
| 6.456 | 0.006 |
| 6.457 | 0.007 |
| 6.458 | 0.007 |
| 6.459 | 0.007 |
| 6.46 | 0.007 |
| 6.461 | 0.007 |
| 6.462 | 0.007 |
| 6.463 | 0.007 |
| 6.464 | 0.007 |
| 6.465 | 0.007 |
| 6.466 | 0.007 |
| 6.467 | 0.007 |
| 6.468 | 0.007 |
| 6.469 | 0.007 |
| 6.47 | 0.008 |
| 6.471 | 0.008 |
| 6.472 | 0.008 |
| 6.473 | 0.008 |
| 6.474 | 0.008 |
| 6.475 | 0.008 |
| 6.476 | 0.008 |
| 6.477 | 0.008 |
| 6.478 | 0.008 |
| 6.479 | 0.008 |
| 6.48 | 0.008 |
| 6.481 | 0.008 |
| 6.482 | 0.009 |
| 6.483 | 0.009 |
| 6.484 | 0.009 |
| 6.485 | 0.009 |
| 6.486 | 0.009 |
| 6.487 | 0.009 |
| 6.488 | 0.009 |
| 6.489 | 0.009 |
| 6.49 | 0.009 |
| 6.491 | 0.009 |
| 6.492 | 0.009 |
| 6.493 | 0.01 |
| 6.494 | 0.01 |
| 6.495 | 0.01 |
| 6.496 | 0.01 |
| 6.497 | 0.01 |
| 6.498 | 0.01 |
| 6.499 | 0.01 |
| 6.5 | 0.01 |
| 6.501 | 0.01 |
| 6.502 | 0.01 |
| 6.503 | 0.011 |
| 6.504 | 0.011 |
| 6.505 | 0.011 |
| 6.506 | 0.011 |
| 6.507 | 0.011 |
| 6.508 | 0.011 |
| 6.509 | 0.011 |
| 6.51 | 0.011 |
| 6.511 | 0.011 |
| 6.512 | 0.012 |
| 6.513 | 0.012 |
| 6.514 | 0.012 |
| 6.515 | 0.012 |
| 6.516 | 0.012 |
| 6.517 | 0.012 |
| 6.518 | 0.012 |
| 6.519 | 0.012 |
| 6.52 | 0.012 |
| 6.521 | 0.013 |
| 6.522 | 0.013 |
| 6.523 | 0.013 |
| 6.524 | 0.013 |
| 6.525 | 0.013 |
| 6.526 | 0.013 |
| 6.527 | 0.013 |
| 6.528 | 0.013 |
| 6.529 | 0.014 |
| 6.53 | 0.014 |
| 6.531 | 0.014 |
| 6.532 | 0.014 |
| 6.533 | 0.014 |
| 6.534 | 0.014 |
| 6.535 | 0.014 |
| 6.536 | 0.015 |
| 6.537 | 0.015 |
| 6.538 | 0.015 |
| 6.539 | 0.015 |
| 6.54 | 0.015 |
| 6.541 | 0.015 |
| 6.542 | 0.015 |
| 6.543 | 0.015 |
| 6.544 | 0.016 |
| 6.545 | 0.016 |
| 6.546 | 0.016 |
| 6.547 | 0.016 |
| 6.548 | 0.016 |
| 6.549 | 0.016 |
| 6.55 | 0.016 |
| 6.551 | 0.017 |
| 6.552 | 0.017 |
| 6.553 | 0.017 |
| 6.554 | 0.017 |
| 6.555 | 0.017 |
| 6.556 | 0.017 |
| 6.557 | 0.018 |
| 6.558 | 0.018 |
| 6.559 | 0.018 |
| 6.56 | 0.018 |
| 6.561 | 0.018 |
| 6.562 | 0.018 |
| 6.563 | 0.019 |
| 6.564 | 0.019 |
| 6.565 | 0.019 |
| 6.566 | 0.019 |
| 6.567 | 0.019 |
| 6.568 | 0.019 |
| 6.569 | 0.02 |
| 6.57 | 0.02 |
| 6.571 | 0.02 |
| 6.572 | 0.02 |
| 6.573 | 0.02 |
| 6.574 | 0.02 |
| 6.575 | 0.021 |
| 6.576 | 0.021 |
| 6.577 | 0.021 |
| 6.578 | 0.021 |
| 6.579 | 0.021 |
| 6.58 | 0.021 |
| 6.581 | 0.022 |
| 6.582 | 0.022 |
| 6.583 | 0.022 |
| 6.584 | 0.022 |
| 6.585 | 0.022 |
| 6.586 | 0.023 |
| 6.587 | 0.023 |
| 6.588 | 0.023 |
| 6.589 | 0.023 |
| 6.59 | 0.023 |
| 6.591 | 0.023 |
| 6.592 | 0.024 |
| 6.593 | 0.024 |
| 6.594 | 0.024 |
| 6.595 | 0.024 |
| 6.596 | 0.024 |
| 6.597 | 0.025 |
| 6.598 | 0.025 |
| 6.599 | 0.025 |
| 6.6 | 0.025 |
| 6.601 | 0.025 |
| 6.602 | 0.026 |
| 6.603 | 0.026 |
| 6.604 | 0.026 |
| 6.605 | 0.026 |
| 6.606 | 0.026 |
| 6.607 | 0.027 |
| 6.608 | 0.027 |
| 6.609 | 0.027 |
| 6.61 | 0.027 |
| 6.611 | 0.028 |
| 6.612 | 0.028 |
| 6.613 | 0.028 |
| 6.614 | 0.028 |
| 6.615 | 0.028 |
| 6.616 | 0.029 |
| 6.617 | 0.029 |
| 6.618 | 0.029 |
| 6.619 | 0.029 |
| 6.62 | 0.029 |
| 6.621 | 0.03 |
| 6.622 | 0.03 |
| 6.623 | 0.03 |
| 6.624 | 0.03 |
| 6.625 | 0.031 |
| 6.626 | 0.031 |
| 6.627 | 0.031 |
| 6.628 | 0.031 |
| 6.628999999999999 | 0.032 |
| 6.63 | 0.032 |
| 6.631 | 0.032 |
| 6.632 | 0.032 |
| 6.633 | 0.033 |
| 6.634 | 0.033 |
| 6.635 | 0.033 |
| 6.636 | 0.033 |
| 6.636999999999999 | 0.033 |
| 6.638 | 0.034 |
| 6.639 | 0.034 |
| 6.64 | 0.034 |
| 6.641 | 0.034 |
| 6.642 | 0.035 |
| 6.643 | 0.035 |
| 6.644 | 0.035 |
| 6.644999999999999 | 0.035 |
| 6.646 | 0.036 |
| 6.647 | 0.036 |
| 6.648 | 0.036 |
| 6.649 | 0.036 |
| 6.65 | 0.037 |
| 6.651 | 0.037 |
| 6.652 | 0.037 |
| 6.652999999999999 | 0.037 |
| 6.654 | 0.038 |
| 6.655 | 0.038 |
| 6.656 | 0.038 |
| 6.657 | 0.039 |
| 6.658 | 0.039 |
| 6.659 | 0.039 |
| 6.66 | 0.039 |
| 6.660999999999999 | 0.04 |
| 6.662 | 0.04 |
| 6.663 | 0.04 |
| 6.664 | 0.04 |
| 6.665 | 0.041 |
| 6.666 | 0.041 |
| 6.667 | 0.041 |
| 6.668 | 0.042 |
| 6.668999999999999 | 0.042 |
| 6.67 | 0.042 |
| 6.671 | 0.042 |
| 6.672 | 0.043 |
| 6.673 | 0.043 |
| 6.674 | 0.043 |
| 6.675 | 0.043 |
| 6.676 | 0.044 |
| 6.677 | 0.044 |
| 6.678 | 0.044 |
| 6.679 | 0.045 |
| 6.68 | 0.045 |
| 6.681 | 0.045 |
| 6.682 | 0.045 |
| 6.683 | 0.046 |
| 6.684 | 0.046 |
| 6.685 | 0.046 |
| 6.686 | 0.047 |
| 6.687 | 0.047 |
| 6.688 | 0.047 |
| 6.689 | 0.048 |
| 6.69 | 0.048 |
| 6.691 | 0.048 |
| 6.692 | 0.048 |
| 6.693 | 0.049 |
| 6.694 | 0.049 |
| 6.695 | 0.049 |
| 6.696 | 0.05 |
| 6.697 | 0.05 |
| 6.698 | 0.05 |
| 6.699 | 0.051 |
| 6.7 | 0.051 |
| 6.701 | 0.051 |
| 6.702 | 0.051 |
| 6.703 | 0.052 |
| 6.704 | 0.052 |
| 6.705 | 0.052 |
| 6.706 | 0.053 |
| 6.707 | 0.053 |
| 6.708 | 0.053 |
| 6.709 | 0.054 |
| 6.71 | 0.054 |
| 6.711 | 0.054 |
| 6.712 | 0.055 |
| 6.713 | 0.055 |
| 6.714 | 0.055 |
| 6.715 | 0.055 |
| 6.716 | 0.056 |
| 6.717 | 0.056 |
| 6.718 | 0.056 |
| 6.719 | 0.057 |
| 6.72 | 0.057 |
| 6.721 | 0.057 |
| 6.722 | 0.058 |
| 6.723 | 0.058 |
| 6.724 | 0.058 |
| 6.725 | 0.059 |
| 6.726 | 0.059 |
| 6.727 | 0.059 |
| 6.728 | 0.06 |
| 6.729 | 0.06 |
| 6.73 | 0.06 |
| 6.731 | 0.061 |
| 6.732 | 0.061 |
| 6.733 | 0.061 |
| 6.734 | 0.062 |
| 6.735 | 0.062 |
| 6.736 | 0.062 |
| 6.737 | 0.063 |
| 6.738 | 0.063 |
| 6.739 | 0.063 |
| 6.74 | 0.064 |
| 6.741 | 0.064 |
| 6.742 | 0.064 |
| 6.743 | 0.065 |
| 6.744 | 0.065 |
| 6.745 | 0.065 |
| 6.746 | 0.066 |
| 6.747 | 0.066 |
| 6.748 | 0.066 |
| 6.749 | 0.067 |
| 6.75 | 0.067 |
| 6.751 | 0.067 |
| 6.752 | 0.068 |
| 6.753 | 0.068 |
| 6.753999999999999 | 0.068 |
| 6.755 | 0.069 |
| 6.756 | 0.069 |
| 6.757 | 0.069 |
| 6.758 | 0.07 |
| 6.759 | 0.07 |
| 6.76 | 0.07 |
| 6.761 | 0.071 |
| 6.761999999999999 | 0.071 |
| 6.763 | 0.071 |
| 6.764 | 0.072 |
| 6.765 | 0.072 |
| 6.766 | 0.072 |
| 6.767 | 0.073 |
| 6.768 | 0.073 |
| 6.769 | 0.073 |
| 6.769999999999999 | 0.074 |
| 6.771 | 0.074 |
| 6.772 | 0.074 |
| 6.773 | 0.075 |
| 6.774 | 0.075 |
| 6.775 | 0.075 |
| 6.776 | 0.076 |
| 6.777 | 0.076 |
| 6.778 | 0.076 |
| 6.779 | 0.077 |
| 6.78 | 0.077 |
| 6.781 | 0.077 |
| 6.782 | 0.078 |
| 6.783 | 0.078 |
| 6.784 | 0.078 |
| 6.785 | 0.079 |
| 6.786 | 0.079 |
| 6.787 | 0.079 |
| 6.788 | 0.08 |
| 6.789 | 0.08 |
| 6.79 | 0.08 |
| 6.791 | 0.081 |
| 6.792 | 0.081 |
| 6.793 | 0.081 |
| 6.794 | 0.082 |
| 6.795 | 0.082 |
| 6.796 | 0.082 |
| 6.797 | 0.083 |
| 6.798 | 0.083 |
| 6.799 | 0.083 |
| 6.8 | 0.084 |
| 6.801 | 0.084 |
| 6.802 | 0.084 |
| 6.803 | 0.085 |
| 6.804 | 0.085 |
| 6.805 | 0.085 |
| 6.806 | 0.086 |
| 6.807 | 0.086 |
| 6.808 | 0.086 |
| 6.809 | 0.087 |
| 6.81 | 0.087 |
| 6.811 | 0.087 |
| 6.812 | 0.088 |
| 6.813 | 0.088 |
| 6.814 | 0.088 |
| 6.815 | 0.089 |
| 6.816 | 0.089 |
| 6.817 | 0.089 |
| 6.818 | 0.09 |
| 6.819 | 0.09 |
| 6.82 | 0.09 |
| 6.821 | 0.091 |
| 6.822 | 0.091 |
| 6.823 | 0.091 |
| 6.824 | 0.092 |
| 6.825 | 0.092 |
| 6.826 | 0.092 |
| 6.827 | 0.093 |
| 6.828 | 0.093 |
| 6.829 | 0.093 |
| 6.83 | 0.094 |
| 6.831 | 0.094 |
| 6.832 | 0.094 |
| 6.833 | 0.095 |
| 6.834 | 0.095 |
| 6.835 | 0.095 |
| 6.836 | 0.096 |
| 6.837 | 0.096 |
| 6.838 | 0.096 |
| 6.839 | 0.096 |
| 6.84 | 0.097 |
| 6.841 | 0.097 |
| 6.842 | 0.097 |
| 6.843 | 0.098 |
| 6.844 | 0.098 |
| 6.845 | 0.098 |
| 6.846 | 0.099 |
| 6.847 | 0.099 |
| 6.848 | 0.099 |
| 6.849 | 0.1 |
| 6.85 | 0.1 |
| 6.851 | 0.1 |
| 6.852 | 0.1 |
| 6.853 | 0.101 |
| 6.854 | 0.101 |
| 6.855 | 0.101 |
| 6.856 | 0.102 |
| 6.857 | 0.102 |
| 6.858 | 0.102 |
| 6.859 | 0.102 |
| 6.86 | 0.103 |
| 6.861 | 0.103 |
| 6.862 | 0.103 |
| 6.863 | 0.104 |
| 6.864 | 0.104 |
| 6.865 | 0.104 |
| 6.866 | 0.104 |
| 6.867 | 0.105 |
| 6.868 | 0.105 |
| 6.869 | 0.105 |
| 6.87 | 0.106 |
| 6.871 | 0.106 |
| 6.872 | 0.106 |
| 6.873 | 0.106 |
| 6.874 | 0.107 |
| 6.875 | 0.107 |
| 6.876 | 0.107 |
| 6.877 | 0.107 |
| 6.878 | 0.108 |
| 6.879 | 0.108 |
| 6.88 | 0.108 |
| 6.881 | 0.108 |
| 6.882 | 0.109 |
| 6.883 | 0.109 |
| 6.884 | 0.109 |
| 6.885 | 0.11 |
| 6.886 | 0.11 |
| 6.887 | 0.11 |
| 6.888 | 0.11 |
| 6.889 | 0.111 |
| 6.89 | 0.111 |
| 6.891 | 0.111 |
| 6.892 | 0.111 |
| 6.893 | 0.111 |
| 6.894 | 0.112 |
| 6.895 | 0.112 |
| 6.896 | 0.112 |
| 6.897 | 0.112 |
| 6.898 | 0.113 |
| 6.899 | 0.113 |
| 6.9 | 0.113 |
| 6.901 | 0.113 |
| 6.902 | 0.114 |
| 6.903 | 0.114 |
| 6.904 | 0.114 |
| 6.905 | 0.114 |
| 6.906 | 0.114 |
| 6.907 | 0.115 |
| 6.908 | 0.115 |
| 6.909 | 0.115 |
| 6.91 | 0.115 |
| 6.911 | 0.115 |
| 6.912 | 0.116 |
| 6.913 | 0.116 |
| 6.914 | 0.116 |
| 6.915 | 0.116 |
| 6.916 | 0.116 |
| 6.917 | 0.117 |
| 6.918 | 0.117 |
| 6.919 | 0.117 |
| 6.92 | 0.117 |
| 6.921 | 0.117 |
| 6.922 | 0.118 |
| 6.923 | 0.118 |
| 6.924 | 0.118 |
| 6.925 | 0.118 |
| 6.926 | 0.118 |
| 6.927 | 0.119 |
| 6.928 | 0.119 |
| 6.929 | 0.119 |
| 6.93 | 0.119 |
| 6.931 | 0.119 |
| 6.932 | 0.119 |
| 6.933 | 0.12 |
| 6.934 | 0.12 |
| 6.935 | 0.12 |
| 6.936 | 0.12 |
| 6.937 | 0.12 |
| 6.938 | 0.12 |
| 6.939 | 0.12 |
| 6.94 | 0.121 |
| 6.941 | 0.121 |
| 6.942 | 0.121 |
| 6.943 | 0.121 |
| 6.944 | 0.121 |
| 6.945 | 0.121 |
| 6.946 | 0.121 |
| 6.947 | 0.122 |
| 6.948 | 0.122 |
| 6.949 | 0.122 |
| 6.95 | 0.122 |
| 6.951 | 0.122 |
| 6.952 | 0.122 |
| 6.953 | 0.122 |
| 6.954 | 0.122 |
| 6.955 | 0.122 |
| 6.956 | 0.123 |
| 6.957 | 0.123 |
| 6.958 | 0.123 |
| 6.959 | 0.123 |
| 6.96 | 0.123 |
| 6.961 | 0.123 |
| 6.962 | 0.123 |
| 6.963 | 0.123 |
| 6.964 | 0.123 |
| 6.965 | 0.123 |
| 6.966 | 0.124 |
| 6.967 | 0.124 |
| 6.968 | 0.124 |
| 6.969 | 0.124 |
| 6.97 | 0.124 |
| 6.971 | 0.124 |
| 6.972 | 0.124 |
| 6.973 | 0.124 |
| 6.974 | 0.124 |
| 6.975 | 0.124 |
| 6.976 | 0.124 |
| 6.977 | 0.124 |
| 6.978 | 0.124 |
| 6.979 | 0.124 |
| 6.98 | 0.125 |
| 6.981 | 0.125 |
| 6.982 | 0.125 |
| 6.983 | 0.125 |
| 6.984 | 0.125 |
| 6.985 | 0.125 |
| 6.986 | 0.125 |
| 6.987 | 0.125 |
| 6.988 | 0.125 |
| 6.989 | 0.125 |
| 6.99 | 0.125 |
| 6.991 | 0.125 |
| 6.992 | 0.125 |
| 6.993 | 0.125 |
| 6.994 | 0.125 |
| 6.995 | 0.125 |
| 6.996 | 0.125 |
| 6.997 | 0.125 |
| 6.998 | 0.125 |
| 6.999 | 0.125 |
| 7.0 | 0.125 |
| 7.001 | 0.125 |
| 7.002 | 0.125 |
| 7.003 | 0.125 |
| 7.004 | 0.125 |
| 7.005 | 0.125 |
| 7.006 | 0.125 |
| 7.007 | 0.125 |
| 7.008 | 0.125 |
| 7.009 | 0.125 |
| 7.01 | 0.125 |
| 7.011 | 0.125 |
| 7.012 | 0.125 |
| 7.013 | 0.125 |
| 7.014 | 0.125 |
| 7.015 | 0.125 |
| 7.016 | 0.125 |
| 7.017 | 0.125 |
| 7.018 | 0.125 |
| 7.019 | 0.125 |
| 7.02 | 0.125 |
| 7.021 | 0.124 |
| 7.022 | 0.124 |
| 7.023 | 0.124 |
| 7.024 | 0.124 |
| 7.025 | 0.124 |
| 7.026 | 0.124 |
| 7.027 | 0.124 |
| 7.028 | 0.124 |
| 7.029 | 0.124 |
| 7.03 | 0.124 |
| 7.031 | 0.124 |
| 7.032 | 0.124 |
| 7.033 | 0.124 |
| 7.034 | 0.124 |
| 7.035 | 0.123 |
| 7.036 | 0.123 |
| 7.037 | 0.123 |
| 7.038 | 0.123 |
| 7.039 | 0.123 |
| 7.04 | 0.123 |
| 7.041 | 0.123 |
| 7.042 | 0.123 |
| 7.043 | 0.123 |
| 7.044 | 0.123 |
| 7.045 | 0.122 |
| 7.046 | 0.122 |
| 7.047 | 0.122 |
| 7.048 | 0.122 |
| 7.049 | 0.122 |
| 7.05 | 0.122 |
| 7.051 | 0.122 |
| 7.052 | 0.122 |
| 7.053 | 0.122 |
| 7.054 | 0.121 |
| 7.055 | 0.121 |
| 7.056 | 0.121 |
| 7.057 | 0.121 |
| 7.058 | 0.121 |
| 7.059 | 0.121 |
| 7.06 | 0.121 |
| 7.061 | 0.12 |
| 7.062 | 0.12 |
| 7.063 | 0.12 |
| 7.064 | 0.12 |
| 7.065 | 0.12 |
| 7.066 | 0.12 |
| 7.067 | 0.12 |
| 7.068 | 0.119 |
| 7.069 | 0.119 |
| 7.07 | 0.119 |
| 7.071 | 0.119 |
| 7.072 | 0.119 |
| 7.073 | 0.119 |
| 7.074 | 0.118 |
| 7.075 | 0.118 |
| 7.076 | 0.118 |
| 7.077 | 0.118 |
| 7.078 | 0.118 |
| 7.079 | 0.117 |
| 7.08 | 0.117 |
| 7.081 | 0.117 |
| 7.082 | 0.117 |
| 7.083 | 0.117 |
| 7.084 | 0.116 |
| 7.085 | 0.116 |
| 7.086 | 0.116 |
| 7.087 | 0.116 |
| 7.088 | 0.116 |
| 7.089 | 0.115 |
| 7.09 | 0.115 |
| 7.091 | 0.115 |
| 7.092 | 0.115 |
| 7.093 | 0.115 |
| 7.094 | 0.114 |
| 7.095 | 0.114 |
| 7.096 | 0.114 |
| 7.097 | 0.114 |
| 7.098 | 0.114 |
| 7.099 | 0.113 |
| 7.1 | 0.113 |
| 7.101 | 0.113 |
| 7.102 | 0.113 |
| 7.103 | 0.112 |
| 7.104 | 0.112 |
| 7.105 | 0.112 |
| 7.106 | 0.112 |
| 7.107 | 0.111 |
| 7.108 | 0.111 |
| 7.109 | 0.111 |
| 7.11 | 0.111 |
| 7.111 | 0.111 |
| 7.112 | 0.11 |
| 7.113 | 0.11 |
| 7.114 | 0.11 |
| 7.115 | 0.11 |
| 7.116 | 0.109 |
| 7.117 | 0.109 |
| 7.118 | 0.109 |
| 7.119 | 0.108 |
| 7.12 | 0.108 |
| 7.121 | 0.108 |
| 7.122 | 0.108 |
| 7.123 | 0.107 |
| 7.124 | 0.107 |
| 7.125 | 0.107 |
| 7.126 | 0.107 |
| 7.127 | 0.106 |
| 7.128 | 0.106 |
| 7.129 | 0.106 |
| 7.13 | 0.106 |
| 7.131 | 0.105 |
| 7.132 | 0.105 |
| 7.133 | 0.105 |
| 7.134 | 0.104 |
| 7.135 | 0.104 |
| 7.136 | 0.104 |
| 7.137 | 0.104 |
| 7.138 | 0.103 |
| 7.139 | 0.103 |
| 7.14 | 0.103 |
| 7.141 | 0.102 |
| 7.142 | 0.102 |
| 7.143 | 0.102 |
| 7.144 | 0.102 |
| 7.145 | 0.101 |
| 7.146 | 0.101 |
| 7.147 | 0.101 |
| 7.148 | 0.1 |
| 7.149 | 0.1 |
| 7.15 | 0.1 |
| 7.151 | 0.1 |
| 7.152 | 0.099 |
| 7.153 | 0.099 |
| 7.154 | 0.099 |
| 7.155 | 0.098 |
| 7.156 | 0.098 |
| 7.157 | 0.098 |
| 7.158 | 0.097 |
| 7.159 | 0.097 |
| 7.16 | 0.097 |
| 7.161 | 0.096 |
| 7.162 | 0.096 |
| 7.163 | 0.096 |
| 7.164 | 0.096 |
| 7.165 | 0.095 |
| 7.166 | 0.095 |
| 7.167 | 0.095 |
| 7.168 | 0.094 |
| 7.169 | 0.094 |
| 7.17 | 0.094 |
| 7.171 | 0.093 |
| 7.172 | 0.093 |
| 7.173 | 0.093 |
| 7.174 | 0.092 |
| 7.175 | 0.092 |
| 7.176 | 0.092 |
| 7.177 | 0.091 |
| 7.178 | 0.091 |
| 7.179 | 0.091 |
| 7.18 | 0.09 |
| 7.181 | 0.09 |
| 7.182 | 0.09 |
| 7.183 | 0.089 |
| 7.184 | 0.089 |
| 7.185 | 0.089 |
| 7.186 | 0.088 |
| 7.187 | 0.088 |
| 7.188 | 0.088 |
| 7.189 | 0.087 |
| 7.19 | 0.087 |
| 7.191 | 0.087 |
| 7.192 | 0.086 |
| 7.193 | 0.086 |
| 7.194 | 0.086 |
| 7.195 | 0.085 |
| 7.196 | 0.085 |
| 7.197 | 0.085 |
| 7.198 | 0.084 |
| 7.199 | 0.084 |
| 7.2 | 0.084 |
| 7.201 | 0.083 |
| 7.202 | 0.083 |
| 7.203 | 0.083 |
| 7.204 | 0.082 |
| 7.205 | 0.082 |
| 7.206 | 0.082 |
| 7.207 | 0.081 |
| 7.208 | 0.081 |
| 7.209 | 0.081 |
| 7.21 | 0.08 |
| 7.211 | 0.08 |
| 7.212 | 0.08 |
| 7.213 | 0.079 |
| 7.214 | 0.079 |
| 7.215 | 0.079 |
| 7.216 | 0.078 |
| 7.217 | 0.078 |
| 7.218 | 0.078 |
| 7.219 | 0.077 |
| 7.22 | 0.077 |
| 7.221 | 0.077 |
| 7.222 | 0.076 |
| 7.223 | 0.076 |
| 7.224 | 0.076 |
| 7.225 | 0.075 |
| 7.226 | 0.075 |
| 7.227 | 0.075 |
| 7.228 | 0.074 |
| 7.229 | 0.074 |
| 7.23 | 0.074 |
| 7.231 | 0.073 |
| 7.232 | 0.073 |
| 7.233 | 0.073 |
| 7.234 | 0.072 |
| 7.235 | 0.072 |
| 7.236 | 0.072 |
| 7.237 | 0.071 |
| 7.238 | 0.071 |
| 7.239 | 0.071 |
| 7.24 | 0.07 |
| 7.241 | 0.07 |
| 7.242 | 0.07 |
| 7.243 | 0.069 |
| 7.244 | 0.069 |
| 7.245 | 0.069 |
| 7.246 | 0.068 |
| 7.247 | 0.068 |
| 7.248 | 0.068 |
| 7.249 | 0.067 |
| 7.25 | 0.067 |
| 7.251 | 0.067 |
| 7.252 | 0.066 |
| 7.253 | 0.066 |
| 7.254 | 0.066 |
| 7.255 | 0.065 |
| 7.256 | 0.065 |
| 7.257 | 0.065 |
| 7.258 | 0.064 |
| 7.259 | 0.064 |
| 7.26 | 0.064 |
| 7.261 | 0.063 |
| 7.262 | 0.063 |
| 7.263 | 0.063 |
| 7.264 | 0.062 |
| 7.265 | 0.062 |
| 7.266 | 0.062 |
| 7.267 | 0.061 |
| 7.268 | 0.061 |
| 7.269 | 0.061 |
| 7.27 | 0.06 |
| 7.271 | 0.06 |
| 7.272 | 0.06 |
| 7.273 | 0.059 |
| 7.274 | 0.059 |
| 7.275 | 0.059 |
| 7.276 | 0.058 |
| 7.277 | 0.058 |
| 7.278 | 0.058 |
| 7.279 | 0.057 |
| 7.28 | 0.057 |
| 7.281 | 0.057 |
| 7.282 | 0.056 |
| 7.283 | 0.056 |
| 7.284 | 0.056 |
| 7.285 | 0.055 |
| 7.286 | 0.055 |
| 7.287 | 0.055 |
| 7.288 | 0.055 |
| 7.289 | 0.054 |
| 7.29 | 0.054 |
| 7.291 | 0.054 |
| 7.292 | 0.053 |
| 7.293 | 0.053 |
| 7.294 | 0.053 |
| 7.295 | 0.052 |
| 7.296 | 0.052 |
| 7.297 | 0.052 |
| 7.298 | 0.051 |
| 7.299 | 0.051 |
| 7.3 | 0.051 |
| 7.301 | 0.051 |
| 7.302 | 0.05 |
| 7.303 | 0.05 |
| 7.304 | 0.05 |
| 7.305 | 0.049 |
| 7.306 | 0.049 |
| 7.307 | 0.049 |
| 7.308 | 0.048 |
| 7.309 | 0.048 |
| 7.31 | 0.048 |
| 7.311 | 0.048 |
| 7.312 | 0.047 |
| 7.313 | 0.047 |
| 7.314 | 0.047 |
| 7.315 | 0.046 |
| 7.316 | 0.046 |
| 7.317 | 0.046 |
| 7.318 | 0.045 |
| 7.319 | 0.045 |
| 7.32 | 0.045 |
| 7.321 | 0.045 |
| 7.322 | 0.044 |
| 7.323 | 0.044 |
| 7.324 | 0.044 |
| 7.325 | 0.043 |
| 7.326 | 0.043 |
| 7.327 | 0.043 |
| 7.328 | 0.043 |
| 7.329 | 0.042 |
| 7.33 | 0.042 |
| 7.331 | 0.042 |
| 7.332 | 0.042 |
| 7.333 | 0.041 |
| 7.334 | 0.041 |
| 7.335 | 0.041 |
| 7.336 | 0.04 |
| 7.337 | 0.04 |
| 7.338 | 0.04 |
| 7.339 | 0.04 |
| 7.34 | 0.039 |
| 7.341 | 0.039 |
| 7.342 | 0.039 |
| 7.343 | 0.039 |
| 7.344 | 0.038 |
| 7.345 | 0.038 |
| 7.346 | 0.038 |
| 7.347 | 0.037 |
| 7.348 | 0.037 |
| 7.349 | 0.037 |
| 7.35 | 0.037 |
| 7.351 | 0.036 |
| 7.352 | 0.036 |
| 7.353 | 0.036 |
| 7.354 | 0.036 |
| 7.355 | 0.035 |
| 7.356 | 0.035 |
| 7.357 | 0.035 |
| 7.358 | 0.035 |
| 7.359 | 0.034 |
| 7.36 | 0.034 |
| 7.361 | 0.034 |
| 7.362 | 0.034 |
| 7.363 | 0.033 |
| 7.364 | 0.033 |
| 7.365 | 0.033 |
| 7.366 | 0.033 |
| 7.367 | 0.033 |
| 7.368 | 0.032 |
| 7.369 | 0.032 |
| 7.37 | 0.032 |
| 7.371 | 0.032 |
| 7.372 | 0.031 |
| 7.373 | 0.031 |
| 7.374 | 0.031 |
| 7.375 | 0.031 |
| 7.376 | 0.03 |
| 7.377 | 0.03 |
| 7.378 | 0.03 |
| 7.379 | 0.03 |
| 7.38 | 0.029 |
| 7.381 | 0.029 |
| 7.382 | 0.029 |
| 7.383 | 0.029 |
| 7.384 | 0.029 |
| 7.385 | 0.028 |
| 7.386 | 0.028 |
| 7.387 | 0.028 |
| 7.388 | 0.028 |
| 7.389 | 0.028 |
| 7.39 | 0.027 |
| 7.391 | 0.027 |
| 7.392 | 0.027 |
| 7.393 | 0.027 |
| 7.394 | 0.026 |
| 7.395 | 0.026 |
| 7.396 | 0.026 |
| 7.397 | 0.026 |
| 7.398 | 0.026 |
| 7.399 | 0.025 |
| 7.4 | 0.025 |
| 7.401 | 0.025 |
| 7.402 | 0.025 |
| 7.403 | 0.025 |
| 7.404 | 0.024 |
| 7.405 | 0.024 |
| 7.406 | 0.024 |
| 7.407 | 0.024 |
| 7.408 | 0.024 |
| 7.409 | 0.023 |
| 7.41 | 0.023 |
| 7.411 | 0.023 |
| 7.412 | 0.023 |
| 7.413 | 0.023 |
| 7.414 | 0.023 |
| 7.415 | 0.022 |
| 7.416 | 0.022 |
| 7.417 | 0.022 |
| 7.418 | 0.022 |
| 7.419 | 0.022 |
| 7.42 | 0.021 |
| 7.421 | 0.021 |
| 7.422 | 0.021 |
| 7.423 | 0.021 |
| 7.424 | 0.021 |
| 7.425 | 0.021 |
| 7.426 | 0.02 |
| 7.427 | 0.02 |
| 7.428 | 0.02 |
| 7.429 | 0.02 |
| 7.43 | 0.02 |
| 7.431 | 0.02 |
| 7.432 | 0.019 |
| 7.433 | 0.019 |
| 7.434 | 0.019 |
| 7.435 | 0.019 |
| 7.436 | 0.019 |
| 7.437 | 0.019 |
| 7.438 | 0.018 |
| 7.439 | 0.018 |
| 7.44 | 0.018 |
| 7.441 | 0.018 |
| 7.442 | 0.018 |
| 7.443 | 0.018 |
| 7.444 | 0.017 |
| 7.445 | 0.017 |
| 7.446 | 0.017 |
| 7.447 | 0.017 |
| 7.448 | 0.017 |
| 7.449 | 0.017 |
| 7.45 | 0.016 |
| 7.451 | 0.016 |
| 7.452 | 0.016 |
| 7.453 | 0.016 |
| 7.454 | 0.016 |
| 7.455 | 0.016 |
| 7.456 | 0.016 |
| 7.457 | 0.015 |
| 7.458 | 0.015 |
| 7.459 | 0.015 |
| 7.46 | 0.015 |
| 7.461 | 0.015 |
| 7.462 | 0.015 |
| 7.463 | 0.015 |
| 7.464 | 0.015 |
| 7.465 | 0.014 |
| 7.466 | 0.014 |
| 7.467 | 0.014 |
| 7.468 | 0.014 |
| 7.469 | 0.014 |
| 7.47 | 0.014 |
| 7.471 | 0.014 |
| 7.472 | 0.013 |
| 7.473 | 0.013 |
| 7.474 | 0.013 |
| 7.475 | 0.013 |
| 7.476 | 0.013 |
| 7.477 | 0.013 |
| 7.478 | 0.013 |
| 7.479 | 0.013 |
| 7.48 | 0.012 |
| 7.481 | 0.012 |
| 7.482 | 0.012 |
| 7.483 | 0.012 |
| 7.484 | 0.012 |
| 7.485 | 0.012 |
| 7.486 | 0.012 |
| 7.487 | 0.012 |
| 7.488 | 0.012 |
| 7.489 | 0.011 |
| 7.49 | 0.011 |
| 7.491 | 0.011 |
| 7.492 | 0.011 |
| 7.493 | 0.011 |
| 7.494 | 0.011 |
| 7.495 | 0.011 |
| 7.496 | 0.011 |
| 7.497 | 0.011 |
| 7.498 | 0.01 |
| 7.499 | 0.01 |
| 7.5 | 0.01 |
| 7.501 | 0.01 |
| 7.502 | 0.01 |
| 7.503 | 0.01 |
| 7.504 | 0.01 |
| 7.505 | 0.01 |
| 7.506 | 0.01 |
| 7.507 | 0.01 |
| 7.508 | 0.009 |
| 7.509 | 0.009 |
| 7.51 | 0.009 |
| 7.511 | 0.009 |
| 7.512 | 0.009 |
| 7.513 | 0.009 |
| 7.514 | 0.009 |
| 7.515 | 0.009 |
| 7.516 | 0.009 |
| 7.517 | 0.009 |
| 7.518 | 0.009 |
| 7.519 | 0.008 |
| 7.52 | 0.008 |
| 7.521 | 0.008 |
| 7.522 | 0.008 |
| 7.523 | 0.008 |
| 7.524 | 0.008 |
| 7.525 | 0.008 |
| 7.526 | 0.008 |
| 7.527 | 0.008 |
| 7.528 | 0.008 |
| 7.529 | 0.008 |
| 7.53 | 0.008 |
| 7.531 | 0.007 |
| 7.532 | 0.007 |
| 7.533 | 0.007 |
| 7.534 | 0.007 |
| 7.535 | 0.007 |
| 7.536 | 0.007 |
| 7.537 | 0.007 |
| 7.538 | 0.007 |
| 7.539 | 0.007 |
| 7.54 | 0.007 |
| 7.541 | 0.007 |
| 7.542 | 0.007 |
| 7.543 | 0.007 |
| 7.544 | 0.006 |
| 7.545 | 0.006 |
| 7.546 | 0.006 |
| 7.547 | 0.006 |
| 7.548 | 0.006 |
| 7.549 | 0.006 |
| 7.55 | 0.006 |
| 7.551 | 0.006 |
| 7.552 | 0.006 |
| 7.553 | 0.006 |
| 7.554 | 0.006 |
| 7.555 | 0.006 |
| 7.556 | 0.006 |
| 7.557 | 0.006 |
| 7.558 | 0.006 |
| 7.559 | 0.005 |
| 7.56 | 0.005 |
| 7.561 | 0.005 |
| 7.562 | 0.005 |
| 7.563 | 0.005 |
| 7.564 | 0.005 |
| 7.565 | 0.005 |
| 7.566 | 0.005 |
| 7.567 | 0.005 |
| 7.568 | 0.005 |
| 7.569 | 0.005 |
| 7.57 | 0.005 |
| 7.571 | 0.005 |
| 7.572 | 0.005 |
| 7.573 | 0.005 |
| 7.574 | 0.005 |
| 7.575 | 0.005 |
| 7.576 | 0.005 |
| 7.577 | 0.004 |
| 7.578 | 0.004 |
| 7.579 | 0.004 |
| 7.58 | 0.004 |
| 7.581 | 0.004 |
| 7.582 | 0.004 |
| 7.583 | 0.004 |
| 7.584 | 0.004 |
| 7.585 | 0.004 |
| 7.586 | 0.004 |
| 7.587 | 0.004 |
| 7.588 | 0.004 |
| 7.589 | 0.004 |
| 7.59 | 0.004 |
| 7.591 | 0.004 |
| 7.592 | 0.004 |
| 7.593 | 0.004 |
| 7.594 | 0.004 |
| 7.595 | 0.004 |
| 7.596 | 0.004 |
| 7.597 | 0.004 |
| 7.598 | 0.003 |
| 7.599 | 0.003 |
| 7.6 | 0.003 |
| 7.601 | 0.003 |
| 7.602 | 0.003 |
| 7.603 | 0.003 |
| 7.604 | 0.003 |
| 7.605 | 0.003 |
| 7.606 | 0.003 |
| 7.607 | 0.003 |
| 7.608 | 0.003 |
| 7.609 | 0.003 |
| 7.61 | 0.003 |
| 7.611 | 0.003 |
| 7.612 | 0.003 |
| 7.613 | 0.003 |
| 7.614 | 0.003 |
| 7.615 | 0.003 |
| 7.616 | 0.003 |
| 7.617 | 0.003 |
| 7.618 | 0.003 |
| 7.619 | 0.003 |
| 7.62 | 0.003 |
| 7.621 | 0.003 |
| 7.622 | 0.003 |
| 7.623 | 0.003 |
| 7.624 | 0.003 |
| 7.625 | 0.003 |
| 7.626 | 0.002 |
| 7.627 | 0.002 |
| 7.628 | 0.002 |
| 7.628999999999999 | 0.002 |
| 7.63 | 0.002 |
| 7.631 | 0.002 |
| 7.632 | 0.002 |
| 7.633 | 0.002 |
| 7.634 | 0.002 |
| 7.635 | 0.002 |
| 7.636 | 0.002 |
| 7.636999999999999 | 0.002 |
| 7.638 | 0.002 |
| 7.639 | 0.002 |
| 7.64 | 0.002 |
| 7.641 | 0.002 |
| 7.642 | 0.002 |
| 7.643 | 0.002 |
| 7.644 | 0.002 |
| 7.644999999999999 | 0.002 |
| 7.646 | 0.002 |
| 7.647 | 0.002 |
| 7.648 | 0.002 |
| 7.649 | 0.002 |
| 7.65 | 0.002 |
| 7.651 | 0.002 |
| 7.652 | 0.002 |
| 7.652999999999999 | 0.002 |
| 7.654 | 0.002 |
| 7.655 | 0.002 |
| 7.656 | 0.002 |
| 7.657 | 0.002 |
| 7.658 | 0.002 |
| 7.659 | 0.002 |
| 7.66 | 0.002 |
| 7.660999999999999 | 0.002 |
| 7.662 | 0.002 |
| 7.663 | 0.002 |
| 7.664 | 0.002 |
| 7.665 | 0.002 |
| 7.666 | 0.001 |
| 7.667 | 0.001 |
| 7.668 | 0.001 |
| 7.668999999999999 | 0.001 |
| 7.67 | 0.001 |
| 7.671 | 0.001 |
| 7.672 | 0.001 |
| 7.673 | 0.001 |
| 7.674 | 0.001 |
| 7.675 | 0.001 |
| 7.676 | 0.001 |
| 7.677 | 0.001 |
| 7.678 | 0.001 |
| 7.679 | 0.001 |
| 7.68 | 0.001 |
| 7.681 | 0.001 |
| 7.682 | 0.001 |
| 7.683 | 0.001 |
| 7.684 | 0.001 |
| 7.685 | 0.001 |
| 7.686 | 0.001 |
| 7.687 | 0.001 |
| 7.688 | 0.001 |
| 7.689 | 0.001 |
| 7.69 | 0.001 |
| 7.691 | 0.001 |
| 7.692 | 0.001 |
| 7.693 | 0.001 |
| 7.694 | 0.001 |
| 7.695 | 0.001 |
| 7.696 | 0.001 |
| 7.697 | 0.001 |
| 7.698 | 0.001 |
| 7.699 | 0.001 |
| 7.7 | 0.001 |
| 7.701 | 0.001 |
| 7.702 | 0.001 |
| 7.703 | 0.001 |
| 7.704 | 0.001 |
| 7.705 | 0.001 |
| 7.706 | 0.001 |
| 7.707 | 0.001 |
| 7.708 | 0.001 |
| 7.709 | 0.001 |
| 7.71 | 0.001 |
| 7.711 | 0.001 |
| 7.712 | 0.001 |
| 7.713 | 0.001 |
| 7.714 | 0.001 |
| 7.715 | 0.001 |
| 7.716 | 0.001 |
| 7.717 | 0.001 |
| 7.718 | 0.001 |
| 7.719 | 0.001 |
| 7.72 | 0.001 |
| 7.721 | 0.001 |
| 7.722 | 0.001 |
| 7.723 | 0.001 |
| 7.724 | 0.001 |
| 7.725 | 0.001 |
| 7.726 | 0.001 |
| 7.727 | 0.001 |
| 7.728 | 0.001 |
| 7.729 | 0.001 |
| 7.73 | 0.001 |
| 7.731 | 0.001 |
| 7.732 | 0.001 |
| 7.733 | 0.001 |
| 7.734 | 0.001 |
| 7.735 | 0.001 |
| 7.736 | 0.001 |
| 7.737 | 0.001 |
| 7.738 | 0.001 |
| 7.739 | 0.001 |
| 7.74 | 0.001 |
| 7.741 | 0.001 |
| 7.742 | 0.001 |
| 7.743 | 0.001 |
| 7.744 | 0 |
| 7.745 | 0 |
| 7.746 | 0 |
| 7.747 | 0 |
| 7.748 | 0 |
| 7.749 | 0 |
| 7.75 | 0 |
| 7.751 | 0 |
| 7.752 | 0 |
| 7.753 | 0 |
| 7.753999999999999 | 0 |
| 7.755 | 0 |
| 7.756 | 0 |
| 7.757 | 0 |
| 7.758 | 0 |
| 7.759 | 0 |
| 7.76 | 0 |
| 7.761 | 0 |
| 7.761999999999999 | 0 |
| 7.763 | 0 |
| 7.764 | 0 |
| 7.765 | 0 |
| 7.766 | 0 |
| 7.767 | 0 |
| 7.768 | 0 |
| 7.769 | 0 |
| 7.769999999999999 | 0 |
| 7.771 | 0 |
| 7.772 | 0 |
| 7.773 | 0 |
| 7.774 | 0 |
| 7.775 | 0 |
| 7.776 | 0 |
| 7.777 | 0 |
| 7.778 | 0 |
| 7.779 | 0 |
| 7.78 | 0 |
| 7.781 | 0 |
| 7.782 | 0 |
| 7.783 | 0 |
| 7.784 | 0 |
| 7.785 | 0 |
| 7.786 | 0 |
| 7.787 | 0 |
| 7.788 | 0 |
| 7.789 | 0 |
| 7.79 | 0 |
| 7.791 | 0 |
| 7.792 | 0 |
| 7.793 | 0 |
| 7.794 | 0 |
| 7.795 | 0 |
| 7.796 | 0 |
| 7.797 | 0 |
| 7.798 | 0 |
| 7.799 | 0 |
| 7.8 | 0 |
| 7.801 | 0 |
| 7.802 | 0 |
| 7.803 | 0 |
| 7.804 | 0 |
| 7.805 | 0 |
| 7.806 | 0 |
| 7.807 | 0 |
| 7.808 | 0 |
| 7.809 | 0 |
| 7.81 | 0 |
| 7.811 | 0 |
| 7.812 | 0 |
| 7.813 | 0 |
| 7.814 | 0 |
| 7.815 | 0 |
| 7.816 | 0 |
| 7.817 | 0 |
| 7.818 | 0 |
| 7.819 | 0 |
| 7.82 | 0 |
| 7.821 | 0 |
| 7.822 | 0 |
| 7.823 | 0 |
| 7.824 | 0 |
| 7.825 | 0 |
| 7.826 | 0 |
| 7.827 | 0 |
| 7.828 | 0 |
| 7.829 | 0 |
| 7.83 | 0 |
| 7.831 | 0 |
| 7.832 | 0 |
| 7.833 | 0 |
| 7.834 | 0 |
| 7.835 | 0 |
| 7.836 | 0 |
| 7.837 | 0 |
| 7.838 | 0 |
| 7.839 | 0 |
| 7.84 | 0 |
| 7.841 | 0 |
| 7.842 | 0 |
| 7.843 | 0 |
| 7.844 | 0 |
| 7.845 | 0 |
| 7.846 | 0 |
| 7.847 | 0 |
| 7.848 | 0 |
| 7.849 | 0 |
| 7.85 | 0 |
| 7.851 | 0 |
| 7.852 | 0 |
| 7.853 | 0 |
| 7.854 | 0 |
| 7.855 | 0 |
| 7.856 | 0 |
| 7.857 | 0 |
| 7.858 | 0 |
| 7.859 | 0 |
| 7.86 | 0 |
| 7.861 | 0 |
| 7.862 | 0 |
| 7.863 | 0 |
| 7.864 | 0 |
| 7.865 | 0 |
| 7.866 | 0 |
| 7.867 | 0 |
| 7.868 | 0 |
| 7.869 | 0 |
| 7.87 | 0 |
| 7.871 | 0 |
| 7.872 | 0 |
| 7.873 | 0 |
| 7.874 | 0 |
| 7.875 | 0 |
| 7.876 | 0 |
| 7.877 | 0 |
| 7.878 | 0 |
| 7.879 | 0 |
| 7.88 | 0 |
| 7.881 | 0 |
| 7.882 | 0 |
| 7.883 | 0 |
| 7.884 | 0 |
| 7.885 | 0 |
| 7.886 | 0 |
| 7.887 | 0 |
| 7.888 | 0 |
| 7.889 | 0 |
| 7.89 | 0 |
| 7.891 | 0 |
| 7.892 | 0 |
| 7.893 | 0 |
| 7.894 | 0 |
| 7.895 | 0 |
| 7.896 | 0 |
| 7.897 | 0 |
| 7.898 | 0 |
| 7.899 | 0 |
| 7.9 | 0 |
| 7.901 | 0 |
| 7.902 | 0 |
| 7.903 | 0 |
| 7.904 | 0 |
| 7.905 | 0 |
| 7.906 | 0 |
| 7.907 | 0 |
| 7.908 | 0 |
| 7.909 | 0 |
| 7.91 | 0 |
| 7.911 | 0 |
| 7.912 | 0 |
| 7.913 | 0 |
| 7.914 | 0 |
| 7.915 | 0 |
| 7.916 | 0 |
| 7.917 | 0 |
| 7.918 | 0 |
| 7.919 | 0 |
| 7.92 | 0 |
| 7.921 | 0 |
| 7.922 | 0 |
| 7.923 | 0 |
| 7.924 | 0 |
| 7.925 | 0 |
| 7.926 | 0 |
| 7.927 | 0 |
| 7.928 | 0 |
| 7.929 | 0 |
| 7.93 | 0 |
| 7.931 | 0 |
| 7.932 | 0 |
| 7.933 | 0 |
| 7.934 | 0 |
| 7.935 | 0 |
| 7.936 | 0 |
| 7.937 | 0 |
| 7.938 | 0 |
| 7.939 | 0 |
| 7.94 | 0 |
| 7.941 | 0 |
| 7.942 | 0 |
| 7.943 | 0 |
| 7.944 | 0 |
| 7.945 | 0 |
| 7.946 | 0 |
| 7.947 | 0 |
| 7.948 | 0 |
| 7.949 | 0 |
| 7.95 | 0 |
| 7.951 | 0 |
| 7.952 | 0 |
| 7.953 | 0 |
| 7.954 | 0 |
| 7.955 | 0 |
| 7.956 | 0 |
| 7.957 | 0 |
| 7.958 | 0 |
| 7.959 | 0 |
| 7.96 | 0 |
| 7.961 | 0 |
| 7.962 | 0 |
| 7.963 | 0 |
| 7.964 | 0 |
| 7.965 | 0 |
| 7.966 | 0 |
| 7.967 | 0 |
| 7.968 | 0 |
| 7.969 | 0 |
| 7.97 | 0 |
| 7.971 | 0 |
| 7.972 | 0 |
| 7.973 | 0 |
| 7.974 | 0 |
| 7.975 | 0 |
| 7.976 | 0 |
| 7.977 | 0 |
| 7.978 | 0 |
| 7.979 | 0 |
| 7.98 | 0 |
| 7.981 | 0 |
| 7.982 | 0 |
| 7.983 | 0 |
| 7.984 | 0 |
| 7.985 | 0 |
| 7.986 | 0 |
| 7.987 | 0 |
| 7.988 | 0 |
| 7.989 | 0 |
| 7.99 | 0 |
| 7.991 | 0 |
| 7.992 | 0 |
| 7.993 | 0 |
| 7.994 | 0 |
| 7.995 | 0 |
| 7.996 | 0 |
| 7.997 | 0 |
| 7.998 | 0 |
| 7.999 | 0 |
| 8.0 | 0 |
| 8.001 | 0 |
| 8.002 | 0 |
| 8.003 | 0 |
| 8.004 | 0 |
| 8.005 | 0 |
| 8.006 | 0 |
| 8.007 | 0 |
| 8.008 | 0 |
| 8.009 | 0 |
| 8.01 | 0 |
| 8.011 | 0 |
| 8.012 | 0 |
| 8.013 | 0 |
| 8.014 | 0 |
| 8.015 | 0 |
| 8.016 | 0 |
| 8.017 | 0 |
| 8.018 | 0 |
| 8.019 | 0 |
| 8.02 | 0 |
| 8.021 | 0 |
| 8.022 | 0 |
| 8.023 | 0 |
| 8.024 | 0 |
| 8.025 | 0 |
| 8.026 | 0 |
| 8.027 | 0 |
| 8.028 | 0 |
| 8.029 | 0 |
| 8.03 | 0 |
| 8.031 | 0 |
| 8.032 | 0 |
| 8.033 | 0 |
| 8.034 | 0 |
| 8.035 | 0 |
| 8.036 | 0 |
| 8.037 | 0 |
| 8.038 | 0 |
| 8.039 | 0 |
| 8.04 | 0 |
| 8.041 | 0 |
| 8.042 | 0 |
| 8.043 | 0 |
| 8.044 | 0 |
| 8.045 | 0 |
| 8.046 | 0 |
| 8.047 | 0 |
| 8.048 | 0 |
| 8.049 | 0 |
| 8.05 | 0 |
| 8.051 | 0 |
| 8.052 | 0 |
| 8.053 | 0 |
| 8.054 | 0 |
| 8.055 | 0 |
| 8.056 | 0 |
| 8.057 | 0 |
| 8.058 | 0 |
| 8.059 | 0 |
| 8.06 | 0 |
| 8.061 | 0 |
| 8.062 | 0 |
| 8.063 | 0 |
| 8.064 | 0 |
| 8.065 | 0 |
| 8.066 | 0 |
| 8.067 | 0 |
| 8.068 | 0 |
| 8.069 | 0 |
| 8.07 | 0 |
| 8.071 | 0 |
| 8.072 | 0 |
| 8.073 | 0 |
| 8.074 | 0 |
| 8.075 | 0 |
| 8.076 | 0 |
| 8.077 | 0 |
| 8.078 | 0 |
| 8.079 | 0 |
| 8.08 | 0 |
| 8.081 | 0 |
| 8.082 | 0 |
| 8.083 | 0 |
| 8.084 | 0 |
| 8.085 | 0 |
| 8.086 | 0 |
| 8.087 | 0 |
| 8.088 | 0 |
| 8.089 | 0 |
| 8.09 | 0 |
| 8.091 | 0 |
| 8.092 | 0 |
| 8.093 | 0 |
| 8.094 | 0 |
| 8.095 | 0 |
| 8.096 | 0 |
| 8.097 | 0 |
| 8.098 | 0 |
| 8.099 | 0 |
| 8.1 | 0 |
| 8.101 | 0 |
| 8.102 | 0 |
| 8.103 | 0 |
| 8.104 | 0 |
| 8.105 | 0 |
| 8.106 | 0 |
| 8.107 | 0 |
| 8.108 | 0 |
| 8.109 | 0 |
| 8.11 | 0 |
| 8.111 | 0 |
| 8.112 | 0 |
| 8.113 | 0 |
| 8.114 | 0 |
| 8.115 | 0 |
| 8.116 | 0 |
| 8.117 | 0 |
| 8.118 | 0 |
| 8.119 | 0 |
| 8.12 | 0 |
| 8.121 | 0 |
| 8.122 | 0 |
| 8.123 | 0 |
| 8.124 | 0 |
| 8.125 | 0 |
| 8.126 | 0 |
| 8.127 | 0 |
| 8.128 | 0 |
| 8.129 | 0 |
| 8.13 | 0 |
| 8.131 | 0 |
| 8.132 | 0 |
| 8.133 | 0 |
| 8.134 | 0 |
| 8.135 | 0 |
| 8.136 | 0 |
| 8.137 | 0 |
| 8.138 | 0 |
| 8.139 | 0 |
| 8.14 | 0 |
| 8.141 | 0 |
| 8.142 | 0 |
| 8.143 | 0 |
| 8.144 | 0 |
| 8.145 | 0 |
| 8.146 | 0 |
| 8.147 | 0 |
| 8.148 | 0 |
| 8.149 | 0 |
| 8.15 | 0 |
| 8.151 | 0 |
| 8.152 | 0 |
| 8.153 | 0 |
| 8.154 | 0 |
| 8.155 | 0 |
| 8.156 | 0 |
| 8.157 | 0 |
| 8.158 | 0 |
| 8.159 | 0 |
| 8.16 | 0 |
| 8.161 | 0 |
| 8.162 | 0 |
| 8.163 | 0 |
| 8.164 | 0 |
| 8.165 | 0 |
| 8.166 | 0 |
| 8.167 | 0 |
| 8.168 | 0 |
| 8.169 | 0 |
| 8.17 | 0 |
| 8.171 | 0 |
| 8.172 | 0 |
| 8.173 | 0 |
| 8.174 | 0 |
| 8.175 | 0 |
| 8.176 | 0 |
| 8.177 | 0 |
| 8.178 | 0 |
| 8.179 | 0 |
| 8.18 | 0 |
| 8.181 | 0 |
| 8.182 | 0 |
| 8.183 | 0 |
| 8.184 | 0 |
| 8.185 | 0 |
| 8.186 | 0 |
| 8.187 | 0 |
| 8.188 | 0 |
| 8.189 | 0 |
| 8.19 | 0 |
| 8.191 | 0 |
| 8.192 | 0 |
| 8.193 | 0 |
| 8.194 | 0 |
| 8.195 | 0 |
| 8.196 | 0 |
| 8.197 | 0 |
| 8.198 | 0 |
| 8.199 | 0 |
| 8.2 | 0 |
| 8.201 | 0 |
| 8.202 | 0 |
| 8.203 | 0 |
| 8.204 | 0 |
| 8.205 | 0 |
| 8.206 | 0 |
| 8.207 | 0 |
| 8.208 | 0 |
| 8.209 | 0 |
| 8.21 | 0 |
| 8.211 | 0 |
| 8.212 | 0 |
| 8.213 | 0 |
| 8.214 | 0 |
| 8.215 | 0 |
| 8.216 | 0 |
| 8.217 | 0 |
| 8.218 | 0 |
| 8.219 | 0 |
| 8.22 | 0 |
| 8.221 | 0 |
| 8.222 | 0 |
| 8.223 | 0 |
| 8.224 | 0 |
| 8.225 | 0 |
| 8.226 | 0 |
| 8.227 | 0 |
| 8.228 | 0 |
| 8.229 | 0 |
| 8.23 | 0 |
| 8.231 | 0 |
| 8.232 | 0 |
| 8.233 | 0 |
| 8.234 | 0 |
| 8.235 | 0 |
| 8.236 | 0 |
| 8.237 | 0 |
| 8.238 | 0.001 |
| 8.239 | 0.001 |
| 8.24 | 0.001 |
| 8.241 | 0.001 |
| 8.242 | 0.001 |
| 8.243 | 0.001 |
| 8.244 | 0.001 |
| 8.245 | 0.001 |
| 8.246 | 0.001 |
| 8.247 | 0.001 |
| 8.248 | 0.001 |
| 8.249 | 0.001 |
| 8.25 | 0.001 |
| 8.251 | 0.001 |
| 8.252 | 0.001 |
| 8.253 | 0.001 |
| 8.254 | 0.001 |
| 8.255 | 0.001 |
| 8.256 | 0.001 |
| 8.257 | 0.001 |
| 8.258 | 0.001 |
| 8.259 | 0.001 |
| 8.26 | 0.001 |
| 8.261 | 0.001 |
| 8.262 | 0.001 |
| 8.263 | 0.001 |
| 8.264 | 0.001 |
| 8.265 | 0.001 |
| 8.266 | 0.001 |
| 8.267 | 0.001 |
| 8.268 | 0.001 |
| 8.269 | 0.001 |
| 8.27 | 0.001 |
| 8.271 | 0.001 |
| 8.272 | 0.001 |
| 8.273 | 0.001 |
| 8.274 | 0.001 |
| 8.275 | 0.001 |
| 8.276 | 0.001 |
| 8.277 | 0.001 |
| 8.278 | 0.001 |
| 8.279 | 0.001 |
| 8.28 | 0.001 |
| 8.281 | 0.001 |
| 8.282 | 0.001 |
| 8.283 | 0.001 |
| 8.284 | 0.001 |
| 8.285 | 0.001 |
| 8.286 | 0.001 |
| 8.287 | 0.001 |
| 8.288 | 0.001 |
| 8.289 | 0.001 |
| 8.29 | 0.001 |
| 8.291 | 0.001 |
| 8.292 | 0.001 |
| 8.293 | 0.001 |
| 8.294 | 0.001 |
| 8.295 | 0.001 |
| 8.296 | 0.001 |
| 8.297 | 0.001 |
| 8.298 | 0.001 |
| 8.299 | 0.001 |
| 8.3 | 0.001 |
| 8.301 | 0.001 |
| 8.302 | 0.001 |
| 8.303 | 0.001 |
| 8.304 | 0.001 |
| 8.305 | 0.001 |
| 8.306 | 0.001 |
| 8.307 | 0.001 |
| 8.308 | 0.001 |
| 8.309 | 0.001 |
| 8.31 | 0.001 |
| 8.311 | 0.001 |
| 8.312 | 0.001 |
| 8.313 | 0.001 |
| 8.314 | 0.002 |
| 8.315 | 0.002 |
| 8.316 | 0.002 |
| 8.317 | 0.002 |
| 8.318 | 0.002 |
| 8.319 | 0.002 |
| 8.32 | 0.002 |
| 8.321 | 0.002 |
| 8.322 | 0.002 |
| 8.323 | 0.002 |
| 8.324 | 0.002 |
| 8.325 | 0.002 |
| 8.326 | 0.002 |
| 8.327 | 0.002 |
| 8.328 | 0.002 |
| 8.329 | 0.002 |
| 8.33 | 0.002 |
| 8.331 | 0.002 |
| 8.332 | 0.002 |
| 8.333 | 0.002 |
| 8.334 | 0.002 |
| 8.335 | 0.002 |
| 8.336 | 0.002 |
| 8.337 | 0.002 |
| 8.338 | 0.002 |
| 8.339 | 0.002 |
| 8.34 | 0.002 |
| 8.341 | 0.002 |
| 8.342 | 0.002 |
| 8.343 | 0.002 |
| 8.344 | 0.002 |
| 8.345 | 0.002 |
| 8.346 | 0.002 |
| 8.347 | 0.002 |
| 8.348 | 0.002 |
| 8.349 | 0.002 |
| 8.35 | 0.002 |
| 8.351 | 0.002 |
| 8.352 | 0.003 |
| 8.353 | 0.003 |
| 8.354 | 0.003 |
| 8.355 | 0.003 |
| 8.356 | 0.003 |
| 8.357 | 0.003 |
| 8.358 | 0.003 |
| 8.359 | 0.003 |
| 8.36 | 0.003 |
| 8.361 | 0.003 |
| 8.362 | 0.003 |
| 8.363 | 0.003 |
| 8.364 | 0.003 |
| 8.365 | 0.003 |
| 8.366 | 0.003 |
| 8.367 | 0.003 |
| 8.368 | 0.003 |
| 8.369 | 0.003 |
| 8.37 | 0.003 |
| 8.371 | 0.003 |
| 8.372 | 0.003 |
| 8.373 | 0.003 |
| 8.374 | 0.003 |
| 8.375 | 0.003 |
| 8.376 | 0.003 |
| 8.377 | 0.003 |
| 8.378 | 0.003 |
| 8.379 | 0.004 |
| 8.38 | 0.004 |
| 8.381 | 0.004 |
| 8.382 | 0.004 |
| 8.383 | 0.004 |
| 8.384 | 0.004 |
| 8.385 | 0.004 |
| 8.386 | 0.004 |
| 8.387 | 0.004 |
| 8.388 | 0.004 |
| 8.389 | 0.004 |
| 8.39 | 0.004 |
| 8.391 | 0.004 |
| 8.392 | 0.004 |
| 8.393 | 0.004 |
| 8.394 | 0.004 |
| 8.395 | 0.004 |
| 8.396 | 0.004 |
| 8.397 | 0.004 |
| 8.398 | 0.004 |
| 8.399 | 0.004 |
| 8.4 | 0.005 |
| 8.401 | 0.005 |
| 8.402 | 0.005 |
| 8.403 | 0.005 |
| 8.404 | 0.005 |
| 8.405 | 0.005 |
| 8.406 | 0.005 |
| 8.407 | 0.005 |
| 8.408 | 0.005 |
| 8.409 | 0.005 |
| 8.41 | 0.005 |
| 8.411 | 0.005 |
| 8.412 | 0.005 |
| 8.413 | 0.005 |
| 8.414 | 0.005 |
| 8.415 | 0.005 |
| 8.416 | 0.006 |
| 8.417 | 0.006 |
| 8.418 | 0.006 |
| 8.419 | 0.006 |
| 8.42 | 0.006 |
| 8.421 | 0.006 |
| 8.422 | 0.006 |
| 8.423 | 0.006 |
| 8.424 | 0.006 |
| 8.425 | 0.006 |
| 8.426 | 0.006 |
| 8.427 | 0.006 |
| 8.428 | 0.006 |
| 8.429 | 0.006 |
| 8.43 | 0.006 |
| 8.431 | 0.007 |
| 8.432 | 0.007 |
| 8.433 | 0.007 |
| 8.434 | 0.007 |
| 8.435 | 0.007 |
| 8.436 | 0.007 |
| 8.437 | 0.007 |
| 8.438 | 0.007 |
| 8.439 | 0.007 |
| 8.44 | 0.007 |
| 8.441 | 0.007 |
| 8.442 | 0.007 |
| 8.443 | 0.007 |
| 8.444 | 0.008 |
| 8.445 | 0.008 |
| 8.446 | 0.008 |
| 8.447 | 0.008 |
| 8.448 | 0.008 |
| 8.449 | 0.008 |
| 8.45 | 0.008 |
| 8.451 | 0.008 |
| 8.452 | 0.008 |
| 8.453 | 0.008 |
| 8.454 | 0.008 |
| 8.455 | 0.009 |
| 8.456 | 0.009 |
| 8.457 | 0.009 |
| 8.458 | 0.009 |
| 8.459 | 0.009 |
| 8.46 | 0.009 |
| 8.461 | 0.009 |
| 8.462 | 0.009 |
| 8.463 | 0.009 |
| 8.464 | 0.009 |
| 8.465 | 0.01 |
| 8.466 | 0.01 |
| 8.467 | 0.01 |
| 8.468 | 0.01 |
| 8.469 | 0.01 |
| 8.47 | 0.01 |
| 8.471 | 0.01 |
| 8.472 | 0.01 |
| 8.473 | 0.01 |
| 8.474 | 0.01 |
| 8.475 | 0.011 |
| 8.476 | 0.011 |
| 8.477 | 0.011 |
| 8.478 | 0.011 |
| 8.479 | 0.011 |
| 8.48 | 0.011 |
| 8.481 | 0.011 |
| 8.482 | 0.011 |
| 8.483 | 0.012 |
| 8.484 | 0.012 |
| 8.485 | 0.012 |
| 8.486 | 0.012 |
| 8.487 | 0.012 |
| 8.488 | 0.012 |
| 8.489 | 0.012 |
| 8.49 | 0.012 |
| 8.491 | 0.012 |
| 8.492 | 0.013 |
| 8.493 | 0.013 |
| 8.494 | 0.013 |
| 8.495 | 0.013 |
| 8.496 | 0.013 |
| 8.497 | 0.013 |
| 8.498 | 0.013 |
| 8.499 | 0.014 |
| 8.5 | 0.014 |
| 8.501 | 0.014 |
| 8.502 | 0.014 |
| 8.503 | 0.014 |
| 8.504 | 0.014 |
| 8.505 | 0.014 |
| 8.506 | 0.015 |
| 8.507 | 0.015 |
| 8.508 | 0.015 |
| 8.509 | 0.015 |
| 8.51 | 0.015 |
| 8.511 | 0.015 |
| 8.512 | 0.015 |
| 8.513 | 0.016 |
| 8.514 | 0.016 |
| 8.515 | 0.016 |
| 8.516 | 0.016 |
| 8.517 | 0.016 |
| 8.518 | 0.016 |
| 8.519 | 0.016 |
| 8.52 | 0.017 |
| 8.521 | 0.017 |
| 8.522 | 0.017 |
| 8.523 | 0.017 |
| 8.524 | 0.017 |
| 8.525 | 0.017 |
| 8.526 | 0.018 |
| 8.527 | 0.018 |
| 8.528 | 0.018 |
| 8.529 | 0.018 |
| 8.53 | 0.018 |
| 8.531 | 0.018 |
| 8.532 | 0.019 |
| 8.533 | 0.019 |
| 8.534 | 0.019 |
| 8.535 | 0.019 |
| 8.536 | 0.019 |
| 8.537 | 0.02 |
| 8.538 | 0.02 |
| 8.539 | 0.02 |
| 8.54 | 0.02 |
| 8.541 | 0.02 |
| 8.542 | 0.02 |
| 8.543 | 0.021 |
| 8.544 | 0.021 |
| 8.545 | 0.021 |
| 8.546 | 0.021 |
| 8.547 | 0.021 |
| 8.548 | 0.022 |
| 8.549 | 0.022 |
| 8.55 | 0.022 |
| 8.551 | 0.022 |
| 8.552 | 0.022 |
| 8.553 | 0.023 |
| 8.554 | 0.023 |
| 8.555 | 0.023 |
| 8.556 | 0.023 |
| 8.557 | 0.023 |
| 8.558 | 0.024 |
| 8.559 | 0.024 |
| 8.56 | 0.024 |
| 8.561 | 0.024 |
| 8.562 | 0.024 |
| 8.563 | 0.025 |
| 8.564 | 0.025 |
| 8.565 | 0.025 |
| 8.566 | 0.025 |
| 8.567 | 0.026 |
| 8.568 | 0.026 |
| 8.569 | 0.026 |
| 8.57 | 0.026 |
| 8.571 | 0.026 |
| 8.572 | 0.027 |
| 8.573 | 0.027 |
| 8.574 | 0.027 |
| 8.575 | 0.027 |
| 8.576 | 0.028 |
| 8.577 | 0.028 |
| 8.578 | 0.028 |
| 8.579 | 0.028 |
| 8.58 | 0.029 |
| 8.581 | 0.029 |
| 8.582 | 0.029 |
| 8.583 | 0.029 |
| 8.584 | 0.03 |
| 8.585 | 0.03 |
| 8.586 | 0.03 |
| 8.587 | 0.03 |
| 8.588 | 0.031 |
| 8.589 | 0.031 |
| 8.59 | 0.031 |
| 8.591 | 0.031 |
| 8.592 | 0.032 |
| 8.593 | 0.032 |
| 8.594 | 0.032 |
| 8.595 | 0.032 |
| 8.596 | 0.033 |
| 8.597 | 0.033 |
| 8.598 | 0.033 |
| 8.599 | 0.033 |
| 8.6 | 0.034 |
| 8.601 | 0.034 |
| 8.602 | 0.034 |
| 8.603 | 0.034 |
| 8.604 | 0.035 |
| 8.605 | 0.035 |
| 8.606 | 0.035 |
| 8.607 | 0.036 |
| 8.608 | 0.036 |
| 8.609 | 0.036 |
| 8.61 | 0.036 |
| 8.611 | 0.037 |
| 8.612 | 0.037 |
| 8.613 | 0.037 |
| 8.614 | 0.038 |
| 8.615 | 0.038 |
| 8.616 | 0.038 |
| 8.617 | 0.038 |
| 8.618 | 0.039 |
| 8.619 | 0.039 |
| 8.62 | 0.039 |
| 8.621 | 0.04 |
| 8.622 | 0.04 |
| 8.623 | 0.04 |
| 8.624 | 0.041 |
| 8.625 | 0.041 |
| 8.626 | 0.041 |
| 8.627 | 0.041 |
| 8.628 | 0.042 |
| 8.629 | 0.042 |
| 8.63 | 0.042 |
| 8.631 | 0.043 |
| 8.632 | 0.043 |
| 8.633 | 0.043 |
| 8.634 | 0.044 |
| 8.635 | 0.044 |
| 8.636 | 0.044 |
| 8.637 | 0.045 |
| 8.638 | 0.045 |
| 8.639 | 0.045 |
| 8.64 | 0.046 |
| 8.641 | 0.046 |
| 8.642 | 0.046 |
| 8.643 | 0.047 |
| 8.644 | 0.047 |
| 8.645 | 0.047 |
| 8.646 | 0.048 |
| 8.647 | 0.048 |
| 8.648 | 0.048 |
| 8.649 | 0.049 |
| 8.65 | 0.049 |
| 8.651 | 0.049 |
| 8.652 | 0.05 |
| 8.653 | 0.05 |
| 8.654 | 0.05 |
| 8.655 | 0.051 |
| 8.656 | 0.051 |
| 8.657 | 0.051 |
| 8.658 | 0.052 |
| 8.659 | 0.052 |
| 8.66 | 0.052 |
| 8.661 | 0.053 |
| 8.662 | 0.053 |
| 8.663 | 0.054 |
| 8.664 | 0.054 |
| 8.665 | 0.054 |
| 8.666 | 0.055 |
| 8.667 | 0.055 |
| 8.668 | 0.055 |
| 8.669 | 0.056 |
| 8.67 | 0.056 |
| 8.671 | 0.056 |
| 8.672 | 0.057 |
| 8.673 | 0.057 |
| 8.674 | 0.058 |
| 8.675 | 0.058 |
| 8.676 | 0.058 |
| 8.677 | 0.059 |
| 8.678 | 0.059 |
| 8.679 | 0.059 |
| 8.68 | 0.06 |
| 8.681 | 0.06 |
| 8.682 | 0.061 |
| 8.683 | 0.061 |
| 8.684 | 0.061 |
| 8.685 | 0.062 |
| 8.686 | 0.062 |
| 8.687 | 0.063 |
| 8.688 | 0.063 |
| 8.689 | 0.063 |
| 8.69 | 0.064 |
| 8.691 | 0.064 |
| 8.692 | 0.065 |
| 8.693 | 0.065 |
| 8.694 | 0.065 |
| 8.695 | 0.066 |
| 8.696 | 0.066 |
| 8.697 | 0.067 |
| 8.698 | 0.067 |
| 8.699 | 0.067 |
| 8.7 | 0.068 |
| 8.701 | 0.068 |
| 8.702 | 0.069 |
| 8.703 | 0.069 |
| 8.704 | 0.069 |
| 8.705 | 0.07 |
| 8.706 | 0.07 |
| 8.707 | 0.071 |
| 8.708 | 0.071 |
| 8.709 | 0.071 |
| 8.71 | 0.072 |
| 8.711 | 0.072 |
| 8.712 | 0.073 |
| 8.713 | 0.073 |
| 8.714 | 0.074 |
| 8.715 | 0.074 |
| 8.716 | 0.074 |
| 8.717 | 0.075 |
| 8.718 | 0.075 |
| 8.719 | 0.076 |
| 8.72 | 0.076 |
| 8.721 | 0.077 |
| 8.722 | 0.077 |
| 8.723 | 0.077 |
| 8.724 | 0.078 |
| 8.725 | 0.078 |
| 8.726 | 0.079 |
| 8.727 | 0.079 |
| 8.728 | 0.08 |
| 8.729 | 0.08 |
| 8.73 | 0.08 |
| 8.731 | 0.081 |
| 8.732 | 0.081 |
| 8.733 | 0.082 |
| 8.734 | 0.082 |
| 8.735 | 0.083 |
| 8.736 | 0.083 |
| 8.737 | 0.083 |
| 8.738 | 0.084 |
| 8.739 | 0.084 |
| 8.74 | 0.085 |
| 8.741 | 0.085 |
| 8.742 | 0.086 |
| 8.743 | 0.086 |
| 8.744 | 0.087 |
| 8.745 | 0.087 |
| 8.746 | 0.087 |
| 8.747 | 0.088 |
| 8.748 | 0.088 |
| 8.749 | 0.089 |
| 8.75 | 0.089 |
| 8.751 | 0.09 |
| 8.752 | 0.09 |
| 8.753 | 0.091 |
| 8.754 | 0.091 |
| 8.755 | 0.091 |
| 8.756 | 0.092 |
| 8.757 | 0.092 |
| 8.758 | 0.093 |
| 8.759 | 0.093 |
| 8.76 | 0.094 |
| 8.761 | 0.094 |
| 8.762 | 0.095 |
| 8.763 | 0.095 |
| 8.764 | 0.095 |
| 8.765 | 0.096 |
| 8.766 | 0.096 |
| 8.767 | 0.097 |
| 8.768 | 0.097 |
| 8.769 | 0.098 |
| 8.77 | 0.098 |
| 8.771 | 0.099 |
| 8.772 | 0.099 |
| 8.773 | 0.1 |
| 8.774 | 0.1 |
| 8.775 | 0.1 |
| 8.776 | 0.101 |
| 8.777 | 0.101 |
| 8.778 | 0.102 |
| 8.779 | 0.102 |
| 8.78 | 0.103 |
| 8.781 | 0.103 |
| 8.782 | 0.104 |
| 8.783 | 0.104 |
| 8.784 | 0.105 |
| 8.785 | 0.105 |
| 8.786 | 0.105 |
| 8.787 | 0.106 |
| 8.788 | 0.106 |
| 8.789 | 0.107 |
| 8.79 | 0.107 |
| 8.791 | 0.108 |
| 8.792 | 0.108 |
| 8.793 | 0.109 |
| 8.794 | 0.109 |
| 8.795 | 0.109 |
| 8.796 | 0.11 |
| 8.797 | 0.11 |
| 8.798 | 0.111 |
| 8.799 | 0.111 |
| 8.8 | 0.112 |
| 8.801 | 0.112 |
| 8.802 | 0.113 |
| 8.803 | 0.113 |
| 8.804 | 0.114 |
| 8.805 | 0.114 |
| 8.806 | 0.114 |
| 8.807 | 0.115 |
| 8.808 | 0.115 |
| 8.809 | 0.116 |
| 8.81 | 0.116 |
| 8.811 | 0.117 |
| 8.812 | 0.117 |
| 8.813 | 0.117 |
| 8.814 | 0.118 |
| 8.815 | 0.118 |
| 8.816 | 0.119 |
| 8.817 | 0.119 |
| 8.818 | 0.12 |
| 8.819 | 0.12 |
| 8.82 | 0.121 |
| 8.821 | 0.121 |
| 8.822 | 0.121 |
| 8.823 | 0.122 |
| 8.824 | 0.122 |
| 8.825 | 0.123 |
| 8.826 | 0.123 |
| 8.827 | 0.124 |
| 8.828 | 0.124 |
| 8.829 | 0.124 |
| 8.83 | 0.125 |
| 8.831 | 0.125 |
| 8.832 | 0.126 |
| 8.833 | 0.126 |
| 8.834 | 0.127 |
| 8.835 | 0.127 |
| 8.836 | 0.127 |
| 8.837 | 0.128 |
| 8.838 | 0.128 |
| 8.839 | 0.129 |
| 8.84 | 0.129 |
| 8.841 | 0.129 |
| 8.842 | 0.13 |
| 8.843 | 0.13 |
| 8.844 | 0.131 |
| 8.845 | 0.131 |
| 8.846 | 0.131 |
| 8.847 | 0.132 |
| 8.848 | 0.132 |
| 8.849 | 0.133 |
| 8.85 | 0.133 |
| 8.851 | 0.133 |
| 8.852 | 0.134 |
| 8.853 | 0.134 |
| 8.854 | 0.135 |
| 8.855 | 0.135 |
| 8.856 | 0.135 |
| 8.857 | 0.136 |
| 8.858 | 0.136 |
| 8.859 | 0.137 |
| 8.86 | 0.137 |
| 8.861 | 0.137 |
| 8.862 | 0.138 |
| 8.863 | 0.138 |
| 8.864 | 0.139 |
| 8.865 | 0.139 |
| 8.866 | 0.139 |
| 8.867 | 0.14 |
| 8.868 | 0.14 |
| 8.869 | 0.14 |
| 8.87 | 0.141 |
| 8.871 | 0.141 |
| 8.872 | 0.141 |
| 8.873 | 0.142 |
| 8.874 | 0.142 |
| 8.875 | 0.143 |
| 8.876 | 0.143 |
| 8.877 | 0.143 |
| 8.878 | 0.144 |
| 8.879 | 0.144 |
| 8.88 | 0.144 |
| 8.881 | 0.145 |
| 8.882 | 0.145 |
| 8.883 | 0.145 |
| 8.884 | 0.146 |
| 8.885 | 0.146 |
| 8.886 | 0.146 |
| 8.887 | 0.147 |
| 8.888 | 0.147 |
| 8.889 | 0.147 |
| 8.89 | 0.148 |
| 8.891 | 0.148 |
| 8.892 | 0.148 |
| 8.893 | 0.149 |
| 8.894 | 0.149 |
| 8.895 | 0.149 |
| 8.896 | 0.15 |
| 8.897 | 0.15 |
| 8.898 | 0.15 |
| 8.899 | 0.151 |
| 8.9 | 0.151 |
| 8.901 | 0.151 |
| 8.902 | 0.151 |
| 8.903 | 0.152 |
| 8.904 | 0.152 |
| 8.905 | 0.152 |
| 8.906 | 0.153 |
| 8.907 | 0.153 |
| 8.908 | 0.153 |
| 8.909 | 0.153 |
| 8.91 | 0.154 |
| 8.911 | 0.154 |
| 8.912 | 0.154 |
| 8.913 | 0.155 |
| 8.914 | 0.155 |
| 8.915 | 0.155 |
| 8.916 | 0.155 |
| 8.917 | 0.156 |
| 8.918 | 0.156 |
| 8.919 | 0.156 |
| 8.92 | 0.156 |
| 8.921 | 0.157 |
| 8.922 | 0.157 |
| 8.923 | 0.157 |
| 8.924 | 0.157 |
| 8.925 | 0.158 |
| 8.926 | 0.158 |
| 8.927 | 0.158 |
| 8.928 | 0.158 |
| 8.929 | 0.158 |
| 8.93 | 0.159 |
| 8.931 | 0.159 |
| 8.932 | 0.159 |
| 8.933 | 0.159 |
| 8.934 | 0.16 |
| 8.935 | 0.16 |
| 8.936 | 0.16 |
| 8.937 | 0.16 |
| 8.938 | 0.16 |
| 8.939 | 0.161 |
| 8.94 | 0.161 |
| 8.941 | 0.161 |
| 8.942 | 0.161 |
| 8.943 | 0.161 |
| 8.944 | 0.162 |
| 8.945 | 0.162 |
| 8.946 | 0.162 |
| 8.947 | 0.162 |
| 8.948 | 0.162 |
| 8.949 | 0.162 |
| 8.95 | 0.163 |
| 8.951 | 0.163 |
| 8.952 | 0.163 |
| 8.953 | 0.163 |
| 8.954 | 0.163 |
| 8.955 | 0.163 |
| 8.956 | 0.163 |
| 8.957 | 0.164 |
| 8.958 | 0.164 |
| 8.959 | 0.164 |
| 8.96 | 0.164 |
| 8.961 | 0.164 |
| 8.962 | 0.164 |
| 8.963 | 0.164 |
| 8.964 | 0.165 |
| 8.965 | 0.165 |
| 8.966 | 0.165 |
| 8.967 | 0.165 |
| 8.968 | 0.165 |
| 8.969 | 0.165 |
| 8.97 | 0.165 |
| 8.971 | 0.165 |
| 8.972 | 0.165 |
| 8.973 | 0.165 |
| 8.974 | 0.166 |
| 8.975 | 0.166 |
| 8.976 | 0.166 |
| 8.977 | 0.166 |
| 8.978 | 0.166 |
| 8.979 | 0.166 |
| 8.98 | 0.166 |
| 8.981 | 0.166 |
| 8.982 | 0.166 |
| 8.983 | 0.166 |
| 8.984 | 0.166 |
| 8.985 | 0.166 |
| 8.986 | 0.166 |
| 8.987 | 0.166 |
| 8.988 | 0.166 |
| 8.989 | 0.166 |
| 8.99 | 0.167 |
| 8.991 | 0.167 |
| 8.992 | 0.167 |
| 8.993 | 0.167 |
| 8.994 | 0.167 |
| 8.995 | 0.167 |
| 8.996 | 0.167 |
| 8.997 | 0.167 |
| 8.998 | 0.167 |
| 8.999 | 0.167 |
| 9.0 | 0.167 |
| 9.001 | 0.167 |
| 9.002 | 0.167 |
| 9.003 | 0.167 |
| 9.004 | 0.167 |
| 9.005 | 0.167 |
| 9.006 | 0.167 |
| 9.007 | 0.167 |
| 9.008 | 0.167 |
| 9.009 | 0.167 |
| 9.01 | 0.167 |
| 9.011 | 0.166 |
| 9.012 | 0.166 |
| 9.013 | 0.166 |
| 9.014 | 0.166 |
| 9.015 | 0.166 |
| 9.016 | 0.166 |
| 9.017 | 0.166 |
| 9.018 | 0.166 |
| 9.019 | 0.166 |
| 9.02 | 0.166 |
| 9.021 | 0.166 |
| 9.022 | 0.166 |
| 9.023 | 0.166 |
| 9.024 | 0.166 |
| 9.025 | 0.166 |
| 9.026 | 0.166 |
| 9.027 | 0.165 |
| 9.028 | 0.165 |
| 9.029 | 0.165 |
| 9.03 | 0.165 |
| 9.031 | 0.165 |
| 9.032 | 0.165 |
| 9.033 | 0.165 |
| 9.034 | 0.165 |
| 9.035 | 0.165 |
| 9.036 | 0.165 |
| 9.037 | 0.164 |
| 9.038 | 0.164 |
| 9.039 | 0.164 |
| 9.04 | 0.164 |
| 9.041 | 0.164 |
| 9.042 | 0.164 |
| 9.043 | 0.164 |
| 9.044 | 0.163 |
| 9.045 | 0.163 |
| 9.046 | 0.163 |
| 9.047 | 0.163 |
| 9.048 | 0.163 |
| 9.049 | 0.163 |
| 9.05 | 0.163 |
| 9.051 | 0.162 |
| 9.052 | 0.162 |
| 9.053 | 0.162 |
| 9.054 | 0.162 |
| 9.055 | 0.162 |
| 9.056 | 0.162 |
| 9.057 | 0.161 |
| 9.058 | 0.161 |
| 9.059 | 0.161 |
| 9.06 | 0.161 |
| 9.061 | 0.161 |
| 9.062 | 0.16 |
| 9.063 | 0.16 |
| 9.064 | 0.16 |
| 9.065 | 0.16 |
| 9.066 | 0.16 |
| 9.067 | 0.159 |
| 9.068 | 0.159 |
| 9.069 | 0.159 |
| 9.07 | 0.159 |
| 9.071 | 0.158 |
| 9.072 | 0.158 |
| 9.073 | 0.158 |
| 9.074 | 0.158 |
| 9.075 | 0.158 |
| 9.076 | 0.157 |
| 9.077 | 0.157 |
| 9.078 | 0.157 |
| 9.079 | 0.157 |
| 9.08 | 0.156 |
| 9.081 | 0.156 |
| 9.082 | 0.156 |
| 9.083 | 0.156 |
| 9.084 | 0.155 |
| 9.085 | 0.155 |
| 9.086 | 0.155 |
| 9.087 | 0.155 |
| 9.088 | 0.154 |
| 9.089 | 0.154 |
| 9.09 | 0.154 |
| 9.091 | 0.153 |
| 9.092 | 0.153 |
| 9.093 | 0.153 |
| 9.094 | 0.153 |
| 9.095 | 0.152 |
| 9.096 | 0.152 |
| 9.097 | 0.152 |
| 9.098 | 0.151 |
| 9.099 | 0.151 |
| 9.1 | 0.151 |
| 9.101 | 0.151 |
| 9.102 | 0.15 |
| 9.103 | 0.15 |
| 9.104 | 0.15 |
| 9.105 | 0.149 |
| 9.106 | 0.149 |
| 9.107 | 0.149 |
| 9.108 | 0.148 |
| 9.109 | 0.148 |
| 9.11 | 0.148 |
| 9.111 | 0.147 |
| 9.112 | 0.147 |
| 9.113 | 0.147 |
| 9.114 | 0.146 |
| 9.115 | 0.146 |
| 9.116 | 0.146 |
| 9.117 | 0.145 |
| 9.118 | 0.145 |
| 9.119 | 0.145 |
| 9.12 | 0.144 |
| 9.121 | 0.144 |
| 9.122 | 0.144 |
| 9.123 | 0.143 |
| 9.124 | 0.143 |
| 9.125 | 0.143 |
| 9.126 | 0.142 |
| 9.127 | 0.142 |
| 9.128 | 0.141 |
| 9.129 | 0.141 |
| 9.13 | 0.141 |
| 9.131 | 0.14 |
| 9.132 | 0.14 |
| 9.133 | 0.14 |
| 9.134 | 0.139 |
| 9.135 | 0.139 |
| 9.136 | 0.139 |
| 9.137 | 0.138 |
| 9.138 | 0.138 |
| 9.139 | 0.137 |
| 9.14 | 0.137 |
| 9.141 | 0.137 |
| 9.142 | 0.136 |
| 9.143 | 0.136 |
| 9.144 | 0.135 |
| 9.145 | 0.135 |
| 9.146 | 0.135 |
| 9.147 | 0.134 |
| 9.148 | 0.134 |
| 9.149 | 0.133 |
| 9.15 | 0.133 |
| 9.151 | 0.133 |
| 9.152 | 0.132 |
| 9.153 | 0.132 |
| 9.154 | 0.131 |
| 9.155 | 0.131 |
| 9.156 | 0.131 |
| 9.157 | 0.13 |
| 9.158 | 0.13 |
| 9.159 | 0.129 |
| 9.16 | 0.129 |
| 9.161 | 0.129 |
| 9.162 | 0.128 |
| 9.163 | 0.128 |
| 9.164 | 0.127 |
| 9.165 | 0.127 |
| 9.166 | 0.127 |
| 9.167 | 0.126 |
| 9.168 | 0.126 |
| 9.169 | 0.125 |
| 9.17 | 0.125 |
| 9.171 | 0.124 |
| 9.172 | 0.124 |
| 9.173 | 0.124 |
| 9.174 | 0.123 |
| 9.175 | 0.123 |
| 9.176 | 0.122 |
| 9.177 | 0.122 |
| 9.178 | 0.121 |
| 9.179 | 0.121 |
| 9.18 | 0.121 |
| 9.181 | 0.12 |
| 9.182 | 0.12 |
| 9.183 | 0.119 |
| 9.184 | 0.119 |
| 9.185 | 0.118 |
| 9.186 | 0.118 |
| 9.187 | 0.117 |
| 9.188 | 0.117 |
| 9.189 | 0.117 |
| 9.19 | 0.116 |
| 9.191 | 0.116 |
| 9.192 | 0.115 |
| 9.193 | 0.115 |
| 9.194 | 0.114 |
| 9.195 | 0.114 |
| 9.196 | 0.114 |
| 9.197 | 0.113 |
| 9.198 | 0.113 |
| 9.199 | 0.112 |
| 9.2 | 0.112 |
| 9.201 | 0.111 |
| 9.202 | 0.111 |
| 9.203 | 0.11 |
| 9.204 | 0.11 |
| 9.205 | 0.109 |
| 9.206 | 0.109 |
| 9.207 | 0.109 |
| 9.208 | 0.108 |
| 9.209 | 0.108 |
| 9.21 | 0.107 |
| 9.211 | 0.107 |
| 9.212 | 0.106 |
| 9.213 | 0.106 |
| 9.214 | 0.105 |
| 9.215 | 0.105 |
| 9.216 | 0.105 |
| 9.217 | 0.104 |
| 9.218 | 0.104 |
| 9.219 | 0.103 |
| 9.22 | 0.103 |
| 9.221 | 0.102 |
| 9.222 | 0.102 |
| 9.223 | 0.101 |
| 9.224 | 0.101 |
| 9.225 | 0.1 |
| 9.226 | 0.1 |
| 9.227 | 0.1 |
| 9.228 | 0.099 |
| 9.229 | 0.099 |
| 9.23 | 0.098 |
| 9.231 | 0.098 |
| 9.232 | 0.097 |
| 9.233 | 0.097 |
| 9.234 | 0.096 |
| 9.235 | 0.096 |
| 9.236 | 0.095 |
| 9.237 | 0.095 |
| 9.238 | 0.095 |
| 9.239 | 0.094 |
| 9.24 | 0.094 |
| 9.241 | 0.093 |
| 9.242 | 0.093 |
| 9.243 | 0.092 |
| 9.244 | 0.092 |
| 9.245 | 0.091 |
| 9.246 | 0.091 |
| 9.247 | 0.091 |
| 9.248 | 0.09 |
| 9.249 | 0.09 |
| 9.25 | 0.089 |
| 9.251 | 0.089 |
| 9.252 | 0.088 |
| 9.253 | 0.088 |
| 9.254 | 0.087 |
| 9.255 | 0.087 |
| 9.256 | 0.087 |
| 9.257 | 0.086 |
| 9.258 | 0.086 |
| 9.259 | 0.085 |
| 9.26 | 0.085 |
| 9.261 | 0.084 |
| 9.262 | 0.084 |
| 9.263 | 0.083 |
| 9.264 | 0.083 |
| 9.265 | 0.083 |
| 9.266 | 0.082 |
| 9.267 | 0.082 |
| 9.268 | 0.081 |
| 9.269 | 0.081 |
| 9.27 | 0.08 |
| 9.271 | 0.08 |
| 9.272 | 0.08 |
| 9.273 | 0.079 |
| 9.274 | 0.079 |
| 9.275 | 0.078 |
| 9.276 | 0.078 |
| 9.277 | 0.077 |
| 9.278 | 0.077 |
| 9.279 | 0.077 |
| 9.28 | 0.076 |
| 9.281 | 0.076 |
| 9.282 | 0.075 |
| 9.283 | 0.075 |
| 9.284 | 0.074 |
| 9.285 | 0.074 |
| 9.286 | 0.074 |
| 9.287 | 0.073 |
| 9.288 | 0.073 |
| 9.289 | 0.072 |
| 9.29 | 0.072 |
| 9.291 | 0.071 |
| 9.292 | 0.071 |
| 9.293 | 0.071 |
| 9.294 | 0.07 |
| 9.295 | 0.07 |
| 9.296 | 0.069 |
| 9.297 | 0.069 |
| 9.298 | 0.069 |
| 9.299 | 0.068 |
| 9.3 | 0.068 |
| 9.301 | 0.067 |
| 9.302 | 0.067 |
| 9.303 | 0.067 |
| 9.304 | 0.066 |
| 9.305 | 0.066 |
| 9.306 | 0.065 |
| 9.307 | 0.065 |
| 9.308 | 0.065 |
| 9.309 | 0.064 |
| 9.31 | 0.064 |
| 9.311 | 0.063 |
| 9.312 | 0.063 |
| 9.313 | 0.063 |
| 9.314 | 0.062 |
| 9.315 | 0.062 |
| 9.316 | 0.061 |
| 9.317 | 0.061 |
| 9.318 | 0.061 |
| 9.319 | 0.06 |
| 9.32 | 0.06 |
| 9.321 | 0.059 |
| 9.322 | 0.059 |
| 9.323 | 0.059 |
| 9.324 | 0.058 |
| 9.325 | 0.058 |
| 9.326 | 0.058 |
| 9.327 | 0.057 |
| 9.328 | 0.057 |
| 9.329 | 0.056 |
| 9.33 | 0.056 |
| 9.331 | 0.056 |
| 9.332 | 0.055 |
| 9.333 | 0.055 |
| 9.334 | 0.055 |
| 9.335 | 0.054 |
| 9.336 | 0.054 |
| 9.337 | 0.054 |
| 9.338 | 0.053 |
| 9.339 | 0.053 |
| 9.34 | 0.052 |
| 9.341 | 0.052 |
| 9.342 | 0.052 |
| 9.343 | 0.051 |
| 9.344 | 0.051 |
| 9.345 | 0.051 |
| 9.346 | 0.05 |
| 9.347 | 0.05 |
| 9.348 | 0.05 |
| 9.349 | 0.049 |
| 9.35 | 0.049 |
| 9.351 | 0.049 |
| 9.352 | 0.048 |
| 9.353 | 0.048 |
| 9.354 | 0.048 |
| 9.355 | 0.047 |
| 9.356 | 0.047 |
| 9.357 | 0.047 |
| 9.358 | 0.046 |
| 9.359 | 0.046 |
| 9.36 | 0.046 |
| 9.361 | 0.045 |
| 9.362 | 0.045 |
| 9.363 | 0.045 |
| 9.364 | 0.044 |
| 9.365 | 0.044 |
| 9.366 | 0.044 |
| 9.367 | 0.043 |
| 9.368 | 0.043 |
| 9.369 | 0.043 |
| 9.37 | 0.042 |
| 9.371 | 0.042 |
| 9.372 | 0.042 |
| 9.373 | 0.041 |
| 9.374 | 0.041 |
| 9.375 | 0.041 |
| 9.376 | 0.041 |
| 9.377 | 0.04 |
| 9.378 | 0.04 |
| 9.379 | 0.04 |
| 9.38 | 0.039 |
| 9.381 | 0.039 |
| 9.382 | 0.039 |
| 9.383 | 0.038 |
| 9.384 | 0.038 |
| 9.385 | 0.038 |
| 9.386 | 0.038 |
| 9.387 | 0.037 |
| 9.388 | 0.037 |
| 9.389 | 0.037 |
| 9.39 | 0.036 |
| 9.391 | 0.036 |
| 9.392 | 0.036 |
| 9.393 | 0.036 |
| 9.394 | 0.035 |
| 9.395 | 0.035 |
| 9.396 | 0.035 |
| 9.397 | 0.034 |
| 9.398 | 0.034 |
| 9.399 | 0.034 |
| 9.4 | 0.034 |
| 9.401 | 0.033 |
| 9.402 | 0.033 |
| 9.403 | 0.033 |
| 9.404 | 0.033 |
| 9.405 | 0.032 |
| 9.406 | 0.032 |
| 9.407 | 0.032 |
| 9.408 | 0.032 |
| 9.409 | 0.031 |
| 9.41 | 0.031 |
| 9.411 | 0.031 |
| 9.412 | 0.031 |
| 9.413 | 0.03 |
| 9.414 | 0.03 |
| 9.415 | 0.03 |
| 9.416 | 0.03 |
| 9.417 | 0.029 |
| 9.418 | 0.029 |
| 9.419 | 0.029 |
| 9.42 | 0.029 |
| 9.421 | 0.028 |
| 9.422 | 0.028 |
| 9.423 | 0.028 |
| 9.424 | 0.028 |
| 9.425 | 0.027 |
| 9.426 | 0.027 |
| 9.427 | 0.027 |
| 9.428 | 0.027 |
| 9.429 | 0.026 |
| 9.43 | 0.026 |
| 9.431 | 0.026 |
| 9.432 | 0.026 |
| 9.433 | 0.026 |
| 9.434 | 0.025 |
| 9.435 | 0.025 |
| 9.436 | 0.025 |
| 9.437 | 0.025 |
| 9.438 | 0.024 |
| 9.439 | 0.024 |
| 9.44 | 0.024 |
| 9.441 | 0.024 |
| 9.442 | 0.024 |
| 9.443 | 0.023 |
| 9.444 | 0.023 |
| 9.445 | 0.023 |
| 9.446 | 0.023 |
| 9.447 | 0.023 |
| 9.448 | 0.022 |
| 9.449 | 0.022 |
| 9.45 | 0.022 |
| 9.451 | 0.022 |
| 9.452 | 0.022 |
| 9.453 | 0.021 |
| 9.454 | 0.021 |
| 9.455 | 0.021 |
| 9.456 | 0.021 |
| 9.457 | 0.021 |
| 9.458 | 0.02 |
| 9.459 | 0.02 |
| 9.46 | 0.02 |
| 9.461 | 0.02 |
| 9.462 | 0.02 |
| 9.463 | 0.02 |
| 9.464 | 0.019 |
| 9.465 | 0.019 |
| 9.466 | 0.019 |
| 9.467 | 0.019 |
| 9.468 | 0.019 |
| 9.469 | 0.018 |
| 9.47 | 0.018 |
| 9.471 | 0.018 |
| 9.472 | 0.018 |
| 9.473 | 0.018 |
| 9.474 | 0.018 |
| 9.475 | 0.017 |
| 9.476 | 0.017 |
| 9.477 | 0.017 |
| 9.478 | 0.017 |
| 9.479 | 0.017 |
| 9.48 | 0.017 |
| 9.481 | 0.016 |
| 9.482 | 0.016 |
| 9.483 | 0.016 |
| 9.484 | 0.016 |
| 9.485 | 0.016 |
| 9.486 | 0.016 |
| 9.487 | 0.016 |
| 9.488 | 0.015 |
| 9.489 | 0.015 |
| 9.49 | 0.015 |
| 9.491 | 0.015 |
| 9.492 | 0.015 |
| 9.493 | 0.015 |
| 9.494 | 0.015 |
| 9.495 | 0.014 |
| 9.496 | 0.014 |
| 9.497 | 0.014 |
| 9.498 | 0.014 |
| 9.499 | 0.014 |
| 9.5 | 0.014 |
| 9.501 | 0.014 |
| 9.502 | 0.013 |
| 9.503 | 0.013 |
| 9.504 | 0.013 |
| 9.505 | 0.013 |
| 9.506 | 0.013 |
| 9.507 | 0.013 |
| 9.508 | 0.013 |
| 9.509 | 0.012 |
| 9.51 | 0.012 |
| 9.511 | 0.012 |
| 9.512 | 0.012 |
| 9.513 | 0.012 |
| 9.514 | 0.012 |
| 9.515 | 0.012 |
| 9.516 | 0.012 |
| 9.517 | 0.012 |
| 9.518 | 0.011 |
| 9.519 | 0.011 |
| 9.52 | 0.011 |
| 9.521 | 0.011 |
| 9.522 | 0.011 |
| 9.523 | 0.011 |
| 9.524 | 0.011 |
| 9.525 | 0.011 |
| 9.526 | 0.01 |
| 9.527 | 0.01 |
| 9.528 | 0.01 |
| 9.529 | 0.01 |
| 9.53 | 0.01 |
| 9.531 | 0.01 |
| 9.532 | 0.01 |
| 9.533 | 0.01 |
| 9.534 | 0.01 |
| 9.535 | 0.01 |
| 9.536 | 0.009 |
| 9.537 | 0.009 |
| 9.538 | 0.009 |
| 9.539 | 0.009 |
| 9.54 | 0.009 |
| 9.541 | 0.009 |
| 9.542 | 0.009 |
| 9.543 | 0.009 |
| 9.544 | 0.009 |
| 9.545 | 0.009 |
| 9.546 | 0.008 |
| 9.547 | 0.008 |
| 9.548 | 0.008 |
| 9.549 | 0.008 |
| 9.55 | 0.008 |
| 9.551 | 0.008 |
| 9.552 | 0.008 |
| 9.553 | 0.008 |
| 9.554 | 0.008 |
| 9.555 | 0.008 |
| 9.556 | 0.008 |
| 9.557 | 0.007 |
| 9.558 | 0.007 |
| 9.559 | 0.007 |
| 9.56 | 0.007 |
| 9.561 | 0.007 |
| 9.562 | 0.007 |
| 9.563 | 0.007 |
| 9.564 | 0.007 |
| 9.565 | 0.007 |
| 9.566 | 0.007 |
| 9.567 | 0.007 |
| 9.568 | 0.007 |
| 9.569 | 0.007 |
| 9.57 | 0.006 |
| 9.571 | 0.006 |
| 9.572 | 0.006 |
| 9.573 | 0.006 |
| 9.574 | 0.006 |
| 9.575 | 0.006 |
| 9.576 | 0.006 |
| 9.577 | 0.006 |
| 9.578 | 0.006 |
| 9.579 | 0.006 |
| 9.58 | 0.006 |
| 9.581 | 0.006 |
| 9.582 | 0.006 |
| 9.583 | 0.006 |
| 9.584 | 0.006 |
| 9.585 | 0.005 |
| 9.586 | 0.005 |
| 9.587 | 0.005 |
| 9.588 | 0.005 |
| 9.589 | 0.005 |
| 9.59 | 0.005 |
| 9.591 | 0.005 |
| 9.592 | 0.005 |
| 9.593 | 0.005 |
| 9.594 | 0.005 |
| 9.595 | 0.005 |
| 9.596 | 0.005 |
| 9.597 | 0.005 |
| 9.598 | 0.005 |
| 9.599 | 0.005 |
| 9.6 | 0.005 |
| 9.601 | 0.004 |
| 9.602 | 0.004 |
| 9.603 | 0.004 |
| 9.604 | 0.004 |
| 9.605 | 0.004 |
| 9.606 | 0.004 |
| 9.607 | 0.004 |
| 9.608 | 0.004 |
| 9.609 | 0.004 |
| 9.61 | 0.004 |
| 9.611 | 0.004 |
| 9.612 | 0.004 |
| 9.613 | 0.004 |
| 9.614 | 0.004 |
| 9.615 | 0.004 |
| 9.616 | 0.004 |
| 9.617 | 0.004 |
| 9.618 | 0.004 |
| 9.619 | 0.004 |
| 9.62 | 0.004 |
| 9.621 | 0.004 |
| 9.622 | 0.003 |
| 9.623 | 0.003 |
| 9.624 | 0.003 |
| 9.625 | 0.003 |
| 9.626 | 0.003 |
| 9.627 | 0.003 |
| 9.628 | 0.003 |
| 9.629 | 0.003 |
| 9.63 | 0.003 |
| 9.631 | 0.003 |
| 9.632 | 0.003 |
| 9.633 | 0.003 |
| 9.634 | 0.003 |
| 9.635 | 0.003 |
| 9.636 | 0.003 |
| 9.637 | 0.003 |
| 9.638 | 0.003 |
| 9.639 | 0.003 |
| 9.64 | 0.003 |
| 9.641 | 0.003 |
| 9.642 | 0.003 |
| 9.643 | 0.003 |
| 9.644 | 0.003 |
| 9.645 | 0.003 |
| 9.646 | 0.003 |
| 9.647 | 0.003 |
| 9.648 | 0.003 |
| 9.649 | 0.002 |
| 9.65 | 0.002 |
| 9.651 | 0.002 |
| 9.652 | 0.002 |
| 9.653 | 0.002 |
| 9.654 | 0.002 |
| 9.655 | 0.002 |
| 9.656 | 0.002 |
| 9.657 | 0.002 |
| 9.658 | 0.002 |
| 9.659 | 0.002 |
| 9.66 | 0.002 |
| 9.661 | 0.002 |
| 9.662 | 0.002 |
| 9.663 | 0.002 |
| 9.664 | 0.002 |
| 9.665 | 0.002 |
| 9.666 | 0.002 |
| 9.667 | 0.002 |
| 9.668 | 0.002 |
| 9.669 | 0.002 |
| 9.67 | 0.002 |
| 9.671 | 0.002 |
| 9.672 | 0.002 |
| 9.673 | 0.002 |
| 9.674 | 0.002 |
| 9.675 | 0.002 |
| 9.676 | 0.002 |
| 9.677 | 0.002 |
| 9.678 | 0.002 |
| 9.679 | 0.002 |
| 9.68 | 0.002 |
| 9.681 | 0.002 |
| 9.682 | 0.002 |
| 9.683 | 0.002 |
| 9.684 | 0.002 |
| 9.685 | 0.002 |
| 9.686 | 0.002 |
| 9.687 | 0.001 |
| 9.688 | 0.001 |
| 9.689 | 0.001 |
| 9.69 | 0.001 |
| 9.691 | 0.001 |
| 9.692 | 0.001 |
| 9.693 | 0.001 |
| 9.694 | 0.001 |
| 9.695 | 0.001 |
| 9.696 | 0.001 |
| 9.697 | 0.001 |
| 9.698 | 0.001 |
| 9.699 | 0.001 |
| 9.7 | 0.001 |
| 9.701 | 0.001 |
| 9.702 | 0.001 |
| 9.703 | 0.001 |
| 9.704 | 0.001 |
| 9.705 | 0.001 |
| 9.706 | 0.001 |
| 9.707 | 0.001 |
| 9.708 | 0.001 |
| 9.709 | 0.001 |
| 9.71 | 0.001 |
| 9.711 | 0.001 |
| 9.712 | 0.001 |
| 9.713 | 0.001 |
| 9.714 | 0.001 |
| 9.715 | 0.001 |
| 9.716 | 0.001 |
| 9.717 | 0.001 |
| 9.718 | 0.001 |
| 9.719 | 0.001 |
| 9.72 | 0.001 |
| 9.721 | 0.001 |
| 9.722 | 0.001 |
| 9.723 | 0.001 |
| 9.724 | 0.001 |
| 9.725 | 0.001 |
| 9.726 | 0.001 |
| 9.727 | 0.001 |
| 9.728 | 0.001 |
| 9.729 | 0.001 |
| 9.73 | 0.001 |
| 9.731 | 0.001 |
| 9.732 | 0.001 |
| 9.733 | 0.001 |
| 9.734 | 0.001 |
| 9.735 | 0.001 |
| 9.736 | 0.001 |
| 9.737 | 0.001 |
| 9.738 | 0.001 |
| 9.739 | 0.001 |
| 9.74 | 0.001 |
| 9.741 | 0.001 |
| 9.742 | 0.001 |
| 9.743 | 0.001 |
| 9.744 | 0.001 |
| 9.745 | 0.001 |
| 9.746 | 0.001 |
| 9.747 | 0.001 |
| 9.748 | 0.001 |
| 9.749 | 0.001 |
| 9.75 | 0.001 |
| 9.751 | 0.001 |
| 9.752 | 0.001 |
| 9.753 | 0.001 |
| 9.754 | 0.001 |
| 9.755 | 0.001 |
| 9.756 | 0.001 |
| 9.757 | 0.001 |
| 9.758 | 0.001 |
| 9.759 | 0.001 |
| 9.76 | 0.001 |
| 9.761 | 0.001 |
| 9.762 | 0.001 |
| 9.763 | 0 |
| 9.764 | 0 |
| 9.765 | 0 |
| 9.766 | 0 |
| 9.767 | 0 |
| 9.768 | 0 |
| 9.769 | 0 |
| 9.77 | 0 |
| 9.771 | 0 |
| 9.772 | 0 |
| 9.773 | 0 |
| 9.774 | 0 |
| 9.775 | 0 |
| 9.776 | 0 |
| 9.777 | 0 |
| 9.778 | 0 |
| 9.779 | 0 |
| 9.78 | 0 |
| 9.781 | 0 |
| 9.782 | 0 |
| 9.783 | 0 |
| 9.784 | 0 |
| 9.785 | 0 |
| 9.786 | 0 |
| 9.787 | 0 |
| 9.788 | 0 |
| 9.789 | 0 |
| 9.79 | 0 |
| 9.791 | 0 |
| 9.792 | 0 |
| 9.793 | 0 |
| 9.794 | 0 |
| 9.795 | 0 |
| 9.796 | 0 |
| 9.797 | 0 |
| 9.798 | 0 |
| 9.799 | 0 |
| 9.8 | 0 |
| 9.801 | 0 |
| 9.802 | 0 |
| 9.803 | 0 |
| 9.804 | 0 |
| 9.805 | 0 |
| 9.806 | 0 |
| 9.807 | 0 |
| 9.808 | 0 |
| 9.809 | 0 |
| 9.81 | 0 |
| 9.811 | 0 |
| 9.812 | 0 |
| 9.813 | 0 |
| 9.814 | 0 |
| 9.815 | 0 |
| 9.816 | 0 |
| 9.817 | 0 |
| 9.818 | 0 |
| 9.819 | 0 |
| 9.82 | 0 |
| 9.821 | 0 |
| 9.822 | 0 |
| 9.823 | 0 |
| 9.824 | 0 |
| 9.825 | 0 |
| 9.826 | 0 |
| 9.827 | 0 |
| 9.828 | 0 |
| 9.829 | 0 |
| 9.83 | 0 |
| 9.831 | 0 |
| 9.832 | 0 |
| 9.833 | 0 |
| 9.834 | 0 |
| 9.835 | 0 |
| 9.836 | 0 |
| 9.837 | 0 |
| 9.838 | 0 |
| 9.839 | 0 |
| 9.84 | 0 |
| 9.841 | 0 |
| 9.842 | 0 |
| 9.843 | 0 |
| 9.844 | 0 |
| 9.845 | 0 |
| 9.846 | 0 |
| 9.847 | 0 |
| 9.848 | 0 |
| 9.849 | 0 |
| 9.85 | 0 |
| 9.851 | 0 |
| 9.852 | 0 |
| 9.853 | 0 |
| 9.854 | 0 |
| 9.855 | 0 |
| 9.856 | 0 |
| 9.857 | 0 |
| 9.858 | 0 |
| 9.859 | 0 |
| 9.86 | 0 |
| 9.861 | 0 |
| 9.862 | 0 |
| 9.863 | 0 |
| 9.864 | 0 |
| 9.865 | 0 |
| 9.866 | 0 |
| 9.867 | 0 |
| 9.868 | 0 |
| 9.869 | 0 |
| 9.87 | 0 |
| 9.871 | 0 |
| 9.872 | 0 |
| 9.873 | 0 |
| 9.874 | 0 |
| 9.875 | 0 |
| 9.876 | 0 |
| 9.877 | 0 |
| 9.878 | 0 |
| 9.879 | 0 |
| 9.88 | 0 |
| 9.881 | 0 |
| 9.882 | 0 |
| 9.883 | 0 |
| 9.884 | 0 |
| 9.885 | 0 |
| 9.886 | 0 |
| 9.887 | 0 |
| 9.888 | 0 |
| 9.889 | 0 |
| 9.89 | 0 |
| 9.891 | 0 |
| 9.892 | 0 |
| 9.893 | 0 |
| 9.894 | 0 |
| 9.895 | 0 |
| 9.896 | 0 |
| 9.897 | 0 |
| 9.898 | 0 |
| 9.899 | 0 |
| 9.9 | 0 |
| 9.901 | 0 |
| 9.902 | 0 |
| 9.903 | 0 |
| 9.904 | 0 |
| 9.905 | 0 |
| 9.906 | 0 |
| 9.907 | 0 |
| 9.908 | 0 |
| 9.909 | 0 |
| 9.91 | 0 |
| 9.911 | 0 |
| 9.912 | 0 |
| 9.913 | 0 |
| 9.914 | 0 |
| 9.915 | 0 |
| 9.916 | 0 |
| 9.917 | 0 |
| 9.918 | 0 |
| 9.919 | 0 |
| 9.92 | 0 |
| 9.921 | 0 |
| 9.922 | 0 |
| 9.923 | 0 |
| 9.924 | 0 |
| 9.925 | 0 |
| 9.926 | 0 |
| 9.927 | 0 |
| 9.928 | 0 |
| 9.929 | 0 |
| 9.93 | 0 |
| 9.931 | 0 |
| 9.932 | 0 |
| 9.933 | 0 |
| 9.934 | 0 |
| 9.935 | 0 |
| 9.936 | 0 |
| 9.937 | 0 |
| 9.938 | 0 |
| 9.939 | 0 |
| 9.94 | 0 |
| 9.941 | 0 |
| 9.942 | 0 |
| 9.943 | 0 |
| 9.944 | 0 |
| 9.945 | 0 |
| 9.946 | 0 |
| 9.947 | 0 |
| 9.948 | 0 |
| 9.949 | 0 |
| 9.95 | 0 |
| 9.951 | 0 |
| 9.952 | 0 |
| 9.953 | 0 |
| 9.954 | 0 |
| 9.955 | 0 |
| 9.956 | 0 |
| 9.957 | 0 |
| 9.958 | 0 |
| 9.959 | 0 |
| 9.96 | 0 |
| 9.961 | 0 |
| 9.962 | 0 |
| 9.963 | 0 |
| 9.964 | 0 |
| 9.965 | 0 |
| 9.966 | 0 |
| 9.967 | 0 |
| 9.968 | 0 |
| 9.969 | 0 |
| 9.97 | 0 |
| 9.971 | 0 |
| 9.972 | 0 |
| 9.973 | 0 |
| 9.974 | 0 |
| 9.975 | 0 |
| 9.976 | 0 |
| 9.977 | 0 |
| 9.978 | 0 |
| 9.979 | 0 |
| 9.98 | 0 |
| 9.981 | 0 |
| 9.982 | 0 |
| 9.983 | 0 |
| 9.984 | 0 |
| 9.985 | 0 |
| 9.986 | 0 |
| 9.987 | 0 |
| 9.988 | 0 |
| 9.989 | 0 |
| 9.99 | 0 |
| 9.991 | 0 |
| 9.992 | 0 |
| 9.993 | 0 |
| 9.994 | 0 |
| 9.995 | 0 |
| 9.996 | 0 |
| 9.997 | 0 |
| 9.998 | 0 |
| 9.999 | 0 |
| 10.0 | 0 |